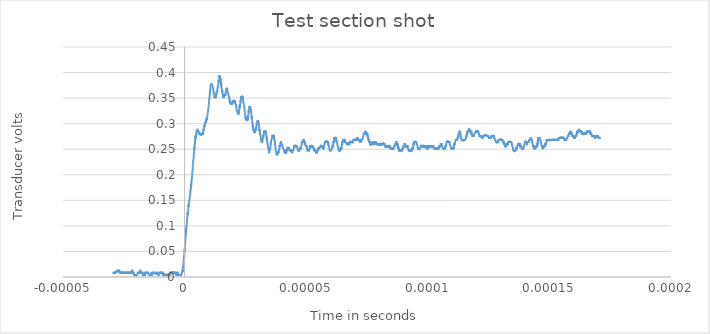
| Category | Series 0 |
|---|---|
| -2.92e-05 | 0.01 |
| -2.9168e-05 | 0.006 |
| -2.9136e-05 | 0.01 |
| -2.9104e-05 | 0.01 |
| -2.9072e-05 | 0.01 |
| -2.904e-05 | 0.01 |
| -2.9008e-05 | 0.01 |
| -2.8976e-05 | 0.01 |
| -2.8944e-05 | 0.01 |
| -2.8912e-05 | 0.01 |
| -2.888e-05 | 0.006 |
| -2.8848e-05 | 0.01 |
| -2.8816e-05 | 0.01 |
| -2.8784e-05 | 0.006 |
| -2.8752e-05 | 0.01 |
| -2.872e-05 | 0.01 |
| -2.8688e-05 | 0.01 |
| -2.8656e-05 | 0.006 |
| -2.8624e-05 | 0.01 |
| -2.8592e-05 | 0.01 |
| -2.856e-05 | 0.01 |
| -2.8528e-05 | 0.01 |
| -2.8496e-05 | 0.01 |
| -2.8464e-05 | 0.01 |
| -2.8432e-05 | 0.01 |
| -2.84e-05 | 0.01 |
| -2.8368e-05 | 0.01 |
| -2.8336e-05 | 0.01 |
| -2.8304e-05 | 0.01 |
| -2.8272e-05 | 0.01 |
| -2.824e-05 | 0.01 |
| -2.8208e-05 | 0.01 |
| -2.8176e-05 | 0.01 |
| -2.8144e-05 | 0.01 |
| -2.8112e-05 | 0.01 |
| -2.808e-05 | 0.01 |
| -2.8048e-05 | 0.01 |
| -2.8016e-05 | 0.01 |
| -2.7984e-05 | 0.01 |
| -2.7952e-05 | 0.01 |
| -2.792e-05 | 0.01 |
| -2.7888e-05 | 0.01 |
| -2.7856e-05 | 0.01 |
| -2.7824e-05 | 0.01 |
| -2.7792e-05 | 0.01 |
| -2.776e-05 | 0.01 |
| -2.7728e-05 | 0.01 |
| -2.7696e-05 | 0.014 |
| -2.7664e-05 | 0.01 |
| -2.7632e-05 | 0.01 |
| -2.76e-05 | 0.01 |
| -2.7568e-05 | 0.01 |
| -2.7536e-05 | 0.01 |
| -2.7504e-05 | 0.01 |
| -2.7472e-05 | 0.01 |
| -2.744e-05 | 0.01 |
| -2.7408e-05 | 0.01 |
| -2.7376e-05 | 0.01 |
| -2.7344e-05 | 0.01 |
| -2.7312e-05 | 0.01 |
| -2.728e-05 | 0.01 |
| -2.7248e-05 | 0.01 |
| -2.7216e-05 | 0.01 |
| -2.7184e-05 | 0.01 |
| -2.7152e-05 | 0.01 |
| -2.712e-05 | 0.01 |
| -2.7088e-05 | 0.014 |
| -2.7056e-05 | 0.01 |
| -2.7024e-05 | 0.01 |
| -2.6992e-05 | 0.01 |
| -2.696e-05 | 0.01 |
| -2.6928e-05 | 0.01 |
| -2.6896e-05 | 0.01 |
| -2.6864e-05 | 0.01 |
| -2.6832e-05 | 0.014 |
| -2.68e-05 | 0.01 |
| -2.6768e-05 | 0.01 |
| -2.6736e-05 | 0.01 |
| -2.6704e-05 | 0.01 |
| -2.6672e-05 | 0.01 |
| -2.664e-05 | 0.01 |
| -2.6608e-05 | 0.01 |
| -2.6576e-05 | 0.01 |
| -2.6544e-05 | 0.01 |
| -2.6512e-05 | 0.01 |
| -2.648e-05 | 0.01 |
| -2.6448e-05 | 0.01 |
| -2.6416e-05 | 0.006 |
| -2.6384e-05 | 0.01 |
| -2.6352e-05 | 0.01 |
| -2.632e-05 | 0.01 |
| -2.6288e-05 | 0.01 |
| -2.6256e-05 | 0.01 |
| -2.6224e-05 | 0.006 |
| -2.6192e-05 | 0.01 |
| -2.616e-05 | 0.006 |
| -2.6128e-05 | 0.006 |
| -2.6096e-05 | 0.006 |
| -2.6064e-05 | 0.01 |
| -2.6032e-05 | 0.01 |
| -2.6e-05 | 0.006 |
| -2.5968e-05 | 0.01 |
| -2.5936e-05 | 0.01 |
| -2.5904e-05 | 0.01 |
| -2.5872e-05 | 0.01 |
| -2.584e-05 | 0.01 |
| -2.5808e-05 | 0.01 |
| -2.5776e-05 | 0.006 |
| -2.5744e-05 | 0.01 |
| -2.5712e-05 | 0.01 |
| -2.568e-05 | 0.01 |
| -2.5648e-05 | 0.006 |
| -2.5616e-05 | 0.01 |
| -2.5584e-05 | 0.01 |
| -2.5552e-05 | 0.01 |
| -2.552e-05 | 0.01 |
| -2.5488e-05 | 0.01 |
| -2.5456e-05 | 0.01 |
| -2.5424e-05 | 0.01 |
| -2.5392e-05 | 0.01 |
| -2.536e-05 | 0.01 |
| -2.5328e-05 | 0.006 |
| -2.5296e-05 | 0.01 |
| -2.5264e-05 | 0.01 |
| -2.5232e-05 | 0.01 |
| -2.52e-05 | 0.01 |
| -2.5168e-05 | 0.01 |
| -2.5136e-05 | 0.01 |
| -2.5104e-05 | 0.01 |
| -2.5072e-05 | 0.01 |
| -2.504e-05 | 0.01 |
| -2.5008e-05 | 0.01 |
| -2.4976e-05 | 0.006 |
| -2.4944e-05 | 0.01 |
| -2.4912e-05 | 0.01 |
| -2.488e-05 | 0.01 |
| -2.4848e-05 | 0.01 |
| -2.4816e-05 | 0.01 |
| -2.4784e-05 | 0.006 |
| -2.4752e-05 | 0.01 |
| -2.472e-05 | 0.006 |
| -2.4688e-05 | 0.01 |
| -2.4656e-05 | 0.01 |
| -2.4624e-05 | 0.006 |
| -2.4592e-05 | 0.01 |
| -2.456e-05 | 0.006 |
| -2.4528e-05 | 0.01 |
| -2.4496e-05 | 0.01 |
| -2.4464e-05 | 0.006 |
| -2.4432e-05 | 0.01 |
| -2.44e-05 | 0.01 |
| -2.4368e-05 | 0.006 |
| -2.4336e-05 | 0.006 |
| -2.4304e-05 | 0.006 |
| -2.4272e-05 | 0.006 |
| -2.424e-05 | 0.006 |
| -2.4208e-05 | 0.006 |
| -2.4176e-05 | 0.006 |
| -2.4144e-05 | 0.006 |
| -2.4112e-05 | 0.006 |
| -2.408e-05 | 0.006 |
| -2.4048e-05 | 0.01 |
| -2.4016e-05 | 0.01 |
| -2.3984e-05 | 0.01 |
| -2.3952e-05 | 0.01 |
| -2.392e-05 | 0.01 |
| -2.3888e-05 | 0.01 |
| -2.3856e-05 | 0.01 |
| -2.3824e-05 | 0.01 |
| -2.3792e-05 | 0.006 |
| -2.376e-05 | 0.01 |
| -2.3728e-05 | 0.01 |
| -2.3696e-05 | 0.01 |
| -2.3664e-05 | 0.01 |
| -2.3632e-05 | 0.01 |
| -2.36e-05 | 0.01 |
| -2.3568e-05 | 0.01 |
| -2.3536e-05 | 0.01 |
| -2.3504e-05 | 0.006 |
| -2.3472e-05 | 0.01 |
| -2.344e-05 | 0.01 |
| -2.3408e-05 | 0.01 |
| -2.3376e-05 | 0.01 |
| -2.3344e-05 | 0.006 |
| -2.3312e-05 | 0.01 |
| -2.328e-05 | 0.01 |
| -2.3248e-05 | 0.006 |
| -2.3216e-05 | 0.01 |
| -2.3184e-05 | 0.01 |
| -2.3152e-05 | 0.01 |
| -2.312e-05 | 0.01 |
| -2.3088e-05 | 0.01 |
| -2.3056e-05 | 0.006 |
| -2.3024e-05 | 0.01 |
| -2.2992e-05 | 0.01 |
| -2.296e-05 | 0.01 |
| -2.2928e-05 | 0.01 |
| -2.2896e-05 | 0.01 |
| -2.2864e-05 | 0.01 |
| -2.2832e-05 | 0.01 |
| -2.28e-05 | 0.01 |
| -2.2768e-05 | 0.006 |
| -2.2736e-05 | 0.01 |
| -2.2704e-05 | 0.01 |
| -2.2672e-05 | 0.01 |
| -2.264e-05 | 0.01 |
| -2.2608e-05 | 0.01 |
| -2.2576e-05 | 0.01 |
| -2.2544e-05 | 0.01 |
| -2.2512e-05 | 0.01 |
| -2.248e-05 | 0.01 |
| -2.2448e-05 | 0.01 |
| -2.2416e-05 | 0.01 |
| -2.2384e-05 | 0.01 |
| -2.2352e-05 | 0.01 |
| -2.232e-05 | 0.01 |
| -2.2288e-05 | 0.01 |
| -2.2256e-05 | 0.01 |
| -2.2224e-05 | 0.006 |
| -2.2192e-05 | 0.01 |
| -2.216e-05 | 0.006 |
| -2.2128e-05 | 0.01 |
| -2.2096e-05 | 0.01 |
| -2.2064e-05 | 0.01 |
| -2.2032e-05 | 0.01 |
| -2.2e-05 | 0.01 |
| -2.1968e-05 | 0.01 |
| -2.1936e-05 | 0.01 |
| -2.1904e-05 | 0.01 |
| -2.1872e-05 | 0.01 |
| -2.184e-05 | 0.01 |
| -2.1808e-05 | 0.01 |
| -2.1776e-05 | 0.01 |
| -2.1744e-05 | 0.01 |
| -2.1712e-05 | 0.01 |
| -2.168e-05 | 0.01 |
| -2.1648e-05 | 0.01 |
| -2.1616e-05 | 0.01 |
| -2.1584e-05 | 0.01 |
| -2.1552e-05 | 0.01 |
| -2.152e-05 | 0.014 |
| -2.1488e-05 | 0.01 |
| -2.1456e-05 | 0.01 |
| -2.1424e-05 | 0.01 |
| -2.1392e-05 | 0.01 |
| -2.136e-05 | 0.01 |
| -2.1328e-05 | 0.006 |
| -2.1296e-05 | 0.01 |
| -2.1264e-05 | 0.01 |
| -2.1232e-05 | 0.01 |
| -2.12e-05 | 0.006 |
| -2.1168e-05 | 0.01 |
| -2.1136e-05 | 0.006 |
| -2.1104e-05 | 0.01 |
| -2.1072e-05 | 0.01 |
| -2.104e-05 | 0.01 |
| -2.1008e-05 | 0.01 |
| -2.0976e-05 | 0.01 |
| -2.0944e-05 | 0.006 |
| -2.0912e-05 | 0.006 |
| -2.088e-05 | 0.006 |
| -2.0848e-05 | 0.006 |
| -2.0816e-05 | 0.006 |
| -2.0784e-05 | 0.006 |
| -2.0752e-05 | 0.006 |
| -2.072e-05 | 0.006 |
| -2.0688e-05 | 0.006 |
| -2.0656e-05 | 0.006 |
| -2.0624e-05 | 0.002 |
| -2.0592e-05 | 0.002 |
| -2.056e-05 | 0.006 |
| -2.0528e-05 | 0.006 |
| -2.0496e-05 | 0.006 |
| -2.0464e-05 | 0.006 |
| -2.0432e-05 | 0.002 |
| -2.04e-05 | 0.002 |
| -2.0368e-05 | 0.006 |
| -2.0336e-05 | 0.002 |
| -2.0304e-05 | 0.002 |
| -2.0272e-05 | 0.002 |
| -2.024e-05 | 0.002 |
| -2.0208e-05 | 0.002 |
| -2.0176e-05 | 0.002 |
| -2.0144e-05 | 0.002 |
| -2.0112e-05 | 0.002 |
| -2.008e-05 | 0.002 |
| -2.0048e-05 | 0.006 |
| -2.0016e-05 | 0.002 |
| -1.9984e-05 | 0.002 |
| -1.9952e-05 | 0.002 |
| -1.992e-05 | 0.006 |
| -1.9888e-05 | 0.002 |
| -1.9856e-05 | 0.002 |
| -1.9824e-05 | 0.006 |
| -1.9792e-05 | 0.002 |
| -1.976e-05 | 0.002 |
| -1.9728e-05 | 0.002 |
| -1.9696e-05 | 0.002 |
| -1.9664e-05 | 0.002 |
| -1.9632e-05 | 0.002 |
| -1.96e-05 | 0.006 |
| -1.9568e-05 | 0.006 |
| -1.9536e-05 | 0.006 |
| -1.9504e-05 | 0.006 |
| -1.9472e-05 | 0.006 |
| -1.944e-05 | 0.006 |
| -1.9408e-05 | 0.006 |
| -1.9376e-05 | 0.006 |
| -1.9344e-05 | 0.006 |
| -1.9312e-05 | 0.006 |
| -1.928e-05 | 0.006 |
| -1.9248e-05 | 0.006 |
| -1.9216e-05 | 0.01 |
| -1.9184e-05 | 0.006 |
| -1.9152e-05 | 0.006 |
| -1.912e-05 | 0.006 |
| -1.9088e-05 | 0.01 |
| -1.9056e-05 | 0.006 |
| -1.9024e-05 | 0.01 |
| -1.8992e-05 | 0.01 |
| -1.896e-05 | 0.006 |
| -1.8928e-05 | 0.006 |
| -1.8896e-05 | 0.006 |
| -1.8864e-05 | 0.01 |
| -1.8832e-05 | 0.006 |
| -1.88e-05 | 0.01 |
| -1.8768e-05 | 0.006 |
| -1.8736e-05 | 0.006 |
| -1.8704e-05 | 0.006 |
| -1.8672e-05 | 0.01 |
| -1.864e-05 | 0.01 |
| -1.8608e-05 | 0.01 |
| -1.8576e-05 | 0.01 |
| -1.8544e-05 | 0.01 |
| -1.8512e-05 | 0.01 |
| -1.848e-05 | 0.01 |
| -1.8448e-05 | 0.01 |
| -1.8416e-05 | 0.01 |
| -1.8384e-05 | 0.01 |
| -1.8352e-05 | 0.01 |
| -1.832e-05 | 0.01 |
| -1.8288e-05 | 0.01 |
| -1.8256e-05 | 0.01 |
| -1.8224e-05 | 0.01 |
| -1.8192e-05 | 0.014 |
| -1.816e-05 | 0.01 |
| -1.8128e-05 | 0.01 |
| -1.8096e-05 | 0.01 |
| -1.8064e-05 | 0.01 |
| -1.8032e-05 | 0.01 |
| -1.8e-05 | 0.01 |
| -1.7968e-05 | 0.01 |
| -1.7936e-05 | 0.01 |
| -1.7904e-05 | 0.01 |
| -1.7872e-05 | 0.01 |
| -1.784e-05 | 0.006 |
| -1.7808e-05 | 0.01 |
| -1.7776e-05 | 0.01 |
| -1.7744e-05 | 0.01 |
| -1.7712e-05 | 0.006 |
| -1.768e-05 | 0.006 |
| -1.7648e-05 | 0.01 |
| -1.7616e-05 | 0.01 |
| -1.7584e-05 | 0.01 |
| -1.7552e-05 | 0.006 |
| -1.752e-05 | 0.006 |
| -1.7488e-05 | 0.006 |
| -1.7456e-05 | 0.01 |
| -1.7424e-05 | 0.01 |
| -1.7392e-05 | 0.006 |
| -1.736e-05 | 0.006 |
| -1.7328e-05 | 0.006 |
| -1.7296e-05 | 0.01 |
| -1.7264e-05 | 0.006 |
| -1.7232e-05 | 0.006 |
| -1.72e-05 | 0.006 |
| -1.7168e-05 | 0.002 |
| -1.7136e-05 | 0.002 |
| -1.7104e-05 | 0.002 |
| -1.7072e-05 | 0.006 |
| -1.704e-05 | 0.002 |
| -1.7008e-05 | 0.002 |
| -1.6976e-05 | 0.006 |
| -1.6944e-05 | 0.006 |
| -1.6912e-05 | 0.006 |
| -1.688e-05 | 0.006 |
| -1.6848e-05 | 0.002 |
| -1.6816e-05 | 0.002 |
| -1.6784e-05 | 0.006 |
| -1.6752e-05 | 0.006 |
| -1.672e-05 | 0.006 |
| -1.6688e-05 | 0.006 |
| -1.6656e-05 | 0.002 |
| -1.6624e-05 | 0.006 |
| -1.6592e-05 | 0.006 |
| -1.656e-05 | 0.002 |
| -1.6528e-05 | 0.006 |
| -1.6496e-05 | 0.002 |
| -1.6464e-05 | 0.006 |
| -1.6432e-05 | 0.002 |
| -1.64e-05 | 0.006 |
| -1.6368e-05 | 0.002 |
| -1.6336e-05 | 0.006 |
| -1.6304e-05 | 0.01 |
| -1.6272e-05 | 0.006 |
| -1.624e-05 | 0.006 |
| -1.6208e-05 | 0.006 |
| -1.6176e-05 | 0.006 |
| -1.6144e-05 | 0.006 |
| -1.6112e-05 | 0.006 |
| -1.608e-05 | 0.006 |
| -1.6048e-05 | 0.006 |
| -1.6016e-05 | 0.006 |
| -1.5984e-05 | 0.01 |
| -1.5952e-05 | 0.01 |
| -1.592e-05 | 0.01 |
| -1.5888e-05 | 0.006 |
| -1.5856e-05 | 0.01 |
| -1.5824e-05 | 0.01 |
| -1.5792e-05 | 0.01 |
| -1.576e-05 | 0.006 |
| -1.5728e-05 | 0.006 |
| -1.5696e-05 | 0.01 |
| -1.5664e-05 | 0.01 |
| -1.5632e-05 | 0.006 |
| -1.56e-05 | 0.006 |
| -1.5568e-05 | 0.006 |
| -1.5536e-05 | 0.01 |
| -1.5504e-05 | 0.006 |
| -1.5472e-05 | 0.01 |
| -1.544e-05 | 0.01 |
| -1.5408e-05 | 0.01 |
| -1.5376e-05 | 0.01 |
| -1.5344e-05 | 0.006 |
| -1.5312e-05 | 0.006 |
| -1.528e-05 | 0.01 |
| -1.5248e-05 | 0.01 |
| -1.5216e-05 | 0.006 |
| -1.5184e-05 | 0.006 |
| -1.5152e-05 | 0.006 |
| -1.512e-05 | 0.006 |
| -1.5088e-05 | 0.01 |
| -1.5056e-05 | 0.01 |
| -1.5024e-05 | 0.006 |
| -1.4992e-05 | 0.006 |
| -1.496e-05 | 0.006 |
| -1.4928e-05 | 0.006 |
| -1.4896e-05 | 0.006 |
| -1.4864e-05 | 0.006 |
| -1.4832e-05 | 0.006 |
| -1.48e-05 | 0.006 |
| -1.4768e-05 | 0.006 |
| -1.4736e-05 | 0.006 |
| -1.4704e-05 | 0.006 |
| -1.4672e-05 | 0.006 |
| -1.464e-05 | 0.006 |
| -1.4608e-05 | 0.006 |
| -1.4576e-05 | 0.006 |
| -1.4544e-05 | 0.006 |
| -1.4512e-05 | 0.006 |
| -1.448e-05 | 0.006 |
| -1.4448e-05 | 0.002 |
| -1.4416e-05 | 0.006 |
| -1.4384e-05 | 0.006 |
| -1.4352e-05 | 0.006 |
| -1.432e-05 | 0.006 |
| -1.4288e-05 | 0.006 |
| -1.4256e-05 | 0.006 |
| -1.4224e-05 | 0.006 |
| -1.4192e-05 | 0.002 |
| -1.416e-05 | 0.006 |
| -1.4128e-05 | 0.002 |
| -1.4096e-05 | 0.006 |
| -1.4064e-05 | 0.006 |
| -1.4032e-05 | 0.006 |
| -1.4e-05 | 0.002 |
| -1.3968e-05 | 0.002 |
| -1.3936e-05 | 0.006 |
| -1.3904e-05 | 0.002 |
| -1.3872e-05 | 0.006 |
| -1.384e-05 | 0.006 |
| -1.3808e-05 | 0.006 |
| -1.3776e-05 | 0.006 |
| -1.3744e-05 | 0.006 |
| -1.3712e-05 | 0.006 |
| -1.368e-05 | 0.002 |
| -1.3648e-05 | 0.002 |
| -1.3616e-05 | 0.01 |
| -1.3584e-05 | 0.006 |
| -1.3552e-05 | 0.002 |
| -1.352e-05 | 0.006 |
| -1.3488e-05 | 0.006 |
| -1.3456e-05 | 0.006 |
| -1.3424e-05 | 0.006 |
| -1.3392e-05 | 0.006 |
| -1.336e-05 | 0.006 |
| -1.3328e-05 | 0.006 |
| -1.3296e-05 | 0.006 |
| -1.3264e-05 | 0.006 |
| -1.3232e-05 | 0.006 |
| -1.32e-05 | 0.006 |
| -1.3168e-05 | 0.006 |
| -1.3136e-05 | 0.006 |
| -1.3104e-05 | 0.006 |
| -1.3072e-05 | 0.01 |
| -1.304e-05 | 0.006 |
| -1.3008e-05 | 0.006 |
| -1.2976e-05 | 0.006 |
| -1.2944e-05 | 0.01 |
| -1.2912e-05 | 0.006 |
| -1.288e-05 | 0.01 |
| -1.2848e-05 | 0.01 |
| -1.2816e-05 | 0.01 |
| -1.2784e-05 | 0.006 |
| -1.2752e-05 | 0.006 |
| -1.272e-05 | 0.006 |
| -1.2688e-05 | 0.01 |
| -1.2656e-05 | 0.01 |
| -1.2624e-05 | 0.01 |
| -1.2592e-05 | 0.006 |
| -1.256e-05 | 0.006 |
| -1.2528e-05 | 0.006 |
| -1.2496e-05 | 0.006 |
| -1.2464e-05 | 0.006 |
| -1.2432e-05 | 0.006 |
| -1.24e-05 | 0.01 |
| -1.2368e-05 | 0.01 |
| -1.2336e-05 | 0.006 |
| -1.2304e-05 | 0.006 |
| -1.2272e-05 | 0.01 |
| -1.224e-05 | 0.006 |
| -1.2208e-05 | 0.006 |
| -1.2176e-05 | 0.006 |
| -1.2144e-05 | 0.006 |
| -1.2112e-05 | 0.006 |
| -1.208e-05 | 0.006 |
| -1.2048e-05 | 0.006 |
| -1.2016e-05 | 0.006 |
| -1.1984e-05 | 0.006 |
| -1.1952e-05 | 0.006 |
| -1.192e-05 | 0.01 |
| -1.1888e-05 | 0.006 |
| -1.1856e-05 | 0.006 |
| -1.1824e-05 | 0.006 |
| -1.1792e-05 | 0.006 |
| -1.176e-05 | 0.006 |
| -1.1728e-05 | 0.006 |
| -1.1696e-05 | 0.006 |
| -1.1664e-05 | 0.006 |
| -1.1632e-05 | 0.006 |
| -1.16e-05 | 0.006 |
| -1.1568e-05 | 0.006 |
| -1.1536e-05 | 0.006 |
| -1.1504e-05 | 0.006 |
| -1.1472e-05 | 0.006 |
| -1.144e-05 | 0.006 |
| -1.1408e-05 | 0.006 |
| -1.1376e-05 | 0.006 |
| -1.1344e-05 | 0.006 |
| -1.1312e-05 | 0.006 |
| -1.128e-05 | 0.006 |
| -1.1248e-05 | 0.006 |
| -1.1216e-05 | 0.006 |
| -1.1184e-05 | 0.006 |
| -1.1152e-05 | 0.01 |
| -1.112e-05 | 0.006 |
| -1.1088e-05 | 0.006 |
| -1.1056e-05 | 0.006 |
| -1.1024e-05 | 0.006 |
| -1.0992e-05 | 0.01 |
| -1.096e-05 | 0.006 |
| -1.0928e-05 | 0.006 |
| -1.0896e-05 | 0.006 |
| -1.0864e-05 | 0.006 |
| -1.0832e-05 | 0.006 |
| -1.08e-05 | 0.006 |
| -1.0768e-05 | 0.002 |
| -1.0736e-05 | 0.01 |
| -1.0704e-05 | 0.006 |
| -1.0672e-05 | 0.006 |
| -1.064e-05 | 0.006 |
| -1.0608e-05 | 0.006 |
| -1.0576e-05 | 0.006 |
| -1.0544e-05 | 0.006 |
| -1.0512e-05 | 0.006 |
| -1.048e-05 | 0.006 |
| -1.0448e-05 | 0.006 |
| -1.0416e-05 | 0.006 |
| -1.0384e-05 | 0.006 |
| -1.0352e-05 | 0.006 |
| -1.032e-05 | 0.006 |
| -1.0288e-05 | 0.006 |
| -1.0256e-05 | 0.01 |
| -1.0224e-05 | 0.006 |
| -1.0192e-05 | 0.006 |
| -1.016e-05 | 0.006 |
| -1.0128e-05 | 0.006 |
| -1.0096e-05 | 0.006 |
| -1.0064e-05 | 0.01 |
| -1.0032e-05 | 0.01 |
| -1e-05 | 0.01 |
| -9.968e-06 | 0.006 |
| -9.936e-06 | 0.01 |
| -9.904e-06 | 0.01 |
| -9.872e-06 | 0.006 |
| -9.84e-06 | 0.006 |
| -9.808e-06 | 0.01 |
| -9.776e-06 | 0.01 |
| -9.744e-06 | 0.006 |
| -9.712e-06 | 0.006 |
| -9.68e-06 | 0.006 |
| -9.648e-06 | 0.006 |
| -9.616e-06 | 0.01 |
| -9.584e-06 | 0.01 |
| -9.552e-06 | 0.01 |
| -9.52e-06 | 0.006 |
| -9.488e-06 | 0.006 |
| -9.456e-06 | 0.01 |
| -9.424e-06 | 0.006 |
| -9.392e-06 | 0.01 |
| -9.36e-06 | 0.01 |
| -9.328e-06 | 0.01 |
| -9.296e-06 | 0.006 |
| -9.264e-06 | 0.006 |
| -9.232e-06 | 0.006 |
| -9.2e-06 | 0.006 |
| -9.168e-06 | 0.006 |
| -9.136e-06 | 0.01 |
| -9.104e-06 | 0.01 |
| -9.072e-06 | 0.01 |
| -9.04e-06 | 0.006 |
| -9.008e-06 | 0.006 |
| -8.976e-06 | 0.01 |
| -8.944e-06 | 0.006 |
| -8.912e-06 | 0.006 |
| -8.88e-06 | 0.006 |
| -8.848e-06 | 0.006 |
| -8.816e-06 | 0.006 |
| -8.784e-06 | 0.006 |
| -8.752e-06 | 0.006 |
| -8.72e-06 | 0.006 |
| -8.688e-06 | 0.006 |
| -8.656e-06 | 0.002 |
| -8.624e-06 | 0.006 |
| -8.592e-06 | 0.006 |
| -8.56e-06 | 0.006 |
| -8.528e-06 | 0.006 |
| -8.496e-06 | 0.006 |
| -8.464e-06 | 0.006 |
| -8.432e-06 | 0.006 |
| -8.4e-06 | 0.006 |
| -8.368e-06 | 0.006 |
| -8.336e-06 | 0.006 |
| -8.304e-06 | 0.006 |
| -8.272e-06 | 0.006 |
| -8.24e-06 | 0.006 |
| -8.208e-06 | 0.006 |
| -8.176e-06 | 0.006 |
| -8.144e-06 | 0.006 |
| -8.112e-06 | 0.006 |
| -8.08e-06 | 0.006 |
| -8.048e-06 | 0.006 |
| -8.016e-06 | 0.002 |
| -7.984e-06 | 0.006 |
| -7.952e-06 | 0.002 |
| -7.92e-06 | 0.006 |
| -7.888e-06 | 0.002 |
| -7.856e-06 | 0.006 |
| -7.824e-06 | 0.006 |
| -7.792e-06 | 0.006 |
| -7.76e-06 | 0.006 |
| -7.728e-06 | 0.006 |
| -7.696e-06 | 0.002 |
| -7.664e-06 | 0.006 |
| -7.632e-06 | 0.006 |
| -7.6e-06 | 0.006 |
| -7.568e-06 | 0.006 |
| -7.536e-06 | 0.002 |
| -7.504e-06 | 0.002 |
| -7.472e-06 | 0.006 |
| -7.44e-06 | 0.006 |
| -7.408e-06 | 0.006 |
| -7.376e-06 | 0.002 |
| -7.344e-06 | 0.006 |
| -7.312e-06 | 0.006 |
| -7.28e-06 | 0.002 |
| -7.248e-06 | 0.006 |
| -7.216e-06 | 0.006 |
| -7.184e-06 | 0.006 |
| -7.152e-06 | 0.006 |
| -7.12e-06 | 0.002 |
| -7.088e-06 | 0.006 |
| -7.056e-06 | 0.006 |
| -7.024e-06 | 0.006 |
| -6.992e-06 | 0.002 |
| -6.96e-06 | 0.006 |
| -6.928e-06 | 0.002 |
| -6.896e-06 | 0.002 |
| -6.864e-06 | 0.006 |
| -6.832e-06 | 0.006 |
| -6.8e-06 | 0.002 |
| -6.768e-06 | 0.006 |
| -6.736e-06 | 0.006 |
| -6.704e-06 | 0.006 |
| -6.672e-06 | 0.006 |
| -6.64e-06 | 0.006 |
| -6.608e-06 | 0.006 |
| -6.576e-06 | 0.006 |
| -6.544e-06 | 0.006 |
| -6.512e-06 | 0.006 |
| -6.48e-06 | 0.006 |
| -6.448e-06 | 0.006 |
| -6.416e-06 | 0.006 |
| -6.384e-06 | 0.006 |
| -6.352e-06 | 0.002 |
| -6.32e-06 | 0.006 |
| -6.288e-06 | 0.006 |
| -6.256e-06 | 0.006 |
| -6.224e-06 | 0.006 |
| -6.192e-06 | 0.006 |
| -6.16e-06 | 0.006 |
| -6.128e-06 | 0.006 |
| -6.096e-06 | 0.006 |
| -6.064e-06 | 0.006 |
| -6.032e-06 | 0.01 |
| -6e-06 | 0.006 |
| -5.968e-06 | 0.006 |
| -5.936e-06 | 0.002 |
| -5.904e-06 | 0.006 |
| -5.872e-06 | 0.006 |
| -5.84e-06 | 0.01 |
| -5.808e-06 | 0.01 |
| -5.776e-06 | 0.006 |
| -5.744e-06 | 0.01 |
| -5.712e-06 | 0.01 |
| -5.68e-06 | 0.006 |
| -5.648e-06 | 0.006 |
| -5.616e-06 | 0.01 |
| -5.584e-06 | 0.01 |
| -5.552e-06 | 0.006 |
| -5.52e-06 | 0.01 |
| -5.488e-06 | 0.006 |
| -5.456e-06 | 0.01 |
| -5.424e-06 | 0.01 |
| -5.392e-06 | 0.01 |
| -5.36e-06 | 0.01 |
| -5.328e-06 | 0.01 |
| -5.296e-06 | 0.01 |
| -5.264e-06 | 0.01 |
| -5.232e-06 | 0.01 |
| -5.2e-06 | 0.01 |
| -5.168e-06 | 0.01 |
| -5.136e-06 | 0.01 |
| -5.104e-06 | 0.01 |
| -5.072e-06 | 0.01 |
| -5.04e-06 | 0.01 |
| -5.008e-06 | 0.01 |
| -4.976e-06 | 0.01 |
| -4.944e-06 | 0.01 |
| -4.912e-06 | 0.01 |
| -4.88e-06 | 0.01 |
| -4.848e-06 | 0.01 |
| -4.816e-06 | 0.01 |
| -4.784e-06 | 0.01 |
| -4.752e-06 | 0.01 |
| -4.72e-06 | 0.01 |
| -4.688e-06 | 0.01 |
| -4.656e-06 | 0.01 |
| -4.624e-06 | 0.01 |
| -4.592e-06 | 0.01 |
| -4.56e-06 | 0.01 |
| -4.528e-06 | 0.006 |
| -4.496e-06 | 0.01 |
| -4.464e-06 | 0.006 |
| -4.432e-06 | 0.01 |
| -4.4e-06 | 0.01 |
| -4.368e-06 | 0.01 |
| -4.336e-06 | 0.006 |
| -4.304e-06 | 0.01 |
| -4.272e-06 | 0.006 |
| -4.24e-06 | 0.006 |
| -4.208e-06 | 0.01 |
| -4.176e-06 | 0.006 |
| -4.144e-06 | 0.006 |
| -4.112e-06 | 0.006 |
| -4.08e-06 | 0.006 |
| -4.048e-06 | 0.006 |
| -4.016e-06 | 0.01 |
| -3.984e-06 | 0.006 |
| -3.952e-06 | 0.006 |
| -3.92e-06 | 0.01 |
| -3.888e-06 | 0.006 |
| -3.856e-06 | 0.006 |
| -3.824e-06 | 0.006 |
| -3.792e-06 | 0.01 |
| -3.76e-06 | 0.01 |
| -3.728e-06 | 0.006 |
| -3.696e-06 | 0.006 |
| -3.664e-06 | 0.006 |
| -3.632e-06 | 0.006 |
| -3.6e-06 | 0.006 |
| -3.568e-06 | 0.006 |
| -3.536e-06 | 0.006 |
| -3.504e-06 | 0.006 |
| -3.472e-06 | 0.006 |
| -3.44e-06 | 0.01 |
| -3.408e-06 | 0.006 |
| -3.376e-06 | 0.006 |
| -3.344e-06 | 0.002 |
| -3.312e-06 | 0.006 |
| -3.28e-06 | 0.006 |
| -3.248e-06 | 0.006 |
| -3.216e-06 | 0.006 |
| -3.184e-06 | 0.006 |
| -3.152e-06 | 0.006 |
| -3.12e-06 | 0.01 |
| -3.088e-06 | 0.01 |
| -3.056e-06 | 0.002 |
| -3.024e-06 | 0.01 |
| -2.992e-06 | 0.006 |
| -2.96e-06 | 0.006 |
| -2.928e-06 | 0.006 |
| -2.896e-06 | 0.006 |
| -2.864e-06 | 0.006 |
| -2.832e-06 | 0.006 |
| -2.8e-06 | 0.006 |
| -2.768e-06 | 0.006 |
| -2.736e-06 | 0.01 |
| -2.704e-06 | 0.006 |
| -2.672e-06 | 0.006 |
| -2.64e-06 | 0.006 |
| -2.608e-06 | 0.006 |
| -2.576e-06 | 0.006 |
| -2.544e-06 | 0.006 |
| -2.512e-06 | 0.006 |
| -2.48e-06 | 0.006 |
| -2.448e-06 | 0.006 |
| -2.416e-06 | 0.006 |
| -2.384e-06 | 0.006 |
| -2.352e-06 | 0.006 |
| -2.32e-06 | 0.002 |
| -2.288e-06 | 0.006 |
| -2.256e-06 | 0.002 |
| -2.224e-06 | 0.006 |
| -2.192e-06 | 0.002 |
| -2.16e-06 | 0.006 |
| -2.128e-06 | 0.002 |
| -2.096e-06 | 0.006 |
| -2.064e-06 | 0.002 |
| -2.032e-06 | 0.006 |
| -2e-06 | 0.006 |
| -1.968e-06 | 0.002 |
| -1.936e-06 | 0.002 |
| -1.904e-06 | 0.006 |
| -1.872e-06 | 0.006 |
| -1.84e-06 | 0.006 |
| -1.808e-06 | 0.006 |
| -1.776e-06 | 0.006 |
| -1.744e-06 | 0.006 |
| -1.712e-06 | 0.006 |
| -1.68e-06 | 0.006 |
| -1.648e-06 | 0.006 |
| -1.616e-06 | 0.002 |
| -1.584e-06 | 0.002 |
| -1.552e-06 | 0.002 |
| -1.52e-06 | 0.002 |
| -1.488e-06 | 0.006 |
| -1.456e-06 | 0.006 |
| -1.424e-06 | 0.002 |
| -1.392e-06 | 0.006 |
| -1.36e-06 | 0.006 |
| -1.328e-06 | 0.006 |
| -1.296e-06 | 0.006 |
| -1.264e-06 | 0.006 |
| -1.232e-06 | 0.006 |
| -1.2e-06 | 0.006 |
| -1.168e-06 | 0.006 |
| -1.136e-06 | 0.006 |
| -1.104e-06 | 0.006 |
| -1.072e-06 | 0.01 |
| -1.04e-06 | 0.006 |
| -1.008e-06 | 0.01 |
| -9.76e-07 | 0.01 |
| -9.44e-07 | 0.01 |
| -9.12e-07 | 0.01 |
| -8.8e-07 | 0.014 |
| -8.48e-07 | 0.01 |
| -8.16e-07 | 0.01 |
| -7.84e-07 | 0.014 |
| -7.52e-07 | 0.014 |
| -7.2e-07 | 0.018 |
| -6.88e-07 | 0.018 |
| -6.56e-07 | 0.018 |
| -6.24e-07 | 0.018 |
| -5.92e-07 | 0.022 |
| -5.6e-07 | 0.018 |
| -5.28e-07 | 0.022 |
| -4.96e-07 | 0.022 |
| -4.64e-07 | 0.026 |
| -4.32e-07 | 0.03 |
| -4e-07 | 0.03 |
| -3.68e-07 | 0.03 |
| -3.36e-07 | 0.03 |
| -3.04e-07 | 0.034 |
| -2.72e-07 | 0.034 |
| -2.4e-07 | 0.034 |
| -2.08e-07 | 0.042 |
| -1.76e-07 | 0.042 |
| -1.44e-07 | 0.038 |
| -1.12e-07 | 0.046 |
| -8e-08 | 0.046 |
| -4.8e-08 | 0.046 |
| -1.6e-08 | 0.05 |
| 1.6e-08 | 0.054 |
| 4.8e-08 | 0.05 |
| 8e-08 | 0.058 |
| 1.12e-07 | 0.058 |
| 1.44e-07 | 0.058 |
| 1.76e-07 | 0.062 |
| 2.08e-07 | 0.062 |
| 2.4e-07 | 0.066 |
| 2.72e-07 | 0.07 |
| 3.04e-07 | 0.07 |
| 3.36e-07 | 0.074 |
| 3.68e-07 | 0.074 |
| 4e-07 | 0.078 |
| 4.32e-07 | 0.078 |
| 4.64e-07 | 0.082 |
| 4.96e-07 | 0.082 |
| 5.28e-07 | 0.086 |
| 5.6e-07 | 0.09 |
| 5.92e-07 | 0.09 |
| 6.24e-07 | 0.094 |
| 6.56e-07 | 0.094 |
| 6.88e-07 | 0.094 |
| 7.2e-07 | 0.098 |
| 7.52e-07 | 0.098 |
| 7.84e-07 | 0.098 |
| 8.16e-07 | 0.102 |
| 8.48e-07 | 0.102 |
| 8.8e-07 | 0.102 |
| 9.12e-07 | 0.106 |
| 9.44e-07 | 0.106 |
| 9.76e-07 | 0.11 |
| 1.008e-06 | 0.114 |
| 1.04e-06 | 0.114 |
| 1.072e-06 | 0.114 |
| 1.104e-06 | 0.114 |
| 1.136e-06 | 0.118 |
| 1.168e-06 | 0.118 |
| 1.2e-06 | 0.122 |
| 1.232e-06 | 0.126 |
| 1.264e-06 | 0.122 |
| 1.296e-06 | 0.126 |
| 1.328e-06 | 0.126 |
| 1.36e-06 | 0.126 |
| 1.392e-06 | 0.126 |
| 1.424e-06 | 0.13 |
| 1.456e-06 | 0.13 |
| 1.488e-06 | 0.134 |
| 1.52e-06 | 0.134 |
| 1.552e-06 | 0.134 |
| 1.584e-06 | 0.138 |
| 1.616e-06 | 0.142 |
| 1.648e-06 | 0.138 |
| 1.68e-06 | 0.138 |
| 1.712e-06 | 0.142 |
| 1.744e-06 | 0.142 |
| 1.776e-06 | 0.146 |
| 1.808e-06 | 0.146 |
| 1.84e-06 | 0.15 |
| 1.872e-06 | 0.15 |
| 1.904e-06 | 0.15 |
| 1.936e-06 | 0.15 |
| 1.968e-06 | 0.15 |
| 2e-06 | 0.154 |
| 2.032e-06 | 0.154 |
| 2.064e-06 | 0.154 |
| 2.096e-06 | 0.154 |
| 2.128e-06 | 0.158 |
| 2.16e-06 | 0.158 |
| 2.192e-06 | 0.158 |
| 2.224e-06 | 0.162 |
| 2.256e-06 | 0.162 |
| 2.288e-06 | 0.162 |
| 2.32e-06 | 0.162 |
| 2.352e-06 | 0.166 |
| 2.384e-06 | 0.166 |
| 2.416e-06 | 0.166 |
| 2.448e-06 | 0.17 |
| 2.48e-06 | 0.17 |
| 2.512e-06 | 0.174 |
| 2.544e-06 | 0.174 |
| 2.576e-06 | 0.174 |
| 2.608e-06 | 0.178 |
| 2.64e-06 | 0.178 |
| 2.672e-06 | 0.182 |
| 2.704e-06 | 0.178 |
| 2.736e-06 | 0.182 |
| 2.768e-06 | 0.182 |
| 2.8e-06 | 0.186 |
| 2.832e-06 | 0.186 |
| 2.864e-06 | 0.186 |
| 2.896e-06 | 0.19 |
| 2.928e-06 | 0.19 |
| 2.96e-06 | 0.19 |
| 2.992e-06 | 0.194 |
| 3.024e-06 | 0.194 |
| 3.056e-06 | 0.198 |
| 3.088e-06 | 0.198 |
| 3.12e-06 | 0.202 |
| 3.152e-06 | 0.202 |
| 3.184e-06 | 0.206 |
| 3.216e-06 | 0.206 |
| 3.248e-06 | 0.21 |
| 3.28e-06 | 0.21 |
| 3.312e-06 | 0.21 |
| 3.344e-06 | 0.214 |
| 3.376e-06 | 0.214 |
| 3.408e-06 | 0.218 |
| 3.44e-06 | 0.218 |
| 3.472e-06 | 0.222 |
| 3.504e-06 | 0.226 |
| 3.536e-06 | 0.226 |
| 3.568e-06 | 0.226 |
| 3.6e-06 | 0.23 |
| 3.632e-06 | 0.23 |
| 3.664e-06 | 0.234 |
| 3.696e-06 | 0.234 |
| 3.728e-06 | 0.234 |
| 3.76e-06 | 0.238 |
| 3.792e-06 | 0.238 |
| 3.824e-06 | 0.242 |
| 3.856e-06 | 0.246 |
| 3.888e-06 | 0.246 |
| 3.92e-06 | 0.246 |
| 3.952e-06 | 0.25 |
| 3.984e-06 | 0.25 |
| 4.016e-06 | 0.254 |
| 4.048e-06 | 0.25 |
| 4.08e-06 | 0.254 |
| 4.112e-06 | 0.258 |
| 4.144e-06 | 0.258 |
| 4.176e-06 | 0.262 |
| 4.208e-06 | 0.262 |
| 4.24e-06 | 0.262 |
| 4.272e-06 | 0.266 |
| 4.304e-06 | 0.266 |
| 4.336e-06 | 0.266 |
| 4.368e-06 | 0.27 |
| 4.4e-06 | 0.27 |
| 4.432e-06 | 0.274 |
| 4.464e-06 | 0.27 |
| 4.496e-06 | 0.274 |
| 4.528e-06 | 0.274 |
| 4.56e-06 | 0.278 |
| 4.592e-06 | 0.274 |
| 4.624e-06 | 0.274 |
| 4.656e-06 | 0.278 |
| 4.688e-06 | 0.278 |
| 4.72e-06 | 0.278 |
| 4.752e-06 | 0.278 |
| 4.784e-06 | 0.282 |
| 4.816e-06 | 0.282 |
| 4.848e-06 | 0.282 |
| 4.88e-06 | 0.282 |
| 4.912e-06 | 0.282 |
| 4.944e-06 | 0.282 |
| 4.976e-06 | 0.286 |
| 5.008e-06 | 0.282 |
| 5.04e-06 | 0.282 |
| 5.072e-06 | 0.286 |
| 5.104e-06 | 0.286 |
| 5.136e-06 | 0.286 |
| 5.168e-06 | 0.286 |
| 5.2e-06 | 0.286 |
| 5.232e-06 | 0.286 |
| 5.264e-06 | 0.286 |
| 5.296e-06 | 0.286 |
| 5.328e-06 | 0.29 |
| 5.36e-06 | 0.286 |
| 5.392e-06 | 0.286 |
| 5.424e-06 | 0.286 |
| 5.456e-06 | 0.286 |
| 5.488e-06 | 0.286 |
| 5.52e-06 | 0.286 |
| 5.552e-06 | 0.286 |
| 5.584e-06 | 0.286 |
| 5.616e-06 | 0.286 |
| 5.648e-06 | 0.286 |
| 5.68e-06 | 0.286 |
| 5.712e-06 | 0.286 |
| 5.744e-06 | 0.286 |
| 5.776e-06 | 0.286 |
| 5.808e-06 | 0.282 |
| 5.84e-06 | 0.282 |
| 5.872e-06 | 0.282 |
| 5.904e-06 | 0.282 |
| 5.936e-06 | 0.282 |
| 5.968e-06 | 0.282 |
| 6e-06 | 0.282 |
| 6.032e-06 | 0.282 |
| 6.064e-06 | 0.282 |
| 6.096e-06 | 0.282 |
| 6.128e-06 | 0.278 |
| 6.16e-06 | 0.282 |
| 6.192e-06 | 0.278 |
| 6.224e-06 | 0.278 |
| 6.256e-06 | 0.278 |
| 6.288e-06 | 0.278 |
| 6.32e-06 | 0.278 |
| 6.352e-06 | 0.278 |
| 6.384e-06 | 0.282 |
| 6.416e-06 | 0.278 |
| 6.448e-06 | 0.278 |
| 6.48e-06 | 0.278 |
| 6.512e-06 | 0.278 |
| 6.544e-06 | 0.278 |
| 6.576e-06 | 0.278 |
| 6.608e-06 | 0.278 |
| 6.64e-06 | 0.278 |
| 6.672e-06 | 0.278 |
| 6.704e-06 | 0.278 |
| 6.736e-06 | 0.278 |
| 6.768e-06 | 0.278 |
| 6.8e-06 | 0.278 |
| 6.832e-06 | 0.278 |
| 6.864e-06 | 0.278 |
| 6.896e-06 | 0.278 |
| 6.928e-06 | 0.278 |
| 6.96e-06 | 0.278 |
| 6.992e-06 | 0.278 |
| 7.024e-06 | 0.278 |
| 7.056e-06 | 0.278 |
| 7.088e-06 | 0.278 |
| 7.12e-06 | 0.278 |
| 7.152e-06 | 0.278 |
| 7.184e-06 | 0.278 |
| 7.216e-06 | 0.278 |
| 7.248e-06 | 0.278 |
| 7.28e-06 | 0.278 |
| 7.312e-06 | 0.282 |
| 7.344e-06 | 0.278 |
| 7.376e-06 | 0.278 |
| 7.408e-06 | 0.282 |
| 7.44e-06 | 0.282 |
| 7.472e-06 | 0.282 |
| 7.504e-06 | 0.278 |
| 7.536e-06 | 0.282 |
| 7.568e-06 | 0.282 |
| 7.6e-06 | 0.282 |
| 7.632e-06 | 0.282 |
| 7.664e-06 | 0.286 |
| 7.696e-06 | 0.286 |
| 7.728e-06 | 0.286 |
| 7.76e-06 | 0.286 |
| 7.792e-06 | 0.29 |
| 7.824e-06 | 0.286 |
| 7.856e-06 | 0.29 |
| 7.888e-06 | 0.29 |
| 7.92e-06 | 0.29 |
| 7.952e-06 | 0.29 |
| 7.984e-06 | 0.29 |
| 8.016e-06 | 0.29 |
| 8.048e-06 | 0.294 |
| 8.08e-06 | 0.294 |
| 8.112e-06 | 0.294 |
| 8.144e-06 | 0.294 |
| 8.176e-06 | 0.298 |
| 8.208e-06 | 0.294 |
| 8.24e-06 | 0.298 |
| 8.272e-06 | 0.298 |
| 8.304e-06 | 0.298 |
| 8.336e-06 | 0.298 |
| 8.368e-06 | 0.298 |
| 8.4e-06 | 0.302 |
| 8.432e-06 | 0.298 |
| 8.464e-06 | 0.302 |
| 8.496e-06 | 0.302 |
| 8.528e-06 | 0.302 |
| 8.56e-06 | 0.302 |
| 8.592e-06 | 0.302 |
| 8.624e-06 | 0.302 |
| 8.656e-06 | 0.302 |
| 8.688e-06 | 0.302 |
| 8.72e-06 | 0.306 |
| 8.752e-06 | 0.302 |
| 8.784e-06 | 0.306 |
| 8.816e-06 | 0.306 |
| 8.848e-06 | 0.306 |
| 8.88e-06 | 0.306 |
| 8.912e-06 | 0.306 |
| 8.944e-06 | 0.306 |
| 8.976e-06 | 0.31 |
| 9.008e-06 | 0.306 |
| 9.04e-06 | 0.306 |
| 9.072e-06 | 0.306 |
| 9.104e-06 | 0.31 |
| 9.136e-06 | 0.31 |
| 9.168e-06 | 0.31 |
| 9.2e-06 | 0.31 |
| 9.232e-06 | 0.314 |
| 9.264e-06 | 0.314 |
| 9.296e-06 | 0.314 |
| 9.328e-06 | 0.314 |
| 9.36e-06 | 0.314 |
| 9.392e-06 | 0.318 |
| 9.424e-06 | 0.318 |
| 9.456e-06 | 0.318 |
| 9.488e-06 | 0.322 |
| 9.52e-06 | 0.322 |
| 9.552e-06 | 0.322 |
| 9.584e-06 | 0.322 |
| 9.616e-06 | 0.326 |
| 9.648e-06 | 0.326 |
| 9.68e-06 | 0.326 |
| 9.712e-06 | 0.33 |
| 9.744e-06 | 0.33 |
| 9.776e-06 | 0.33 |
| 9.808e-06 | 0.334 |
| 9.84e-06 | 0.334 |
| 9.872e-06 | 0.334 |
| 9.904e-06 | 0.334 |
| 9.936e-06 | 0.338 |
| 9.968e-06 | 0.338 |
| 1e-05 | 0.338 |
| 1.0032e-05 | 0.342 |
| 1.0064e-05 | 0.346 |
| 1.0096e-05 | 0.346 |
| 1.0128e-05 | 0.35 |
| 1.016e-05 | 0.35 |
| 1.0192e-05 | 0.35 |
| 1.0224e-05 | 0.35 |
| 1.0256e-05 | 0.354 |
| 1.0288e-05 | 0.354 |
| 1.032e-05 | 0.358 |
| 1.0352e-05 | 0.358 |
| 1.0384e-05 | 0.358 |
| 1.0416e-05 | 0.362 |
| 1.0448e-05 | 0.362 |
| 1.048e-05 | 0.366 |
| 1.0512e-05 | 0.366 |
| 1.0544e-05 | 0.366 |
| 1.0576e-05 | 0.366 |
| 1.0608e-05 | 0.37 |
| 1.064e-05 | 0.37 |
| 1.0672e-05 | 0.374 |
| 1.0704e-05 | 0.374 |
| 1.0736e-05 | 0.374 |
| 1.0768e-05 | 0.374 |
| 1.08e-05 | 0.378 |
| 1.0832e-05 | 0.374 |
| 1.0864e-05 | 0.378 |
| 1.0896e-05 | 0.378 |
| 1.0928e-05 | 0.378 |
| 1.096e-05 | 0.378 |
| 1.0992e-05 | 0.378 |
| 1.1024e-05 | 0.378 |
| 1.1056e-05 | 0.378 |
| 1.1088e-05 | 0.378 |
| 1.112e-05 | 0.378 |
| 1.1152e-05 | 0.378 |
| 1.1184e-05 | 0.378 |
| 1.1216e-05 | 0.378 |
| 1.1248e-05 | 0.378 |
| 1.128e-05 | 0.378 |
| 1.1312e-05 | 0.378 |
| 1.1344e-05 | 0.378 |
| 1.1376e-05 | 0.374 |
| 1.1408e-05 | 0.374 |
| 1.144e-05 | 0.374 |
| 1.1472e-05 | 0.374 |
| 1.1504e-05 | 0.374 |
| 1.1536e-05 | 0.374 |
| 1.1568e-05 | 0.37 |
| 1.16e-05 | 0.37 |
| 1.1632e-05 | 0.37 |
| 1.1664e-05 | 0.37 |
| 1.1696e-05 | 0.37 |
| 1.1728e-05 | 0.37 |
| 1.176e-05 | 0.37 |
| 1.1792e-05 | 0.366 |
| 1.1824e-05 | 0.366 |
| 1.1856e-05 | 0.366 |
| 1.1888e-05 | 0.366 |
| 1.192e-05 | 0.362 |
| 1.1952e-05 | 0.362 |
| 1.1984e-05 | 0.358 |
| 1.2016e-05 | 0.358 |
| 1.2048e-05 | 0.358 |
| 1.208e-05 | 0.358 |
| 1.2112e-05 | 0.358 |
| 1.2144e-05 | 0.358 |
| 1.2176e-05 | 0.354 |
| 1.2208e-05 | 0.354 |
| 1.224e-05 | 0.354 |
| 1.2272e-05 | 0.35 |
| 1.2304e-05 | 0.354 |
| 1.2336e-05 | 0.354 |
| 1.2368e-05 | 0.354 |
| 1.24e-05 | 0.354 |
| 1.2432e-05 | 0.35 |
| 1.2464e-05 | 0.35 |
| 1.2496e-05 | 0.35 |
| 1.2528e-05 | 0.35 |
| 1.256e-05 | 0.35 |
| 1.2592e-05 | 0.35 |
| 1.2624e-05 | 0.35 |
| 1.2656e-05 | 0.35 |
| 1.2688e-05 | 0.35 |
| 1.272e-05 | 0.354 |
| 1.2752e-05 | 0.35 |
| 1.2784e-05 | 0.35 |
| 1.2816e-05 | 0.354 |
| 1.2848e-05 | 0.354 |
| 1.288e-05 | 0.354 |
| 1.2912e-05 | 0.354 |
| 1.2944e-05 | 0.354 |
| 1.2976e-05 | 0.354 |
| 1.3008e-05 | 0.358 |
| 1.304e-05 | 0.358 |
| 1.3072e-05 | 0.362 |
| 1.3104e-05 | 0.358 |
| 1.3136e-05 | 0.358 |
| 1.3168e-05 | 0.358 |
| 1.32e-05 | 0.362 |
| 1.3232e-05 | 0.362 |
| 1.3264e-05 | 0.362 |
| 1.3296e-05 | 0.362 |
| 1.3328e-05 | 0.362 |
| 1.336e-05 | 0.362 |
| 1.3392e-05 | 0.366 |
| 1.3424e-05 | 0.366 |
| 1.3456e-05 | 0.366 |
| 1.3488e-05 | 0.366 |
| 1.352e-05 | 0.37 |
| 1.3552e-05 | 0.37 |
| 1.3584e-05 | 0.37 |
| 1.3616e-05 | 0.37 |
| 1.3648e-05 | 0.37 |
| 1.368e-05 | 0.374 |
| 1.3712e-05 | 0.374 |
| 1.3744e-05 | 0.374 |
| 1.3776e-05 | 0.374 |
| 1.3808e-05 | 0.378 |
| 1.384e-05 | 0.378 |
| 1.3872e-05 | 0.378 |
| 1.3904e-05 | 0.378 |
| 1.3936e-05 | 0.378 |
| 1.3968e-05 | 0.382 |
| 1.4e-05 | 0.382 |
| 1.4032e-05 | 0.386 |
| 1.4064e-05 | 0.382 |
| 1.4096e-05 | 0.386 |
| 1.4128e-05 | 0.386 |
| 1.416e-05 | 0.386 |
| 1.4192e-05 | 0.386 |
| 1.4224e-05 | 0.39 |
| 1.4256e-05 | 0.39 |
| 1.4288e-05 | 0.39 |
| 1.432e-05 | 0.394 |
| 1.4352e-05 | 0.39 |
| 1.4384e-05 | 0.394 |
| 1.4416e-05 | 0.39 |
| 1.4448e-05 | 0.39 |
| 1.448e-05 | 0.394 |
| 1.4512e-05 | 0.39 |
| 1.4544e-05 | 0.39 |
| 1.4576e-05 | 0.39 |
| 1.4608e-05 | 0.39 |
| 1.464e-05 | 0.39 |
| 1.4672e-05 | 0.39 |
| 1.4704e-05 | 0.39 |
| 1.4736e-05 | 0.386 |
| 1.4768e-05 | 0.39 |
| 1.48e-05 | 0.386 |
| 1.4832e-05 | 0.382 |
| 1.4864e-05 | 0.378 |
| 1.4896e-05 | 0.382 |
| 1.4928e-05 | 0.382 |
| 1.496e-05 | 0.378 |
| 1.4992e-05 | 0.378 |
| 1.5024e-05 | 0.374 |
| 1.5056e-05 | 0.378 |
| 1.5088e-05 | 0.374 |
| 1.512e-05 | 0.374 |
| 1.5152e-05 | 0.37 |
| 1.5184e-05 | 0.37 |
| 1.5216e-05 | 0.37 |
| 1.5248e-05 | 0.37 |
| 1.528e-05 | 0.37 |
| 1.5312e-05 | 0.366 |
| 1.5344e-05 | 0.366 |
| 1.5376e-05 | 0.362 |
| 1.5408e-05 | 0.362 |
| 1.544e-05 | 0.362 |
| 1.5472e-05 | 0.362 |
| 1.5504e-05 | 0.366 |
| 1.5536e-05 | 0.362 |
| 1.5568e-05 | 0.358 |
| 1.56e-05 | 0.358 |
| 1.5632e-05 | 0.358 |
| 1.5664e-05 | 0.358 |
| 1.5696e-05 | 0.358 |
| 1.5728e-05 | 0.358 |
| 1.576e-05 | 0.354 |
| 1.5792e-05 | 0.358 |
| 1.5824e-05 | 0.354 |
| 1.5856e-05 | 0.354 |
| 1.5888e-05 | 0.354 |
| 1.592e-05 | 0.35 |
| 1.5952e-05 | 0.354 |
| 1.5984e-05 | 0.354 |
| 1.6016e-05 | 0.354 |
| 1.6048e-05 | 0.354 |
| 1.608e-05 | 0.354 |
| 1.6112e-05 | 0.354 |
| 1.6144e-05 | 0.354 |
| 1.6176e-05 | 0.354 |
| 1.6208e-05 | 0.35 |
| 1.624e-05 | 0.354 |
| 1.6272e-05 | 0.354 |
| 1.6304e-05 | 0.354 |
| 1.6336e-05 | 0.354 |
| 1.6368e-05 | 0.354 |
| 1.64e-05 | 0.354 |
| 1.6432e-05 | 0.354 |
| 1.6464e-05 | 0.354 |
| 1.6496e-05 | 0.354 |
| 1.6528e-05 | 0.358 |
| 1.656e-05 | 0.358 |
| 1.6592e-05 | 0.358 |
| 1.6624e-05 | 0.354 |
| 1.6656e-05 | 0.354 |
| 1.6688e-05 | 0.358 |
| 1.672e-05 | 0.354 |
| 1.6752e-05 | 0.358 |
| 1.6784e-05 | 0.358 |
| 1.6816e-05 | 0.358 |
| 1.6848e-05 | 0.358 |
| 1.688e-05 | 0.362 |
| 1.6912e-05 | 0.362 |
| 1.6944e-05 | 0.362 |
| 1.6976e-05 | 0.362 |
| 1.7008e-05 | 0.366 |
| 1.704e-05 | 0.366 |
| 1.7072e-05 | 0.366 |
| 1.7104e-05 | 0.366 |
| 1.7136e-05 | 0.366 |
| 1.7168e-05 | 0.37 |
| 1.72e-05 | 0.37 |
| 1.7232e-05 | 0.37 |
| 1.7264e-05 | 0.37 |
| 1.7296e-05 | 0.37 |
| 1.7328e-05 | 0.37 |
| 1.736e-05 | 0.37 |
| 1.7392e-05 | 0.37 |
| 1.7424e-05 | 0.37 |
| 1.7456e-05 | 0.37 |
| 1.7488e-05 | 0.37 |
| 1.752e-05 | 0.366 |
| 1.7552e-05 | 0.366 |
| 1.7584e-05 | 0.366 |
| 1.7616e-05 | 0.366 |
| 1.7648e-05 | 0.366 |
| 1.768e-05 | 0.362 |
| 1.7712e-05 | 0.362 |
| 1.7744e-05 | 0.362 |
| 1.7776e-05 | 0.362 |
| 1.7808e-05 | 0.362 |
| 1.784e-05 | 0.358 |
| 1.7872e-05 | 0.362 |
| 1.7904e-05 | 0.358 |
| 1.7936e-05 | 0.358 |
| 1.7968e-05 | 0.358 |
| 1.8e-05 | 0.358 |
| 1.8032e-05 | 0.354 |
| 1.8064e-05 | 0.354 |
| 1.8096e-05 | 0.354 |
| 1.8128e-05 | 0.354 |
| 1.816e-05 | 0.354 |
| 1.8192e-05 | 0.354 |
| 1.8224e-05 | 0.35 |
| 1.8256e-05 | 0.35 |
| 1.8288e-05 | 0.354 |
| 1.832e-05 | 0.35 |
| 1.8352e-05 | 0.35 |
| 1.8384e-05 | 0.35 |
| 1.8416e-05 | 0.35 |
| 1.8448e-05 | 0.346 |
| 1.848e-05 | 0.346 |
| 1.8512e-05 | 0.346 |
| 1.8544e-05 | 0.346 |
| 1.8576e-05 | 0.342 |
| 1.8608e-05 | 0.346 |
| 1.864e-05 | 0.346 |
| 1.8672e-05 | 0.342 |
| 1.8704e-05 | 0.342 |
| 1.8736e-05 | 0.342 |
| 1.8768e-05 | 0.342 |
| 1.88e-05 | 0.342 |
| 1.8832e-05 | 0.342 |
| 1.8864e-05 | 0.338 |
| 1.8896e-05 | 0.342 |
| 1.8928e-05 | 0.342 |
| 1.896e-05 | 0.342 |
| 1.8992e-05 | 0.338 |
| 1.9024e-05 | 0.342 |
| 1.9056e-05 | 0.342 |
| 1.9088e-05 | 0.342 |
| 1.912e-05 | 0.342 |
| 1.9152e-05 | 0.338 |
| 1.9184e-05 | 0.338 |
| 1.9216e-05 | 0.342 |
| 1.9248e-05 | 0.342 |
| 1.928e-05 | 0.338 |
| 1.9312e-05 | 0.342 |
| 1.9344e-05 | 0.338 |
| 1.9376e-05 | 0.342 |
| 1.9408e-05 | 0.338 |
| 1.944e-05 | 0.342 |
| 1.9472e-05 | 0.342 |
| 1.9504e-05 | 0.342 |
| 1.9536e-05 | 0.338 |
| 1.9568e-05 | 0.338 |
| 1.96e-05 | 0.338 |
| 1.9632e-05 | 0.338 |
| 1.9664e-05 | 0.338 |
| 1.9696e-05 | 0.338 |
| 1.9728e-05 | 0.342 |
| 1.976e-05 | 0.342 |
| 1.9792e-05 | 0.342 |
| 1.9824e-05 | 0.342 |
| 1.9856e-05 | 0.346 |
| 1.9888e-05 | 0.342 |
| 1.992e-05 | 0.342 |
| 1.9952e-05 | 0.342 |
| 1.9984e-05 | 0.342 |
| 2.0016e-05 | 0.342 |
| 2.0048e-05 | 0.342 |
| 2.008e-05 | 0.346 |
| 2.0112e-05 | 0.346 |
| 2.0144e-05 | 0.342 |
| 2.0176e-05 | 0.346 |
| 2.0208e-05 | 0.346 |
| 2.024e-05 | 0.346 |
| 2.0272e-05 | 0.346 |
| 2.0304e-05 | 0.346 |
| 2.0336e-05 | 0.346 |
| 2.0368e-05 | 0.346 |
| 2.04e-05 | 0.346 |
| 2.0432e-05 | 0.346 |
| 2.0464e-05 | 0.342 |
| 2.0496e-05 | 0.342 |
| 2.0528e-05 | 0.346 |
| 2.056e-05 | 0.342 |
| 2.0592e-05 | 0.342 |
| 2.0624e-05 | 0.346 |
| 2.0656e-05 | 0.342 |
| 2.0688e-05 | 0.342 |
| 2.072e-05 | 0.342 |
| 2.0752e-05 | 0.346 |
| 2.0784e-05 | 0.342 |
| 2.0816e-05 | 0.342 |
| 2.0848e-05 | 0.342 |
| 2.088e-05 | 0.338 |
| 2.0912e-05 | 0.338 |
| 2.0944e-05 | 0.338 |
| 2.0976e-05 | 0.338 |
| 2.1008e-05 | 0.338 |
| 2.104e-05 | 0.338 |
| 2.1072e-05 | 0.338 |
| 2.1104e-05 | 0.334 |
| 2.1136e-05 | 0.338 |
| 2.1168e-05 | 0.334 |
| 2.12e-05 | 0.334 |
| 2.1232e-05 | 0.334 |
| 2.1264e-05 | 0.334 |
| 2.1296e-05 | 0.33 |
| 2.1328e-05 | 0.33 |
| 2.136e-05 | 0.33 |
| 2.1392e-05 | 0.326 |
| 2.1424e-05 | 0.326 |
| 2.1456e-05 | 0.326 |
| 2.1488e-05 | 0.326 |
| 2.152e-05 | 0.326 |
| 2.1552e-05 | 0.326 |
| 2.1584e-05 | 0.326 |
| 2.1616e-05 | 0.326 |
| 2.1648e-05 | 0.326 |
| 2.168e-05 | 0.322 |
| 2.1712e-05 | 0.322 |
| 2.1744e-05 | 0.326 |
| 2.1776e-05 | 0.322 |
| 2.1808e-05 | 0.322 |
| 2.184e-05 | 0.322 |
| 2.1872e-05 | 0.322 |
| 2.1904e-05 | 0.322 |
| 2.1936e-05 | 0.322 |
| 2.1968e-05 | 0.322 |
| 2.2e-05 | 0.322 |
| 2.2032e-05 | 0.322 |
| 2.2064e-05 | 0.318 |
| 2.2096e-05 | 0.318 |
| 2.2128e-05 | 0.322 |
| 2.216e-05 | 0.322 |
| 2.2192e-05 | 0.318 |
| 2.2224e-05 | 0.326 |
| 2.2256e-05 | 0.322 |
| 2.2288e-05 | 0.322 |
| 2.232e-05 | 0.326 |
| 2.2352e-05 | 0.326 |
| 2.2384e-05 | 0.326 |
| 2.2416e-05 | 0.326 |
| 2.2448e-05 | 0.326 |
| 2.248e-05 | 0.326 |
| 2.2512e-05 | 0.326 |
| 2.2544e-05 | 0.33 |
| 2.2576e-05 | 0.334 |
| 2.2608e-05 | 0.33 |
| 2.264e-05 | 0.334 |
| 2.2672e-05 | 0.334 |
| 2.2704e-05 | 0.338 |
| 2.2736e-05 | 0.334 |
| 2.2768e-05 | 0.334 |
| 2.28e-05 | 0.338 |
| 2.2832e-05 | 0.338 |
| 2.2864e-05 | 0.338 |
| 2.2896e-05 | 0.338 |
| 2.2928e-05 | 0.338 |
| 2.296e-05 | 0.342 |
| 2.2992e-05 | 0.346 |
| 2.3024e-05 | 0.346 |
| 2.3056e-05 | 0.342 |
| 2.3088e-05 | 0.346 |
| 2.312e-05 | 0.346 |
| 2.3152e-05 | 0.35 |
| 2.3184e-05 | 0.346 |
| 2.3216e-05 | 0.35 |
| 2.3248e-05 | 0.35 |
| 2.328e-05 | 0.35 |
| 2.3312e-05 | 0.354 |
| 2.3344e-05 | 0.35 |
| 2.3376e-05 | 0.354 |
| 2.3408e-05 | 0.354 |
| 2.344e-05 | 0.354 |
| 2.3472e-05 | 0.354 |
| 2.3504e-05 | 0.354 |
| 2.3536e-05 | 0.354 |
| 2.3568e-05 | 0.354 |
| 2.36e-05 | 0.354 |
| 2.3632e-05 | 0.354 |
| 2.3664e-05 | 0.354 |
| 2.3696e-05 | 0.354 |
| 2.3728e-05 | 0.354 |
| 2.376e-05 | 0.354 |
| 2.3792e-05 | 0.35 |
| 2.3824e-05 | 0.354 |
| 2.3856e-05 | 0.354 |
| 2.3888e-05 | 0.35 |
| 2.392e-05 | 0.35 |
| 2.3952e-05 | 0.35 |
| 2.3984e-05 | 0.346 |
| 2.4016e-05 | 0.35 |
| 2.4048e-05 | 0.346 |
| 2.408e-05 | 0.346 |
| 2.4112e-05 | 0.342 |
| 2.4144e-05 | 0.342 |
| 2.4176e-05 | 0.342 |
| 2.4208e-05 | 0.342 |
| 2.424e-05 | 0.342 |
| 2.4272e-05 | 0.338 |
| 2.4304e-05 | 0.338 |
| 2.4336e-05 | 0.338 |
| 2.4368e-05 | 0.338 |
| 2.44e-05 | 0.334 |
| 2.4432e-05 | 0.334 |
| 2.4464e-05 | 0.334 |
| 2.4496e-05 | 0.334 |
| 2.4528e-05 | 0.334 |
| 2.456e-05 | 0.33 |
| 2.4592e-05 | 0.33 |
| 2.4624e-05 | 0.326 |
| 2.4656e-05 | 0.326 |
| 2.4688e-05 | 0.326 |
| 2.472e-05 | 0.322 |
| 2.4752e-05 | 0.322 |
| 2.4784e-05 | 0.322 |
| 2.4816e-05 | 0.322 |
| 2.4848e-05 | 0.318 |
| 2.488e-05 | 0.318 |
| 2.4912e-05 | 0.318 |
| 2.4944e-05 | 0.314 |
| 2.4976e-05 | 0.314 |
| 2.5008e-05 | 0.314 |
| 2.504e-05 | 0.314 |
| 2.5072e-05 | 0.31 |
| 2.5104e-05 | 0.314 |
| 2.5136e-05 | 0.31 |
| 2.5168e-05 | 0.31 |
| 2.52e-05 | 0.31 |
| 2.5232e-05 | 0.31 |
| 2.5264e-05 | 0.31 |
| 2.5296e-05 | 0.306 |
| 2.5328e-05 | 0.306 |
| 2.536e-05 | 0.306 |
| 2.5392e-05 | 0.306 |
| 2.5424e-05 | 0.306 |
| 2.5456e-05 | 0.306 |
| 2.5488e-05 | 0.306 |
| 2.552e-05 | 0.306 |
| 2.5552e-05 | 0.306 |
| 2.5584e-05 | 0.306 |
| 2.5616e-05 | 0.306 |
| 2.5648e-05 | 0.306 |
| 2.568e-05 | 0.306 |
| 2.5712e-05 | 0.306 |
| 2.5744e-05 | 0.306 |
| 2.5776e-05 | 0.306 |
| 2.5808e-05 | 0.306 |
| 2.584e-05 | 0.306 |
| 2.5872e-05 | 0.31 |
| 2.5904e-05 | 0.306 |
| 2.5936e-05 | 0.31 |
| 2.5968e-05 | 0.31 |
| 2.6e-05 | 0.31 |
| 2.6032e-05 | 0.314 |
| 2.6064e-05 | 0.31 |
| 2.6096e-05 | 0.314 |
| 2.6128e-05 | 0.318 |
| 2.616e-05 | 0.318 |
| 2.6192e-05 | 0.318 |
| 2.6224e-05 | 0.318 |
| 2.6256e-05 | 0.322 |
| 2.6288e-05 | 0.322 |
| 2.632e-05 | 0.326 |
| 2.6352e-05 | 0.322 |
| 2.6384e-05 | 0.326 |
| 2.6416e-05 | 0.326 |
| 2.6448e-05 | 0.326 |
| 2.648e-05 | 0.326 |
| 2.6512e-05 | 0.326 |
| 2.6544e-05 | 0.33 |
| 2.6576e-05 | 0.33 |
| 2.6608e-05 | 0.33 |
| 2.664e-05 | 0.334 |
| 2.6672e-05 | 0.334 |
| 2.6704e-05 | 0.33 |
| 2.6736e-05 | 0.334 |
| 2.6768e-05 | 0.334 |
| 2.68e-05 | 0.334 |
| 2.6832e-05 | 0.33 |
| 2.6864e-05 | 0.33 |
| 2.6896e-05 | 0.33 |
| 2.6928e-05 | 0.334 |
| 2.696e-05 | 0.33 |
| 2.6992e-05 | 0.33 |
| 2.7024e-05 | 0.33 |
| 2.7056e-05 | 0.33 |
| 2.7088e-05 | 0.326 |
| 2.712e-05 | 0.33 |
| 2.7152e-05 | 0.33 |
| 2.7184e-05 | 0.326 |
| 2.7216e-05 | 0.326 |
| 2.7248e-05 | 0.326 |
| 2.728e-05 | 0.322 |
| 2.7312e-05 | 0.322 |
| 2.7344e-05 | 0.322 |
| 2.7376e-05 | 0.322 |
| 2.7408e-05 | 0.322 |
| 2.744e-05 | 0.318 |
| 2.7472e-05 | 0.318 |
| 2.7504e-05 | 0.318 |
| 2.7536e-05 | 0.314 |
| 2.7568e-05 | 0.31 |
| 2.76e-05 | 0.314 |
| 2.7632e-05 | 0.314 |
| 2.7664e-05 | 0.31 |
| 2.7696e-05 | 0.31 |
| 2.7728e-05 | 0.31 |
| 2.776e-05 | 0.306 |
| 2.7792e-05 | 0.306 |
| 2.7824e-05 | 0.306 |
| 2.7856e-05 | 0.302 |
| 2.7888e-05 | 0.302 |
| 2.792e-05 | 0.302 |
| 2.7952e-05 | 0.302 |
| 2.7984e-05 | 0.298 |
| 2.8016e-05 | 0.298 |
| 2.8048e-05 | 0.294 |
| 2.808e-05 | 0.298 |
| 2.8112e-05 | 0.294 |
| 2.8144e-05 | 0.29 |
| 2.8176e-05 | 0.294 |
| 2.8208e-05 | 0.294 |
| 2.824e-05 | 0.29 |
| 2.8272e-05 | 0.29 |
| 2.8304e-05 | 0.29 |
| 2.8336e-05 | 0.286 |
| 2.8368e-05 | 0.286 |
| 2.84e-05 | 0.29 |
| 2.8432e-05 | 0.286 |
| 2.8464e-05 | 0.286 |
| 2.8496e-05 | 0.286 |
| 2.8528e-05 | 0.282 |
| 2.856e-05 | 0.286 |
| 2.8592e-05 | 0.282 |
| 2.8624e-05 | 0.286 |
| 2.8656e-05 | 0.282 |
| 2.8688e-05 | 0.282 |
| 2.872e-05 | 0.286 |
| 2.8752e-05 | 0.282 |
| 2.8784e-05 | 0.282 |
| 2.8816e-05 | 0.282 |
| 2.8848e-05 | 0.282 |
| 2.888e-05 | 0.286 |
| 2.8912e-05 | 0.282 |
| 2.8944e-05 | 0.286 |
| 2.8976e-05 | 0.282 |
| 2.9008e-05 | 0.286 |
| 2.904e-05 | 0.286 |
| 2.9072e-05 | 0.286 |
| 2.9104e-05 | 0.286 |
| 2.9136e-05 | 0.29 |
| 2.9168e-05 | 0.29 |
| 2.92e-05 | 0.286 |
| 2.9232e-05 | 0.286 |
| 2.9264e-05 | 0.29 |
| 2.9296e-05 | 0.29 |
| 2.9328e-05 | 0.29 |
| 2.936e-05 | 0.294 |
| 2.9392e-05 | 0.29 |
| 2.9424e-05 | 0.294 |
| 2.9456e-05 | 0.294 |
| 2.9488e-05 | 0.294 |
| 2.952e-05 | 0.294 |
| 2.9552e-05 | 0.298 |
| 2.9584e-05 | 0.298 |
| 2.9616e-05 | 0.298 |
| 2.9648e-05 | 0.298 |
| 2.968e-05 | 0.298 |
| 2.9712e-05 | 0.302 |
| 2.9744e-05 | 0.302 |
| 2.9776e-05 | 0.302 |
| 2.9808e-05 | 0.302 |
| 2.984e-05 | 0.302 |
| 2.9872e-05 | 0.302 |
| 2.9904e-05 | 0.302 |
| 2.9936e-05 | 0.306 |
| 2.9968e-05 | 0.302 |
| 3e-05 | 0.302 |
| 3.0032e-05 | 0.302 |
| 3.0064e-05 | 0.306 |
| 3.0096e-05 | 0.302 |
| 3.0128e-05 | 0.302 |
| 3.016e-05 | 0.306 |
| 3.0192e-05 | 0.302 |
| 3.0224e-05 | 0.302 |
| 3.0256e-05 | 0.306 |
| 3.0288e-05 | 0.298 |
| 3.032e-05 | 0.302 |
| 3.0352e-05 | 0.298 |
| 3.0384e-05 | 0.302 |
| 3.0416e-05 | 0.298 |
| 3.0448e-05 | 0.298 |
| 3.048e-05 | 0.298 |
| 3.0512e-05 | 0.298 |
| 3.0544e-05 | 0.298 |
| 3.0576e-05 | 0.298 |
| 3.0608e-05 | 0.294 |
| 3.064e-05 | 0.29 |
| 3.0672e-05 | 0.29 |
| 3.0704e-05 | 0.29 |
| 3.0736e-05 | 0.29 |
| 3.0768e-05 | 0.286 |
| 3.08e-05 | 0.29 |
| 3.0832e-05 | 0.286 |
| 3.0864e-05 | 0.286 |
| 3.0896e-05 | 0.286 |
| 3.0928e-05 | 0.282 |
| 3.096e-05 | 0.282 |
| 3.0992e-05 | 0.286 |
| 3.1024e-05 | 0.282 |
| 3.1056e-05 | 0.278 |
| 3.1088e-05 | 0.278 |
| 3.112e-05 | 0.278 |
| 3.1152e-05 | 0.278 |
| 3.1184e-05 | 0.274 |
| 3.1216e-05 | 0.274 |
| 3.1248e-05 | 0.274 |
| 3.128e-05 | 0.274 |
| 3.1312e-05 | 0.274 |
| 3.1344e-05 | 0.274 |
| 3.1376e-05 | 0.27 |
| 3.1408e-05 | 0.27 |
| 3.144e-05 | 0.27 |
| 3.1472e-05 | 0.266 |
| 3.1504e-05 | 0.27 |
| 3.1536e-05 | 0.266 |
| 3.1568e-05 | 0.27 |
| 3.16e-05 | 0.266 |
| 3.1632e-05 | 0.266 |
| 3.1664e-05 | 0.266 |
| 3.1696e-05 | 0.266 |
| 3.1728e-05 | 0.262 |
| 3.176e-05 | 0.262 |
| 3.1792e-05 | 0.266 |
| 3.1824e-05 | 0.266 |
| 3.1856e-05 | 0.262 |
| 3.1888e-05 | 0.266 |
| 3.192e-05 | 0.266 |
| 3.1952e-05 | 0.266 |
| 3.1984e-05 | 0.266 |
| 3.2016e-05 | 0.27 |
| 3.2048e-05 | 0.27 |
| 3.208e-05 | 0.27 |
| 3.2112e-05 | 0.27 |
| 3.2144e-05 | 0.27 |
| 3.2176e-05 | 0.27 |
| 3.2208e-05 | 0.274 |
| 3.224e-05 | 0.274 |
| 3.2272e-05 | 0.274 |
| 3.2304e-05 | 0.274 |
| 3.2336e-05 | 0.278 |
| 3.2368e-05 | 0.274 |
| 3.24e-05 | 0.278 |
| 3.2432e-05 | 0.278 |
| 3.2464e-05 | 0.278 |
| 3.2496e-05 | 0.278 |
| 3.2528e-05 | 0.278 |
| 3.256e-05 | 0.278 |
| 3.2592e-05 | 0.282 |
| 3.2624e-05 | 0.282 |
| 3.2656e-05 | 0.282 |
| 3.2688e-05 | 0.282 |
| 3.272e-05 | 0.286 |
| 3.2752e-05 | 0.282 |
| 3.2784e-05 | 0.286 |
| 3.2816e-05 | 0.286 |
| 3.2848e-05 | 0.282 |
| 3.288e-05 | 0.286 |
| 3.2912e-05 | 0.286 |
| 3.2944e-05 | 0.286 |
| 3.2976e-05 | 0.286 |
| 3.3008e-05 | 0.286 |
| 3.304e-05 | 0.286 |
| 3.3072e-05 | 0.286 |
| 3.3104e-05 | 0.286 |
| 3.3136e-05 | 0.286 |
| 3.3168e-05 | 0.286 |
| 3.32e-05 | 0.286 |
| 3.3232e-05 | 0.286 |
| 3.3264e-05 | 0.286 |
| 3.3296e-05 | 0.282 |
| 3.3328e-05 | 0.282 |
| 3.336e-05 | 0.286 |
| 3.3392e-05 | 0.282 |
| 3.3424e-05 | 0.282 |
| 3.3456e-05 | 0.282 |
| 3.3488e-05 | 0.282 |
| 3.352e-05 | 0.278 |
| 3.3552e-05 | 0.278 |
| 3.3584e-05 | 0.278 |
| 3.3616e-05 | 0.278 |
| 3.3648e-05 | 0.278 |
| 3.368e-05 | 0.274 |
| 3.3712e-05 | 0.274 |
| 3.3744e-05 | 0.274 |
| 3.3776e-05 | 0.274 |
| 3.3808e-05 | 0.27 |
| 3.384e-05 | 0.274 |
| 3.3872e-05 | 0.27 |
| 3.3904e-05 | 0.27 |
| 3.3936e-05 | 0.266 |
| 3.3968e-05 | 0.266 |
| 3.4e-05 | 0.262 |
| 3.4032e-05 | 0.262 |
| 3.4064e-05 | 0.262 |
| 3.4096e-05 | 0.262 |
| 3.4128e-05 | 0.262 |
| 3.416e-05 | 0.258 |
| 3.4192e-05 | 0.258 |
| 3.4224e-05 | 0.258 |
| 3.4256e-05 | 0.254 |
| 3.4288e-05 | 0.254 |
| 3.432e-05 | 0.254 |
| 3.4352e-05 | 0.254 |
| 3.4384e-05 | 0.25 |
| 3.4416e-05 | 0.25 |
| 3.4448e-05 | 0.25 |
| 3.448e-05 | 0.25 |
| 3.4512e-05 | 0.25 |
| 3.4544e-05 | 0.25 |
| 3.4576e-05 | 0.246 |
| 3.4608e-05 | 0.246 |
| 3.464e-05 | 0.246 |
| 3.4672e-05 | 0.246 |
| 3.4704e-05 | 0.246 |
| 3.4736e-05 | 0.246 |
| 3.4768e-05 | 0.242 |
| 3.48e-05 | 0.246 |
| 3.4832e-05 | 0.246 |
| 3.4864e-05 | 0.246 |
| 3.4896e-05 | 0.246 |
| 3.4928e-05 | 0.246 |
| 3.496e-05 | 0.246 |
| 3.4992e-05 | 0.246 |
| 3.5024e-05 | 0.25 |
| 3.5056e-05 | 0.25 |
| 3.5088e-05 | 0.25 |
| 3.512e-05 | 0.25 |
| 3.5152e-05 | 0.254 |
| 3.5184e-05 | 0.25 |
| 3.5216e-05 | 0.254 |
| 3.5248e-05 | 0.254 |
| 3.528e-05 | 0.254 |
| 3.5312e-05 | 0.258 |
| 3.5344e-05 | 0.258 |
| 3.5376e-05 | 0.258 |
| 3.5408e-05 | 0.258 |
| 3.544e-05 | 0.258 |
| 3.5472e-05 | 0.262 |
| 3.5504e-05 | 0.262 |
| 3.5536e-05 | 0.266 |
| 3.5568e-05 | 0.266 |
| 3.56e-05 | 0.266 |
| 3.5632e-05 | 0.266 |
| 3.5664e-05 | 0.266 |
| 3.5696e-05 | 0.27 |
| 3.5728e-05 | 0.27 |
| 3.576e-05 | 0.27 |
| 3.5792e-05 | 0.27 |
| 3.5824e-05 | 0.27 |
| 3.5856e-05 | 0.27 |
| 3.5888e-05 | 0.27 |
| 3.592e-05 | 0.27 |
| 3.5952e-05 | 0.27 |
| 3.5984e-05 | 0.274 |
| 3.6016e-05 | 0.274 |
| 3.6048e-05 | 0.274 |
| 3.608e-05 | 0.27 |
| 3.6112e-05 | 0.274 |
| 3.6144e-05 | 0.278 |
| 3.6176e-05 | 0.274 |
| 3.6208e-05 | 0.278 |
| 3.624e-05 | 0.278 |
| 3.6272e-05 | 0.278 |
| 3.6304e-05 | 0.274 |
| 3.6336e-05 | 0.278 |
| 3.6368e-05 | 0.278 |
| 3.64e-05 | 0.278 |
| 3.6432e-05 | 0.278 |
| 3.6464e-05 | 0.278 |
| 3.6496e-05 | 0.278 |
| 3.6528e-05 | 0.278 |
| 3.656e-05 | 0.278 |
| 3.6592e-05 | 0.278 |
| 3.6624e-05 | 0.278 |
| 3.6656e-05 | 0.278 |
| 3.6688e-05 | 0.278 |
| 3.672e-05 | 0.274 |
| 3.6752e-05 | 0.278 |
| 3.6784e-05 | 0.274 |
| 3.6816e-05 | 0.274 |
| 3.6848e-05 | 0.274 |
| 3.688e-05 | 0.274 |
| 3.6912e-05 | 0.27 |
| 3.6944e-05 | 0.27 |
| 3.6976e-05 | 0.266 |
| 3.7008e-05 | 0.266 |
| 3.704e-05 | 0.266 |
| 3.7072e-05 | 0.266 |
| 3.7104e-05 | 0.266 |
| 3.7136e-05 | 0.262 |
| 3.7168e-05 | 0.258 |
| 3.72e-05 | 0.262 |
| 3.7232e-05 | 0.258 |
| 3.7264e-05 | 0.258 |
| 3.7296e-05 | 0.254 |
| 3.7328e-05 | 0.254 |
| 3.736e-05 | 0.254 |
| 3.7392e-05 | 0.25 |
| 3.7424e-05 | 0.25 |
| 3.7456e-05 | 0.25 |
| 3.7488e-05 | 0.246 |
| 3.752e-05 | 0.246 |
| 3.7552e-05 | 0.246 |
| 3.7584e-05 | 0.246 |
| 3.7616e-05 | 0.246 |
| 3.7648e-05 | 0.246 |
| 3.768e-05 | 0.246 |
| 3.7712e-05 | 0.242 |
| 3.7744e-05 | 0.242 |
| 3.7776e-05 | 0.242 |
| 3.7808e-05 | 0.242 |
| 3.784e-05 | 0.242 |
| 3.7872e-05 | 0.238 |
| 3.7904e-05 | 0.238 |
| 3.7936e-05 | 0.242 |
| 3.7968e-05 | 0.242 |
| 3.8e-05 | 0.242 |
| 3.8032e-05 | 0.242 |
| 3.8064e-05 | 0.242 |
| 3.8096e-05 | 0.242 |
| 3.8128e-05 | 0.238 |
| 3.816e-05 | 0.242 |
| 3.8192e-05 | 0.242 |
| 3.8224e-05 | 0.242 |
| 3.8256e-05 | 0.242 |
| 3.8288e-05 | 0.242 |
| 3.832e-05 | 0.242 |
| 3.8352e-05 | 0.242 |
| 3.8384e-05 | 0.242 |
| 3.8416e-05 | 0.242 |
| 3.8448e-05 | 0.242 |
| 3.848e-05 | 0.242 |
| 3.8512e-05 | 0.246 |
| 3.8544e-05 | 0.246 |
| 3.8576e-05 | 0.246 |
| 3.8608e-05 | 0.246 |
| 3.864e-05 | 0.242 |
| 3.8672e-05 | 0.246 |
| 3.8704e-05 | 0.246 |
| 3.8736e-05 | 0.246 |
| 3.8768e-05 | 0.246 |
| 3.88e-05 | 0.246 |
| 3.8832e-05 | 0.25 |
| 3.8864e-05 | 0.25 |
| 3.8896e-05 | 0.25 |
| 3.8928e-05 | 0.25 |
| 3.896e-05 | 0.25 |
| 3.8992e-05 | 0.254 |
| 3.9024e-05 | 0.254 |
| 3.9056e-05 | 0.254 |
| 3.9088e-05 | 0.258 |
| 3.912e-05 | 0.254 |
| 3.9152e-05 | 0.258 |
| 3.9184e-05 | 0.258 |
| 3.9216e-05 | 0.258 |
| 3.9248e-05 | 0.258 |
| 3.928e-05 | 0.258 |
| 3.9312e-05 | 0.262 |
| 3.9344e-05 | 0.262 |
| 3.9376e-05 | 0.262 |
| 3.9408e-05 | 0.262 |
| 3.944e-05 | 0.262 |
| 3.9472e-05 | 0.262 |
| 3.9504e-05 | 0.262 |
| 3.9536e-05 | 0.262 |
| 3.9568e-05 | 0.262 |
| 3.96e-05 | 0.266 |
| 3.9632e-05 | 0.262 |
| 3.9664e-05 | 0.262 |
| 3.9696e-05 | 0.258 |
| 3.9728e-05 | 0.262 |
| 3.976e-05 | 0.262 |
| 3.9792e-05 | 0.262 |
| 3.9824e-05 | 0.262 |
| 3.9856e-05 | 0.262 |
| 3.9888e-05 | 0.262 |
| 3.992e-05 | 0.258 |
| 3.9952e-05 | 0.258 |
| 3.9984e-05 | 0.258 |
| 4.0016e-05 | 0.258 |
| 4.0048e-05 | 0.258 |
| 4.008e-05 | 0.258 |
| 4.0112e-05 | 0.258 |
| 4.0144e-05 | 0.258 |
| 4.0176e-05 | 0.258 |
| 4.0208e-05 | 0.258 |
| 4.024e-05 | 0.258 |
| 4.0272e-05 | 0.258 |
| 4.0304e-05 | 0.254 |
| 4.0336e-05 | 0.254 |
| 4.0368e-05 | 0.254 |
| 4.04e-05 | 0.254 |
| 4.0432e-05 | 0.254 |
| 4.0464e-05 | 0.254 |
| 4.0496e-05 | 0.25 |
| 4.0528e-05 | 0.25 |
| 4.056e-05 | 0.25 |
| 4.0592e-05 | 0.25 |
| 4.0624e-05 | 0.25 |
| 4.0656e-05 | 0.25 |
| 4.0688e-05 | 0.25 |
| 4.072e-05 | 0.25 |
| 4.0752e-05 | 0.25 |
| 4.0784e-05 | 0.25 |
| 4.0816e-05 | 0.246 |
| 4.0848e-05 | 0.246 |
| 4.088e-05 | 0.246 |
| 4.0912e-05 | 0.25 |
| 4.0944e-05 | 0.246 |
| 4.0976e-05 | 0.246 |
| 4.1008e-05 | 0.246 |
| 4.104e-05 | 0.246 |
| 4.1072e-05 | 0.246 |
| 4.1104e-05 | 0.246 |
| 4.1136e-05 | 0.246 |
| 4.1168e-05 | 0.246 |
| 4.12e-05 | 0.242 |
| 4.1232e-05 | 0.246 |
| 4.1264e-05 | 0.246 |
| 4.1296e-05 | 0.246 |
| 4.1328e-05 | 0.242 |
| 4.136e-05 | 0.246 |
| 4.1392e-05 | 0.242 |
| 4.1424e-05 | 0.242 |
| 4.1456e-05 | 0.242 |
| 4.1488e-05 | 0.246 |
| 4.152e-05 | 0.242 |
| 4.1552e-05 | 0.242 |
| 4.1584e-05 | 0.242 |
| 4.1616e-05 | 0.246 |
| 4.1648e-05 | 0.242 |
| 4.168e-05 | 0.246 |
| 4.1712e-05 | 0.246 |
| 4.1744e-05 | 0.246 |
| 4.1776e-05 | 0.246 |
| 4.1808e-05 | 0.242 |
| 4.184e-05 | 0.246 |
| 4.1872e-05 | 0.246 |
| 4.1904e-05 | 0.25 |
| 4.1936e-05 | 0.246 |
| 4.1968e-05 | 0.246 |
| 4.2e-05 | 0.246 |
| 4.2032e-05 | 0.25 |
| 4.2064e-05 | 0.25 |
| 4.2096e-05 | 0.25 |
| 4.2128e-05 | 0.25 |
| 4.216e-05 | 0.25 |
| 4.2192e-05 | 0.254 |
| 4.2224e-05 | 0.254 |
| 4.2256e-05 | 0.254 |
| 4.2288e-05 | 0.254 |
| 4.232e-05 | 0.254 |
| 4.2352e-05 | 0.254 |
| 4.2384e-05 | 0.254 |
| 4.2416e-05 | 0.254 |
| 4.2448e-05 | 0.254 |
| 4.248e-05 | 0.254 |
| 4.2512e-05 | 0.254 |
| 4.2544e-05 | 0.254 |
| 4.2576e-05 | 0.254 |
| 4.2608e-05 | 0.25 |
| 4.264e-05 | 0.254 |
| 4.2672e-05 | 0.25 |
| 4.2704e-05 | 0.254 |
| 4.2736e-05 | 0.254 |
| 4.2768e-05 | 0.254 |
| 4.28e-05 | 0.25 |
| 4.2832e-05 | 0.254 |
| 4.2864e-05 | 0.25 |
| 4.2896e-05 | 0.25 |
| 4.2928e-05 | 0.25 |
| 4.296e-05 | 0.25 |
| 4.2992e-05 | 0.25 |
| 4.3024e-05 | 0.25 |
| 4.3056e-05 | 0.25 |
| 4.3088e-05 | 0.25 |
| 4.312e-05 | 0.25 |
| 4.3152e-05 | 0.25 |
| 4.3184e-05 | 0.246 |
| 4.3216e-05 | 0.25 |
| 4.3248e-05 | 0.25 |
| 4.328e-05 | 0.25 |
| 4.3312e-05 | 0.25 |
| 4.3344e-05 | 0.25 |
| 4.3376e-05 | 0.25 |
| 4.3408e-05 | 0.25 |
| 4.344e-05 | 0.25 |
| 4.3472e-05 | 0.246 |
| 4.3504e-05 | 0.246 |
| 4.3536e-05 | 0.246 |
| 4.3568e-05 | 0.246 |
| 4.36e-05 | 0.25 |
| 4.3632e-05 | 0.246 |
| 4.3664e-05 | 0.246 |
| 4.3696e-05 | 0.246 |
| 4.3728e-05 | 0.246 |
| 4.376e-05 | 0.246 |
| 4.3792e-05 | 0.246 |
| 4.3824e-05 | 0.246 |
| 4.3856e-05 | 0.246 |
| 4.3888e-05 | 0.246 |
| 4.392e-05 | 0.246 |
| 4.3952e-05 | 0.246 |
| 4.3984e-05 | 0.246 |
| 4.4016e-05 | 0.246 |
| 4.4048e-05 | 0.246 |
| 4.408e-05 | 0.246 |
| 4.4112e-05 | 0.246 |
| 4.4144e-05 | 0.246 |
| 4.4176e-05 | 0.246 |
| 4.4208e-05 | 0.246 |
| 4.424e-05 | 0.242 |
| 4.4272e-05 | 0.246 |
| 4.4304e-05 | 0.246 |
| 4.4336e-05 | 0.246 |
| 4.4368e-05 | 0.246 |
| 4.44e-05 | 0.246 |
| 4.4432e-05 | 0.246 |
| 4.4464e-05 | 0.246 |
| 4.4496e-05 | 0.246 |
| 4.4528e-05 | 0.246 |
| 4.456e-05 | 0.246 |
| 4.4592e-05 | 0.246 |
| 4.4624e-05 | 0.246 |
| 4.4656e-05 | 0.25 |
| 4.4688e-05 | 0.25 |
| 4.472e-05 | 0.25 |
| 4.4752e-05 | 0.25 |
| 4.4784e-05 | 0.25 |
| 4.4816e-05 | 0.25 |
| 4.4848e-05 | 0.25 |
| 4.488e-05 | 0.25 |
| 4.4912e-05 | 0.25 |
| 4.4944e-05 | 0.254 |
| 4.4976e-05 | 0.254 |
| 4.5008e-05 | 0.254 |
| 4.504e-05 | 0.254 |
| 4.5072e-05 | 0.254 |
| 4.5104e-05 | 0.258 |
| 4.5136e-05 | 0.254 |
| 4.5168e-05 | 0.254 |
| 4.52e-05 | 0.254 |
| 4.5232e-05 | 0.258 |
| 4.5264e-05 | 0.258 |
| 4.5296e-05 | 0.258 |
| 4.5328e-05 | 0.254 |
| 4.536e-05 | 0.258 |
| 4.5392e-05 | 0.258 |
| 4.5424e-05 | 0.258 |
| 4.5456e-05 | 0.258 |
| 4.5488e-05 | 0.258 |
| 4.552e-05 | 0.258 |
| 4.5552e-05 | 0.258 |
| 4.5584e-05 | 0.258 |
| 4.5616e-05 | 0.258 |
| 4.5648e-05 | 0.258 |
| 4.568e-05 | 0.258 |
| 4.5712e-05 | 0.258 |
| 4.5744e-05 | 0.258 |
| 4.5776e-05 | 0.258 |
| 4.5808e-05 | 0.258 |
| 4.584e-05 | 0.258 |
| 4.5872e-05 | 0.254 |
| 4.5904e-05 | 0.254 |
| 4.5936e-05 | 0.258 |
| 4.5968e-05 | 0.254 |
| 4.6e-05 | 0.258 |
| 4.6032e-05 | 0.258 |
| 4.6064e-05 | 0.254 |
| 4.6096e-05 | 0.254 |
| 4.6128e-05 | 0.254 |
| 4.616e-05 | 0.254 |
| 4.6192e-05 | 0.254 |
| 4.6224e-05 | 0.254 |
| 4.6256e-05 | 0.254 |
| 4.6288e-05 | 0.254 |
| 4.632e-05 | 0.254 |
| 4.6352e-05 | 0.254 |
| 4.6384e-05 | 0.254 |
| 4.6416e-05 | 0.254 |
| 4.6448e-05 | 0.25 |
| 4.648e-05 | 0.25 |
| 4.6512e-05 | 0.25 |
| 4.6544e-05 | 0.25 |
| 4.6576e-05 | 0.25 |
| 4.6608e-05 | 0.25 |
| 4.664e-05 | 0.25 |
| 4.6672e-05 | 0.25 |
| 4.6704e-05 | 0.25 |
| 4.6736e-05 | 0.246 |
| 4.6768e-05 | 0.25 |
| 4.68e-05 | 0.25 |
| 4.6832e-05 | 0.246 |
| 4.6864e-05 | 0.246 |
| 4.6896e-05 | 0.246 |
| 4.6928e-05 | 0.25 |
| 4.696e-05 | 0.25 |
| 4.6992e-05 | 0.246 |
| 4.7024e-05 | 0.246 |
| 4.7056e-05 | 0.25 |
| 4.7088e-05 | 0.25 |
| 4.712e-05 | 0.25 |
| 4.7152e-05 | 0.246 |
| 4.7184e-05 | 0.25 |
| 4.7216e-05 | 0.25 |
| 4.7248e-05 | 0.25 |
| 4.728e-05 | 0.25 |
| 4.7312e-05 | 0.25 |
| 4.7344e-05 | 0.25 |
| 4.7376e-05 | 0.25 |
| 4.7408e-05 | 0.25 |
| 4.744e-05 | 0.25 |
| 4.7472e-05 | 0.25 |
| 4.7504e-05 | 0.25 |
| 4.7536e-05 | 0.25 |
| 4.7568e-05 | 0.25 |
| 4.76e-05 | 0.254 |
| 4.7632e-05 | 0.254 |
| 4.7664e-05 | 0.25 |
| 4.7696e-05 | 0.254 |
| 4.7728e-05 | 0.25 |
| 4.776e-05 | 0.254 |
| 4.7792e-05 | 0.254 |
| 4.7824e-05 | 0.254 |
| 4.7856e-05 | 0.254 |
| 4.7888e-05 | 0.254 |
| 4.792e-05 | 0.254 |
| 4.7952e-05 | 0.258 |
| 4.7984e-05 | 0.258 |
| 4.8016e-05 | 0.258 |
| 4.8048e-05 | 0.258 |
| 4.808e-05 | 0.258 |
| 4.8112e-05 | 0.258 |
| 4.8144e-05 | 0.258 |
| 4.8176e-05 | 0.258 |
| 4.8208e-05 | 0.262 |
| 4.824e-05 | 0.262 |
| 4.8272e-05 | 0.266 |
| 4.8304e-05 | 0.262 |
| 4.8336e-05 | 0.262 |
| 4.8368e-05 | 0.262 |
| 4.84e-05 | 0.266 |
| 4.8432e-05 | 0.266 |
| 4.8464e-05 | 0.266 |
| 4.8496e-05 | 0.262 |
| 4.8528e-05 | 0.266 |
| 4.856e-05 | 0.266 |
| 4.8592e-05 | 0.266 |
| 4.8624e-05 | 0.266 |
| 4.8656e-05 | 0.266 |
| 4.8688e-05 | 0.266 |
| 4.872e-05 | 0.266 |
| 4.8752e-05 | 0.266 |
| 4.8784e-05 | 0.266 |
| 4.8816e-05 | 0.266 |
| 4.8848e-05 | 0.266 |
| 4.888e-05 | 0.266 |
| 4.8912e-05 | 0.266 |
| 4.8944e-05 | 0.27 |
| 4.8976e-05 | 0.266 |
| 4.9008e-05 | 0.266 |
| 4.904e-05 | 0.266 |
| 4.9072e-05 | 0.266 |
| 4.9104e-05 | 0.266 |
| 4.9136e-05 | 0.266 |
| 4.9168e-05 | 0.266 |
| 4.92e-05 | 0.266 |
| 4.9232e-05 | 0.266 |
| 4.9264e-05 | 0.266 |
| 4.9296e-05 | 0.266 |
| 4.9328e-05 | 0.262 |
| 4.936e-05 | 0.266 |
| 4.9392e-05 | 0.262 |
| 4.9424e-05 | 0.262 |
| 4.9456e-05 | 0.258 |
| 4.9488e-05 | 0.262 |
| 4.952e-05 | 0.262 |
| 4.9552e-05 | 0.262 |
| 4.9584e-05 | 0.262 |
| 4.9616e-05 | 0.258 |
| 4.9648e-05 | 0.258 |
| 4.968e-05 | 0.258 |
| 4.9712e-05 | 0.258 |
| 4.9744e-05 | 0.258 |
| 4.9776e-05 | 0.258 |
| 4.9808e-05 | 0.258 |
| 4.984e-05 | 0.258 |
| 4.9872e-05 | 0.258 |
| 4.9904e-05 | 0.258 |
| 4.9936e-05 | 0.258 |
| 4.9968e-05 | 0.258 |
| 5e-05 | 0.254 |
| 5.0032e-05 | 0.254 |
| 5.0064e-05 | 0.254 |
| 5.0096e-05 | 0.258 |
| 5.0128e-05 | 0.254 |
| 5.016e-05 | 0.254 |
| 5.0192e-05 | 0.254 |
| 5.0224e-05 | 0.254 |
| 5.0256e-05 | 0.254 |
| 5.0288e-05 | 0.254 |
| 5.032e-05 | 0.25 |
| 5.0352e-05 | 0.25 |
| 5.0384e-05 | 0.25 |
| 5.0416e-05 | 0.25 |
| 5.0448e-05 | 0.25 |
| 5.048e-05 | 0.25 |
| 5.0512e-05 | 0.25 |
| 5.0544e-05 | 0.25 |
| 5.0576e-05 | 0.246 |
| 5.0608e-05 | 0.25 |
| 5.064e-05 | 0.25 |
| 5.0672e-05 | 0.246 |
| 5.0704e-05 | 0.246 |
| 5.0736e-05 | 0.246 |
| 5.0768e-05 | 0.246 |
| 5.08e-05 | 0.246 |
| 5.0832e-05 | 0.246 |
| 5.0864e-05 | 0.246 |
| 5.0896e-05 | 0.246 |
| 5.0928e-05 | 0.246 |
| 5.096e-05 | 0.246 |
| 5.0992e-05 | 0.246 |
| 5.1024e-05 | 0.25 |
| 5.1056e-05 | 0.25 |
| 5.1088e-05 | 0.25 |
| 5.112e-05 | 0.246 |
| 5.1152e-05 | 0.25 |
| 5.1184e-05 | 0.246 |
| 5.1216e-05 | 0.25 |
| 5.1248e-05 | 0.25 |
| 5.128e-05 | 0.25 |
| 5.1312e-05 | 0.25 |
| 5.1344e-05 | 0.25 |
| 5.1376e-05 | 0.25 |
| 5.1408e-05 | 0.25 |
| 5.144e-05 | 0.25 |
| 5.1472e-05 | 0.254 |
| 5.1504e-05 | 0.25 |
| 5.1536e-05 | 0.254 |
| 5.1568e-05 | 0.254 |
| 5.16e-05 | 0.254 |
| 5.1632e-05 | 0.254 |
| 5.1664e-05 | 0.254 |
| 5.1696e-05 | 0.258 |
| 5.1728e-05 | 0.254 |
| 5.176e-05 | 0.254 |
| 5.1792e-05 | 0.258 |
| 5.1824e-05 | 0.254 |
| 5.1856e-05 | 0.254 |
| 5.1888e-05 | 0.258 |
| 5.192e-05 | 0.258 |
| 5.1952e-05 | 0.258 |
| 5.1984e-05 | 0.258 |
| 5.2016e-05 | 0.258 |
| 5.2048e-05 | 0.258 |
| 5.208e-05 | 0.258 |
| 5.2112e-05 | 0.258 |
| 5.2144e-05 | 0.258 |
| 5.2176e-05 | 0.254 |
| 5.2208e-05 | 0.258 |
| 5.224e-05 | 0.258 |
| 5.2272e-05 | 0.254 |
| 5.2304e-05 | 0.258 |
| 5.2336e-05 | 0.254 |
| 5.2368e-05 | 0.254 |
| 5.24e-05 | 0.254 |
| 5.2432e-05 | 0.254 |
| 5.2464e-05 | 0.254 |
| 5.2496e-05 | 0.254 |
| 5.2528e-05 | 0.254 |
| 5.256e-05 | 0.254 |
| 5.2592e-05 | 0.254 |
| 5.2624e-05 | 0.258 |
| 5.2656e-05 | 0.254 |
| 5.2688e-05 | 0.254 |
| 5.272e-05 | 0.254 |
| 5.2752e-05 | 0.254 |
| 5.2784e-05 | 0.254 |
| 5.2816e-05 | 0.254 |
| 5.2848e-05 | 0.254 |
| 5.288e-05 | 0.254 |
| 5.2912e-05 | 0.254 |
| 5.2944e-05 | 0.254 |
| 5.2976e-05 | 0.254 |
| 5.3008e-05 | 0.254 |
| 5.304e-05 | 0.254 |
| 5.3072e-05 | 0.25 |
| 5.3104e-05 | 0.25 |
| 5.3136e-05 | 0.254 |
| 5.3168e-05 | 0.25 |
| 5.32e-05 | 0.254 |
| 5.3232e-05 | 0.25 |
| 5.3264e-05 | 0.25 |
| 5.3296e-05 | 0.25 |
| 5.3328e-05 | 0.246 |
| 5.336e-05 | 0.25 |
| 5.3392e-05 | 0.25 |
| 5.3424e-05 | 0.25 |
| 5.3456e-05 | 0.246 |
| 5.3488e-05 | 0.25 |
| 5.352e-05 | 0.25 |
| 5.3552e-05 | 0.25 |
| 5.3584e-05 | 0.246 |
| 5.3616e-05 | 0.246 |
| 5.3648e-05 | 0.246 |
| 5.368e-05 | 0.246 |
| 5.3712e-05 | 0.246 |
| 5.3744e-05 | 0.246 |
| 5.3776e-05 | 0.246 |
| 5.3808e-05 | 0.246 |
| 5.384e-05 | 0.246 |
| 5.3872e-05 | 0.246 |
| 5.3904e-05 | 0.246 |
| 5.3936e-05 | 0.246 |
| 5.3968e-05 | 0.246 |
| 5.4e-05 | 0.246 |
| 5.4032e-05 | 0.246 |
| 5.4064e-05 | 0.242 |
| 5.4096e-05 | 0.242 |
| 5.4128e-05 | 0.242 |
| 5.416e-05 | 0.246 |
| 5.4192e-05 | 0.242 |
| 5.4224e-05 | 0.242 |
| 5.4256e-05 | 0.246 |
| 5.4288e-05 | 0.242 |
| 5.432e-05 | 0.242 |
| 5.4352e-05 | 0.246 |
| 5.4384e-05 | 0.246 |
| 5.4416e-05 | 0.246 |
| 5.4448e-05 | 0.246 |
| 5.448e-05 | 0.246 |
| 5.4512e-05 | 0.246 |
| 5.4544e-05 | 0.246 |
| 5.4576e-05 | 0.246 |
| 5.4608e-05 | 0.246 |
| 5.464e-05 | 0.25 |
| 5.4672e-05 | 0.246 |
| 5.4704e-05 | 0.246 |
| 5.4736e-05 | 0.25 |
| 5.4768e-05 | 0.25 |
| 5.48e-05 | 0.25 |
| 5.4832e-05 | 0.25 |
| 5.4864e-05 | 0.25 |
| 5.4896e-05 | 0.254 |
| 5.4928e-05 | 0.25 |
| 5.496e-05 | 0.25 |
| 5.4992e-05 | 0.25 |
| 5.5024e-05 | 0.25 |
| 5.5056e-05 | 0.254 |
| 5.5088e-05 | 0.254 |
| 5.512e-05 | 0.25 |
| 5.5152e-05 | 0.254 |
| 5.5184e-05 | 0.25 |
| 5.5216e-05 | 0.25 |
| 5.5248e-05 | 0.25 |
| 5.528e-05 | 0.25 |
| 5.5312e-05 | 0.254 |
| 5.5344e-05 | 0.25 |
| 5.5376e-05 | 0.254 |
| 5.5408e-05 | 0.254 |
| 5.544e-05 | 0.254 |
| 5.5472e-05 | 0.254 |
| 5.5504e-05 | 0.254 |
| 5.5536e-05 | 0.254 |
| 5.5568e-05 | 0.254 |
| 5.56e-05 | 0.254 |
| 5.5632e-05 | 0.254 |
| 5.5664e-05 | 0.254 |
| 5.5696e-05 | 0.254 |
| 5.5728e-05 | 0.254 |
| 5.576e-05 | 0.254 |
| 5.5792e-05 | 0.254 |
| 5.5824e-05 | 0.254 |
| 5.5856e-05 | 0.258 |
| 5.5888e-05 | 0.258 |
| 5.592e-05 | 0.258 |
| 5.5952e-05 | 0.258 |
| 5.5984e-05 | 0.258 |
| 5.6016e-05 | 0.258 |
| 5.6048e-05 | 0.258 |
| 5.608e-05 | 0.254 |
| 5.6112e-05 | 0.258 |
| 5.6144e-05 | 0.258 |
| 5.6176e-05 | 0.254 |
| 5.6208e-05 | 0.258 |
| 5.624e-05 | 0.254 |
| 5.6272e-05 | 0.258 |
| 5.6304e-05 | 0.258 |
| 5.6336e-05 | 0.258 |
| 5.6368e-05 | 0.254 |
| 5.64e-05 | 0.254 |
| 5.6432e-05 | 0.254 |
| 5.6464e-05 | 0.254 |
| 5.6496e-05 | 0.254 |
| 5.6528e-05 | 0.254 |
| 5.656e-05 | 0.254 |
| 5.6592e-05 | 0.254 |
| 5.6624e-05 | 0.254 |
| 5.6656e-05 | 0.254 |
| 5.6688e-05 | 0.254 |
| 5.672e-05 | 0.254 |
| 5.6752e-05 | 0.254 |
| 5.6784e-05 | 0.254 |
| 5.6816e-05 | 0.254 |
| 5.6848e-05 | 0.254 |
| 5.688e-05 | 0.25 |
| 5.6912e-05 | 0.254 |
| 5.6944e-05 | 0.25 |
| 5.6976e-05 | 0.254 |
| 5.7008e-05 | 0.254 |
| 5.704e-05 | 0.254 |
| 5.7072e-05 | 0.254 |
| 5.7104e-05 | 0.25 |
| 5.7136e-05 | 0.254 |
| 5.7168e-05 | 0.254 |
| 5.72e-05 | 0.254 |
| 5.7232e-05 | 0.258 |
| 5.7264e-05 | 0.258 |
| 5.7296e-05 | 0.258 |
| 5.7328e-05 | 0.258 |
| 5.736e-05 | 0.258 |
| 5.7392e-05 | 0.258 |
| 5.7424e-05 | 0.258 |
| 5.7456e-05 | 0.258 |
| 5.7488e-05 | 0.258 |
| 5.752e-05 | 0.258 |
| 5.7552e-05 | 0.258 |
| 5.7584e-05 | 0.262 |
| 5.7616e-05 | 0.262 |
| 5.7648e-05 | 0.262 |
| 5.768e-05 | 0.262 |
| 5.7712e-05 | 0.262 |
| 5.7744e-05 | 0.262 |
| 5.7776e-05 | 0.262 |
| 5.7808e-05 | 0.266 |
| 5.784e-05 | 0.262 |
| 5.7872e-05 | 0.262 |
| 5.7904e-05 | 0.266 |
| 5.7936e-05 | 0.266 |
| 5.7968e-05 | 0.266 |
| 5.8e-05 | 0.266 |
| 5.8032e-05 | 0.266 |
| 5.8064e-05 | 0.266 |
| 5.8096e-05 | 0.266 |
| 5.8128e-05 | 0.266 |
| 5.816e-05 | 0.266 |
| 5.8192e-05 | 0.266 |
| 5.8224e-05 | 0.266 |
| 5.8256e-05 | 0.266 |
| 5.8288e-05 | 0.266 |
| 5.832e-05 | 0.266 |
| 5.8352e-05 | 0.266 |
| 5.8384e-05 | 0.266 |
| 5.8416e-05 | 0.266 |
| 5.8448e-05 | 0.266 |
| 5.848e-05 | 0.266 |
| 5.8512e-05 | 0.266 |
| 5.8544e-05 | 0.266 |
| 5.8576e-05 | 0.266 |
| 5.8608e-05 | 0.266 |
| 5.864e-05 | 0.266 |
| 5.8672e-05 | 0.266 |
| 5.8704e-05 | 0.266 |
| 5.8736e-05 | 0.266 |
| 5.8768e-05 | 0.266 |
| 5.88e-05 | 0.266 |
| 5.8832e-05 | 0.266 |
| 5.8864e-05 | 0.262 |
| 5.8896e-05 | 0.266 |
| 5.8928e-05 | 0.262 |
| 5.896e-05 | 0.262 |
| 5.8992e-05 | 0.262 |
| 5.9024e-05 | 0.262 |
| 5.9056e-05 | 0.258 |
| 5.9088e-05 | 0.262 |
| 5.912e-05 | 0.258 |
| 5.9152e-05 | 0.258 |
| 5.9184e-05 | 0.258 |
| 5.9216e-05 | 0.258 |
| 5.9248e-05 | 0.258 |
| 5.928e-05 | 0.258 |
| 5.9312e-05 | 0.254 |
| 5.9344e-05 | 0.254 |
| 5.9376e-05 | 0.254 |
| 5.9408e-05 | 0.254 |
| 5.944e-05 | 0.254 |
| 5.9472e-05 | 0.254 |
| 5.9504e-05 | 0.254 |
| 5.9536e-05 | 0.25 |
| 5.9568e-05 | 0.25 |
| 5.96e-05 | 0.25 |
| 5.9632e-05 | 0.25 |
| 5.9664e-05 | 0.25 |
| 5.9696e-05 | 0.25 |
| 5.9728e-05 | 0.246 |
| 5.976e-05 | 0.246 |
| 5.9792e-05 | 0.246 |
| 5.9824e-05 | 0.246 |
| 5.9856e-05 | 0.246 |
| 5.9888e-05 | 0.246 |
| 5.992e-05 | 0.25 |
| 5.9952e-05 | 0.25 |
| 5.9984e-05 | 0.246 |
| 6.0016e-05 | 0.246 |
| 6.0048e-05 | 0.246 |
| 6.008e-05 | 0.246 |
| 6.0112e-05 | 0.246 |
| 6.0144e-05 | 0.246 |
| 6.0176e-05 | 0.246 |
| 6.0208e-05 | 0.246 |
| 6.024e-05 | 0.246 |
| 6.0272e-05 | 0.25 |
| 6.0304e-05 | 0.25 |
| 6.0336e-05 | 0.25 |
| 6.0368e-05 | 0.25 |
| 6.04e-05 | 0.25 |
| 6.0432e-05 | 0.25 |
| 6.0464e-05 | 0.25 |
| 6.0496e-05 | 0.25 |
| 6.0528e-05 | 0.25 |
| 6.056e-05 | 0.25 |
| 6.0592e-05 | 0.25 |
| 6.0624e-05 | 0.25 |
| 6.0656e-05 | 0.25 |
| 6.0688e-05 | 0.254 |
| 6.072e-05 | 0.254 |
| 6.0752e-05 | 0.254 |
| 6.0784e-05 | 0.258 |
| 6.0816e-05 | 0.254 |
| 6.0848e-05 | 0.258 |
| 6.088e-05 | 0.258 |
| 6.0912e-05 | 0.258 |
| 6.0944e-05 | 0.254 |
| 6.0976e-05 | 0.258 |
| 6.1008e-05 | 0.258 |
| 6.104e-05 | 0.258 |
| 6.1072e-05 | 0.258 |
| 6.1104e-05 | 0.258 |
| 6.1136e-05 | 0.262 |
| 6.1168e-05 | 0.262 |
| 6.12e-05 | 0.262 |
| 6.1232e-05 | 0.266 |
| 6.1264e-05 | 0.266 |
| 6.1296e-05 | 0.262 |
| 6.1328e-05 | 0.266 |
| 6.136e-05 | 0.266 |
| 6.1392e-05 | 0.266 |
| 6.1424e-05 | 0.266 |
| 6.1456e-05 | 0.266 |
| 6.1488e-05 | 0.266 |
| 6.152e-05 | 0.27 |
| 6.1552e-05 | 0.266 |
| 6.1584e-05 | 0.274 |
| 6.1616e-05 | 0.27 |
| 6.1648e-05 | 0.27 |
| 6.168e-05 | 0.274 |
| 6.1712e-05 | 0.27 |
| 6.1744e-05 | 0.27 |
| 6.1776e-05 | 0.274 |
| 6.1808e-05 | 0.274 |
| 6.184e-05 | 0.274 |
| 6.1872e-05 | 0.274 |
| 6.1904e-05 | 0.274 |
| 6.1936e-05 | 0.274 |
| 6.1968e-05 | 0.274 |
| 6.2e-05 | 0.274 |
| 6.2032e-05 | 0.274 |
| 6.2064e-05 | 0.274 |
| 6.2096e-05 | 0.27 |
| 6.2128e-05 | 0.274 |
| 6.216e-05 | 0.27 |
| 6.2192e-05 | 0.27 |
| 6.2224e-05 | 0.27 |
| 6.2256e-05 | 0.27 |
| 6.2288e-05 | 0.266 |
| 6.232e-05 | 0.266 |
| 6.2352e-05 | 0.27 |
| 6.2384e-05 | 0.266 |
| 6.2416e-05 | 0.266 |
| 6.2448e-05 | 0.266 |
| 6.248e-05 | 0.266 |
| 6.2512e-05 | 0.266 |
| 6.2544e-05 | 0.266 |
| 6.2576e-05 | 0.262 |
| 6.2608e-05 | 0.266 |
| 6.264e-05 | 0.262 |
| 6.2672e-05 | 0.262 |
| 6.2704e-05 | 0.262 |
| 6.2736e-05 | 0.262 |
| 6.2768e-05 | 0.258 |
| 6.28e-05 | 0.258 |
| 6.2832e-05 | 0.258 |
| 6.2864e-05 | 0.258 |
| 6.2896e-05 | 0.258 |
| 6.2928e-05 | 0.258 |
| 6.296e-05 | 0.258 |
| 6.2992e-05 | 0.258 |
| 6.3024e-05 | 0.254 |
| 6.3056e-05 | 0.254 |
| 6.3088e-05 | 0.254 |
| 6.312e-05 | 0.254 |
| 6.3152e-05 | 0.254 |
| 6.3184e-05 | 0.254 |
| 6.3216e-05 | 0.254 |
| 6.3248e-05 | 0.25 |
| 6.328e-05 | 0.25 |
| 6.3312e-05 | 0.25 |
| 6.3344e-05 | 0.25 |
| 6.3376e-05 | 0.25 |
| 6.3408e-05 | 0.246 |
| 6.344e-05 | 0.246 |
| 6.3472e-05 | 0.246 |
| 6.3504e-05 | 0.25 |
| 6.3536e-05 | 0.246 |
| 6.3568e-05 | 0.246 |
| 6.36e-05 | 0.246 |
| 6.3632e-05 | 0.246 |
| 6.3664e-05 | 0.246 |
| 6.3696e-05 | 0.246 |
| 6.3728e-05 | 0.246 |
| 6.376e-05 | 0.246 |
| 6.3792e-05 | 0.246 |
| 6.3824e-05 | 0.25 |
| 6.3856e-05 | 0.246 |
| 6.3888e-05 | 0.25 |
| 6.392e-05 | 0.246 |
| 6.3952e-05 | 0.246 |
| 6.3984e-05 | 0.25 |
| 6.4016e-05 | 0.25 |
| 6.4048e-05 | 0.25 |
| 6.408e-05 | 0.25 |
| 6.4112e-05 | 0.25 |
| 6.4144e-05 | 0.25 |
| 6.4176e-05 | 0.25 |
| 6.4208e-05 | 0.254 |
| 6.424e-05 | 0.25 |
| 6.4272e-05 | 0.254 |
| 6.4304e-05 | 0.25 |
| 6.4336e-05 | 0.254 |
| 6.4368e-05 | 0.254 |
| 6.44e-05 | 0.254 |
| 6.4432e-05 | 0.254 |
| 6.4464e-05 | 0.254 |
| 6.4496e-05 | 0.25 |
| 6.4528e-05 | 0.254 |
| 6.456e-05 | 0.254 |
| 6.4592e-05 | 0.258 |
| 6.4624e-05 | 0.258 |
| 6.4656e-05 | 0.258 |
| 6.4688e-05 | 0.258 |
| 6.472e-05 | 0.258 |
| 6.4752e-05 | 0.262 |
| 6.4784e-05 | 0.258 |
| 6.4816e-05 | 0.262 |
| 6.4848e-05 | 0.262 |
| 6.488e-05 | 0.262 |
| 6.4912e-05 | 0.262 |
| 6.4944e-05 | 0.266 |
| 6.4976e-05 | 0.262 |
| 6.5008e-05 | 0.266 |
| 6.504e-05 | 0.266 |
| 6.5072e-05 | 0.266 |
| 6.5104e-05 | 0.266 |
| 6.5136e-05 | 0.266 |
| 6.5168e-05 | 0.266 |
| 6.52e-05 | 0.27 |
| 6.5232e-05 | 0.266 |
| 6.5264e-05 | 0.266 |
| 6.5296e-05 | 0.266 |
| 6.5328e-05 | 0.266 |
| 6.536e-05 | 0.266 |
| 6.5392e-05 | 0.266 |
| 6.5424e-05 | 0.266 |
| 6.5456e-05 | 0.27 |
| 6.5488e-05 | 0.266 |
| 6.552e-05 | 0.27 |
| 6.5552e-05 | 0.27 |
| 6.5584e-05 | 0.27 |
| 6.5616e-05 | 0.27 |
| 6.5648e-05 | 0.266 |
| 6.568e-05 | 0.27 |
| 6.5712e-05 | 0.266 |
| 6.5744e-05 | 0.266 |
| 6.5776e-05 | 0.266 |
| 6.5808e-05 | 0.266 |
| 6.584e-05 | 0.266 |
| 6.5872e-05 | 0.27 |
| 6.5904e-05 | 0.262 |
| 6.5936e-05 | 0.266 |
| 6.5968e-05 | 0.266 |
| 6.6e-05 | 0.266 |
| 6.6032e-05 | 0.266 |
| 6.6064e-05 | 0.266 |
| 6.6096e-05 | 0.266 |
| 6.6128e-05 | 0.262 |
| 6.616e-05 | 0.262 |
| 6.6192e-05 | 0.262 |
| 6.6224e-05 | 0.262 |
| 6.6256e-05 | 0.262 |
| 6.6288e-05 | 0.262 |
| 6.632e-05 | 0.262 |
| 6.6352e-05 | 0.262 |
| 6.6384e-05 | 0.262 |
| 6.6416e-05 | 0.262 |
| 6.6448e-05 | 0.262 |
| 6.648e-05 | 0.262 |
| 6.6512e-05 | 0.262 |
| 6.6544e-05 | 0.262 |
| 6.6576e-05 | 0.262 |
| 6.6608e-05 | 0.262 |
| 6.664e-05 | 0.262 |
| 6.6672e-05 | 0.262 |
| 6.6704e-05 | 0.262 |
| 6.6736e-05 | 0.258 |
| 6.6768e-05 | 0.262 |
| 6.68e-05 | 0.258 |
| 6.6832e-05 | 0.262 |
| 6.6864e-05 | 0.262 |
| 6.6896e-05 | 0.262 |
| 6.6928e-05 | 0.262 |
| 6.696e-05 | 0.262 |
| 6.6992e-05 | 0.262 |
| 6.7024e-05 | 0.262 |
| 6.7056e-05 | 0.262 |
| 6.7088e-05 | 0.262 |
| 6.712e-05 | 0.262 |
| 6.7152e-05 | 0.262 |
| 6.7184e-05 | 0.262 |
| 6.7216e-05 | 0.262 |
| 6.7248e-05 | 0.262 |
| 6.728e-05 | 0.262 |
| 6.7312e-05 | 0.262 |
| 6.7344e-05 | 0.262 |
| 6.7376e-05 | 0.262 |
| 6.7408e-05 | 0.258 |
| 6.744e-05 | 0.258 |
| 6.7472e-05 | 0.262 |
| 6.7504e-05 | 0.262 |
| 6.7536e-05 | 0.262 |
| 6.7568e-05 | 0.262 |
| 6.76e-05 | 0.262 |
| 6.7632e-05 | 0.262 |
| 6.7664e-05 | 0.262 |
| 6.7696e-05 | 0.262 |
| 6.7728e-05 | 0.262 |
| 6.776e-05 | 0.258 |
| 6.7792e-05 | 0.262 |
| 6.7824e-05 | 0.262 |
| 6.7856e-05 | 0.262 |
| 6.7888e-05 | 0.266 |
| 6.792e-05 | 0.262 |
| 6.7952e-05 | 0.262 |
| 6.7984e-05 | 0.262 |
| 6.8016e-05 | 0.262 |
| 6.8048e-05 | 0.262 |
| 6.808e-05 | 0.266 |
| 6.8112e-05 | 0.266 |
| 6.8144e-05 | 0.266 |
| 6.8176e-05 | 0.266 |
| 6.8208e-05 | 0.266 |
| 6.824e-05 | 0.266 |
| 6.8272e-05 | 0.266 |
| 6.8304e-05 | 0.266 |
| 6.8336e-05 | 0.266 |
| 6.8368e-05 | 0.266 |
| 6.84e-05 | 0.266 |
| 6.8432e-05 | 0.266 |
| 6.8464e-05 | 0.266 |
| 6.8496e-05 | 0.262 |
| 6.8528e-05 | 0.262 |
| 6.856e-05 | 0.266 |
| 6.8592e-05 | 0.266 |
| 6.8624e-05 | 0.262 |
| 6.8656e-05 | 0.262 |
| 6.8688e-05 | 0.262 |
| 6.872e-05 | 0.266 |
| 6.8752e-05 | 0.262 |
| 6.8784e-05 | 0.262 |
| 6.8816e-05 | 0.262 |
| 6.8848e-05 | 0.262 |
| 6.888e-05 | 0.262 |
| 6.8912e-05 | 0.262 |
| 6.8944e-05 | 0.262 |
| 6.8976e-05 | 0.262 |
| 6.9008e-05 | 0.262 |
| 6.904e-05 | 0.266 |
| 6.9072e-05 | 0.262 |
| 6.9104e-05 | 0.262 |
| 6.9136e-05 | 0.262 |
| 6.9168e-05 | 0.262 |
| 6.92e-05 | 0.266 |
| 6.9232e-05 | 0.262 |
| 6.9264e-05 | 0.266 |
| 6.9296e-05 | 0.266 |
| 6.9328e-05 | 0.266 |
| 6.936e-05 | 0.266 |
| 6.9392e-05 | 0.266 |
| 6.9424e-05 | 0.266 |
| 6.9456e-05 | 0.266 |
| 6.9488e-05 | 0.27 |
| 6.952e-05 | 0.266 |
| 6.9552e-05 | 0.266 |
| 6.9584e-05 | 0.27 |
| 6.9616e-05 | 0.27 |
| 6.9648e-05 | 0.27 |
| 6.968e-05 | 0.27 |
| 6.9712e-05 | 0.27 |
| 6.9744e-05 | 0.27 |
| 6.9776e-05 | 0.27 |
| 6.9808e-05 | 0.27 |
| 6.984e-05 | 0.266 |
| 6.9872e-05 | 0.27 |
| 6.9904e-05 | 0.27 |
| 6.9936e-05 | 0.27 |
| 6.9968e-05 | 0.27 |
| 7e-05 | 0.27 |
| 7.0032e-05 | 0.27 |
| 7.0064e-05 | 0.27 |
| 7.0096e-05 | 0.266 |
| 7.0128e-05 | 0.27 |
| 7.016e-05 | 0.27 |
| 7.0192e-05 | 0.27 |
| 7.0224e-05 | 0.27 |
| 7.0256e-05 | 0.27 |
| 7.0288e-05 | 0.27 |
| 7.032e-05 | 0.27 |
| 7.0352e-05 | 0.27 |
| 7.0384e-05 | 0.27 |
| 7.0416e-05 | 0.27 |
| 7.0448e-05 | 0.27 |
| 7.048e-05 | 0.27 |
| 7.0512e-05 | 0.27 |
| 7.0544e-05 | 0.27 |
| 7.0576e-05 | 0.266 |
| 7.0608e-05 | 0.27 |
| 7.064e-05 | 0.27 |
| 7.0672e-05 | 0.27 |
| 7.0704e-05 | 0.27 |
| 7.0736e-05 | 0.266 |
| 7.0768e-05 | 0.27 |
| 7.08e-05 | 0.27 |
| 7.0832e-05 | 0.27 |
| 7.0864e-05 | 0.266 |
| 7.0896e-05 | 0.27 |
| 7.0928e-05 | 0.27 |
| 7.096e-05 | 0.27 |
| 7.0992e-05 | 0.27 |
| 7.1024e-05 | 0.27 |
| 7.1056e-05 | 0.27 |
| 7.1088e-05 | 0.274 |
| 7.112e-05 | 0.27 |
| 7.1152e-05 | 0.27 |
| 7.1184e-05 | 0.27 |
| 7.1216e-05 | 0.27 |
| 7.1248e-05 | 0.27 |
| 7.128e-05 | 0.27 |
| 7.1312e-05 | 0.27 |
| 7.1344e-05 | 0.27 |
| 7.1376e-05 | 0.27 |
| 7.1408e-05 | 0.27 |
| 7.144e-05 | 0.27 |
| 7.1472e-05 | 0.27 |
| 7.1504e-05 | 0.27 |
| 7.1536e-05 | 0.27 |
| 7.1568e-05 | 0.27 |
| 7.16e-05 | 0.27 |
| 7.1632e-05 | 0.27 |
| 7.1664e-05 | 0.27 |
| 7.1696e-05 | 0.266 |
| 7.1728e-05 | 0.27 |
| 7.176e-05 | 0.266 |
| 7.1792e-05 | 0.266 |
| 7.1824e-05 | 0.266 |
| 7.1856e-05 | 0.266 |
| 7.1888e-05 | 0.266 |
| 7.192e-05 | 0.27 |
| 7.1952e-05 | 0.266 |
| 7.1984e-05 | 0.266 |
| 7.2016e-05 | 0.266 |
| 7.2048e-05 | 0.266 |
| 7.208e-05 | 0.266 |
| 7.2112e-05 | 0.266 |
| 7.2144e-05 | 0.266 |
| 7.2176e-05 | 0.266 |
| 7.2208e-05 | 0.262 |
| 7.224e-05 | 0.266 |
| 7.2272e-05 | 0.266 |
| 7.2304e-05 | 0.266 |
| 7.2336e-05 | 0.266 |
| 7.2368e-05 | 0.262 |
| 7.24e-05 | 0.266 |
| 7.2432e-05 | 0.266 |
| 7.2464e-05 | 0.266 |
| 7.2496e-05 | 0.266 |
| 7.2528e-05 | 0.266 |
| 7.256e-05 | 0.266 |
| 7.2592e-05 | 0.27 |
| 7.2624e-05 | 0.266 |
| 7.2656e-05 | 0.266 |
| 7.2688e-05 | 0.266 |
| 7.272e-05 | 0.27 |
| 7.2752e-05 | 0.27 |
| 7.2784e-05 | 0.266 |
| 7.2816e-05 | 0.27 |
| 7.2848e-05 | 0.27 |
| 7.288e-05 | 0.266 |
| 7.2912e-05 | 0.27 |
| 7.2944e-05 | 0.27 |
| 7.2976e-05 | 0.27 |
| 7.3008e-05 | 0.27 |
| 7.304e-05 | 0.27 |
| 7.3072e-05 | 0.27 |
| 7.3104e-05 | 0.27 |
| 7.3136e-05 | 0.27 |
| 7.3168e-05 | 0.27 |
| 7.32e-05 | 0.27 |
| 7.3232e-05 | 0.274 |
| 7.3264e-05 | 0.274 |
| 7.3296e-05 | 0.274 |
| 7.3328e-05 | 0.274 |
| 7.336e-05 | 0.274 |
| 7.3392e-05 | 0.274 |
| 7.3424e-05 | 0.274 |
| 7.3456e-05 | 0.274 |
| 7.3488e-05 | 0.278 |
| 7.352e-05 | 0.278 |
| 7.3552e-05 | 0.278 |
| 7.3584e-05 | 0.278 |
| 7.3616e-05 | 0.278 |
| 7.3648e-05 | 0.278 |
| 7.368e-05 | 0.278 |
| 7.3712e-05 | 0.282 |
| 7.3744e-05 | 0.278 |
| 7.3776e-05 | 0.282 |
| 7.3808e-05 | 0.282 |
| 7.384e-05 | 0.282 |
| 7.3872e-05 | 0.282 |
| 7.3904e-05 | 0.282 |
| 7.3936e-05 | 0.282 |
| 7.3968e-05 | 0.282 |
| 7.4e-05 | 0.282 |
| 7.4032e-05 | 0.282 |
| 7.4064e-05 | 0.282 |
| 7.4096e-05 | 0.282 |
| 7.4128e-05 | 0.282 |
| 7.416e-05 | 0.282 |
| 7.4192e-05 | 0.282 |
| 7.4224e-05 | 0.282 |
| 7.4256e-05 | 0.282 |
| 7.4288e-05 | 0.282 |
| 7.432e-05 | 0.282 |
| 7.4352e-05 | 0.286 |
| 7.4384e-05 | 0.278 |
| 7.4416e-05 | 0.282 |
| 7.4448e-05 | 0.282 |
| 7.448e-05 | 0.282 |
| 7.4512e-05 | 0.282 |
| 7.4544e-05 | 0.282 |
| 7.4576e-05 | 0.282 |
| 7.4608e-05 | 0.282 |
| 7.464e-05 | 0.282 |
| 7.4672e-05 | 0.282 |
| 7.4704e-05 | 0.282 |
| 7.4736e-05 | 0.282 |
| 7.4768e-05 | 0.278 |
| 7.48e-05 | 0.282 |
| 7.4832e-05 | 0.282 |
| 7.4864e-05 | 0.282 |
| 7.4896e-05 | 0.282 |
| 7.4928e-05 | 0.278 |
| 7.496e-05 | 0.278 |
| 7.4992e-05 | 0.278 |
| 7.5024e-05 | 0.282 |
| 7.5056e-05 | 0.278 |
| 7.5088e-05 | 0.278 |
| 7.512e-05 | 0.282 |
| 7.5152e-05 | 0.278 |
| 7.5184e-05 | 0.278 |
| 7.5216e-05 | 0.278 |
| 7.5248e-05 | 0.278 |
| 7.528e-05 | 0.274 |
| 7.5312e-05 | 0.278 |
| 7.5344e-05 | 0.274 |
| 7.5376e-05 | 0.27 |
| 7.5408e-05 | 0.274 |
| 7.544e-05 | 0.274 |
| 7.5472e-05 | 0.274 |
| 7.5504e-05 | 0.274 |
| 7.5536e-05 | 0.27 |
| 7.5568e-05 | 0.27 |
| 7.56e-05 | 0.27 |
| 7.5632e-05 | 0.27 |
| 7.5664e-05 | 0.27 |
| 7.5696e-05 | 0.266 |
| 7.5728e-05 | 0.27 |
| 7.576e-05 | 0.266 |
| 7.5792e-05 | 0.266 |
| 7.5824e-05 | 0.266 |
| 7.5856e-05 | 0.266 |
| 7.5888e-05 | 0.266 |
| 7.592e-05 | 0.266 |
| 7.5952e-05 | 0.266 |
| 7.5984e-05 | 0.262 |
| 7.6016e-05 | 0.262 |
| 7.6048e-05 | 0.262 |
| 7.608e-05 | 0.266 |
| 7.6112e-05 | 0.262 |
| 7.6144e-05 | 0.262 |
| 7.6176e-05 | 0.262 |
| 7.6208e-05 | 0.262 |
| 7.624e-05 | 0.258 |
| 7.6272e-05 | 0.262 |
| 7.6304e-05 | 0.262 |
| 7.6336e-05 | 0.258 |
| 7.6368e-05 | 0.258 |
| 7.64e-05 | 0.262 |
| 7.6432e-05 | 0.258 |
| 7.6464e-05 | 0.258 |
| 7.6496e-05 | 0.262 |
| 7.6528e-05 | 0.262 |
| 7.656e-05 | 0.262 |
| 7.6592e-05 | 0.262 |
| 7.6624e-05 | 0.262 |
| 7.6656e-05 | 0.262 |
| 7.6688e-05 | 0.262 |
| 7.672e-05 | 0.262 |
| 7.6752e-05 | 0.262 |
| 7.6784e-05 | 0.262 |
| 7.6816e-05 | 0.262 |
| 7.6848e-05 | 0.258 |
| 7.688e-05 | 0.262 |
| 7.6912e-05 | 0.262 |
| 7.6944e-05 | 0.262 |
| 7.6976e-05 | 0.262 |
| 7.7008e-05 | 0.262 |
| 7.704e-05 | 0.258 |
| 7.7072e-05 | 0.262 |
| 7.7104e-05 | 0.262 |
| 7.7136e-05 | 0.262 |
| 7.7168e-05 | 0.262 |
| 7.72e-05 | 0.262 |
| 7.7232e-05 | 0.262 |
| 7.7264e-05 | 0.262 |
| 7.7296e-05 | 0.262 |
| 7.7328e-05 | 0.266 |
| 7.736e-05 | 0.262 |
| 7.7392e-05 | 0.262 |
| 7.7424e-05 | 0.262 |
| 7.7456e-05 | 0.262 |
| 7.7488e-05 | 0.262 |
| 7.752e-05 | 0.262 |
| 7.7552e-05 | 0.262 |
| 7.7584e-05 | 0.262 |
| 7.7616e-05 | 0.262 |
| 7.7648e-05 | 0.262 |
| 7.768e-05 | 0.262 |
| 7.7712e-05 | 0.262 |
| 7.7744e-05 | 0.258 |
| 7.7776e-05 | 0.262 |
| 7.7808e-05 | 0.262 |
| 7.784e-05 | 0.262 |
| 7.7872e-05 | 0.262 |
| 7.7904e-05 | 0.262 |
| 7.7936e-05 | 0.262 |
| 7.7968e-05 | 0.262 |
| 7.8e-05 | 0.262 |
| 7.8032e-05 | 0.262 |
| 7.8064e-05 | 0.262 |
| 7.8096e-05 | 0.262 |
| 7.8128e-05 | 0.262 |
| 7.816e-05 | 0.262 |
| 7.8192e-05 | 0.262 |
| 7.8224e-05 | 0.262 |
| 7.8256e-05 | 0.262 |
| 7.8288e-05 | 0.262 |
| 7.832e-05 | 0.262 |
| 7.8352e-05 | 0.262 |
| 7.8384e-05 | 0.262 |
| 7.8416e-05 | 0.266 |
| 7.8448e-05 | 0.266 |
| 7.848e-05 | 0.262 |
| 7.8512e-05 | 0.262 |
| 7.8544e-05 | 0.266 |
| 7.8576e-05 | 0.262 |
| 7.8608e-05 | 0.262 |
| 7.864e-05 | 0.262 |
| 7.8672e-05 | 0.262 |
| 7.8704e-05 | 0.262 |
| 7.8736e-05 | 0.262 |
| 7.8768e-05 | 0.262 |
| 7.88e-05 | 0.262 |
| 7.8832e-05 | 0.262 |
| 7.8864e-05 | 0.262 |
| 7.8896e-05 | 0.262 |
| 7.8928e-05 | 0.258 |
| 7.896e-05 | 0.262 |
| 7.8992e-05 | 0.262 |
| 7.9024e-05 | 0.262 |
| 7.9056e-05 | 0.262 |
| 7.9088e-05 | 0.262 |
| 7.912e-05 | 0.262 |
| 7.9152e-05 | 0.262 |
| 7.9184e-05 | 0.262 |
| 7.9216e-05 | 0.262 |
| 7.9248e-05 | 0.258 |
| 7.928e-05 | 0.262 |
| 7.9312e-05 | 0.258 |
| 7.9344e-05 | 0.258 |
| 7.9376e-05 | 0.258 |
| 7.9408e-05 | 0.262 |
| 7.944e-05 | 0.258 |
| 7.9472e-05 | 0.258 |
| 7.9504e-05 | 0.258 |
| 7.9536e-05 | 0.258 |
| 7.9568e-05 | 0.258 |
| 7.96e-05 | 0.258 |
| 7.9632e-05 | 0.258 |
| 7.9664e-05 | 0.262 |
| 7.9696e-05 | 0.258 |
| 7.9728e-05 | 0.258 |
| 7.976e-05 | 0.258 |
| 7.9792e-05 | 0.262 |
| 7.9824e-05 | 0.262 |
| 7.9856e-05 | 0.258 |
| 7.9888e-05 | 0.262 |
| 7.992e-05 | 0.262 |
| 7.9952e-05 | 0.258 |
| 7.9984e-05 | 0.258 |
| 8.0016e-05 | 0.262 |
| 8.0048e-05 | 0.258 |
| 8.008e-05 | 0.258 |
| 8.0112e-05 | 0.262 |
| 8.0144e-05 | 0.258 |
| 8.0176e-05 | 0.262 |
| 8.0208e-05 | 0.258 |
| 8.024e-05 | 0.262 |
| 8.0272e-05 | 0.258 |
| 8.0304e-05 | 0.258 |
| 8.0336e-05 | 0.262 |
| 8.0368e-05 | 0.262 |
| 8.04e-05 | 0.258 |
| 8.0432e-05 | 0.258 |
| 8.0464e-05 | 0.262 |
| 8.0496e-05 | 0.258 |
| 8.0528e-05 | 0.262 |
| 8.056e-05 | 0.262 |
| 8.0592e-05 | 0.262 |
| 8.0624e-05 | 0.258 |
| 8.0656e-05 | 0.262 |
| 8.0688e-05 | 0.262 |
| 8.072e-05 | 0.262 |
| 8.0752e-05 | 0.262 |
| 8.0784e-05 | 0.258 |
| 8.0816e-05 | 0.262 |
| 8.0848e-05 | 0.258 |
| 8.088e-05 | 0.262 |
| 8.0912e-05 | 0.262 |
| 8.0944e-05 | 0.262 |
| 8.0976e-05 | 0.262 |
| 8.1008e-05 | 0.258 |
| 8.104e-05 | 0.258 |
| 8.1072e-05 | 0.258 |
| 8.1104e-05 | 0.262 |
| 8.1136e-05 | 0.258 |
| 8.1168e-05 | 0.258 |
| 8.12e-05 | 0.258 |
| 8.1232e-05 | 0.258 |
| 8.1264e-05 | 0.262 |
| 8.1296e-05 | 0.258 |
| 8.1328e-05 | 0.262 |
| 8.136e-05 | 0.262 |
| 8.1392e-05 | 0.262 |
| 8.1424e-05 | 0.262 |
| 8.1456e-05 | 0.262 |
| 8.1488e-05 | 0.262 |
| 8.152e-05 | 0.262 |
| 8.1552e-05 | 0.262 |
| 8.1584e-05 | 0.262 |
| 8.1616e-05 | 0.262 |
| 8.1648e-05 | 0.262 |
| 8.168e-05 | 0.262 |
| 8.1712e-05 | 0.262 |
| 8.1744e-05 | 0.262 |
| 8.1776e-05 | 0.262 |
| 8.1808e-05 | 0.262 |
| 8.184e-05 | 0.262 |
| 8.1872e-05 | 0.262 |
| 8.1904e-05 | 0.262 |
| 8.1936e-05 | 0.262 |
| 8.1968e-05 | 0.262 |
| 8.2e-05 | 0.262 |
| 8.2032e-05 | 0.262 |
| 8.2064e-05 | 0.258 |
| 8.2096e-05 | 0.262 |
| 8.2128e-05 | 0.262 |
| 8.216e-05 | 0.262 |
| 8.2192e-05 | 0.258 |
| 8.2224e-05 | 0.258 |
| 8.2256e-05 | 0.258 |
| 8.2288e-05 | 0.258 |
| 8.232e-05 | 0.258 |
| 8.2352e-05 | 0.258 |
| 8.2384e-05 | 0.258 |
| 8.2416e-05 | 0.258 |
| 8.2448e-05 | 0.258 |
| 8.248e-05 | 0.258 |
| 8.2512e-05 | 0.258 |
| 8.2544e-05 | 0.254 |
| 8.2576e-05 | 0.258 |
| 8.2608e-05 | 0.258 |
| 8.264e-05 | 0.254 |
| 8.2672e-05 | 0.254 |
| 8.2704e-05 | 0.258 |
| 8.2736e-05 | 0.254 |
| 8.2768e-05 | 0.258 |
| 8.28e-05 | 0.254 |
| 8.2832e-05 | 0.254 |
| 8.2864e-05 | 0.258 |
| 8.2896e-05 | 0.258 |
| 8.2928e-05 | 0.254 |
| 8.296e-05 | 0.254 |
| 8.2992e-05 | 0.258 |
| 8.3024e-05 | 0.254 |
| 8.3056e-05 | 0.254 |
| 8.3088e-05 | 0.254 |
| 8.312e-05 | 0.254 |
| 8.3152e-05 | 0.254 |
| 8.3184e-05 | 0.254 |
| 8.3216e-05 | 0.254 |
| 8.3248e-05 | 0.254 |
| 8.328e-05 | 0.258 |
| 8.3312e-05 | 0.254 |
| 8.3344e-05 | 0.254 |
| 8.3376e-05 | 0.258 |
| 8.3408e-05 | 0.254 |
| 8.344e-05 | 0.258 |
| 8.3472e-05 | 0.258 |
| 8.3504e-05 | 0.258 |
| 8.3536e-05 | 0.258 |
| 8.3568e-05 | 0.254 |
| 8.36e-05 | 0.258 |
| 8.3632e-05 | 0.254 |
| 8.3664e-05 | 0.254 |
| 8.3696e-05 | 0.254 |
| 8.3728e-05 | 0.254 |
| 8.376e-05 | 0.258 |
| 8.3792e-05 | 0.254 |
| 8.3824e-05 | 0.258 |
| 8.3856e-05 | 0.254 |
| 8.3888e-05 | 0.258 |
| 8.392e-05 | 0.254 |
| 8.3952e-05 | 0.254 |
| 8.3984e-05 | 0.258 |
| 8.4016e-05 | 0.258 |
| 8.4048e-05 | 0.258 |
| 8.408e-05 | 0.254 |
| 8.4112e-05 | 0.254 |
| 8.4144e-05 | 0.258 |
| 8.4176e-05 | 0.258 |
| 8.4208e-05 | 0.254 |
| 8.424e-05 | 0.254 |
| 8.4272e-05 | 0.258 |
| 8.4304e-05 | 0.254 |
| 8.4336e-05 | 0.254 |
| 8.4368e-05 | 0.254 |
| 8.44e-05 | 0.254 |
| 8.4432e-05 | 0.254 |
| 8.4464e-05 | 0.254 |
| 8.4496e-05 | 0.254 |
| 8.4528e-05 | 0.254 |
| 8.456e-05 | 0.254 |
| 8.4592e-05 | 0.254 |
| 8.4624e-05 | 0.254 |
| 8.4656e-05 | 0.254 |
| 8.4688e-05 | 0.25 |
| 8.472e-05 | 0.254 |
| 8.4752e-05 | 0.254 |
| 8.4784e-05 | 0.254 |
| 8.4816e-05 | 0.254 |
| 8.4848e-05 | 0.25 |
| 8.488e-05 | 0.25 |
| 8.4912e-05 | 0.254 |
| 8.4944e-05 | 0.254 |
| 8.4976e-05 | 0.25 |
| 8.5008e-05 | 0.25 |
| 8.504e-05 | 0.254 |
| 8.5072e-05 | 0.25 |
| 8.5104e-05 | 0.25 |
| 8.5136e-05 | 0.25 |
| 8.5168e-05 | 0.25 |
| 8.52e-05 | 0.25 |
| 8.5232e-05 | 0.25 |
| 8.5264e-05 | 0.25 |
| 8.5296e-05 | 0.25 |
| 8.5328e-05 | 0.25 |
| 8.536e-05 | 0.25 |
| 8.5392e-05 | 0.25 |
| 8.5424e-05 | 0.25 |
| 8.5456e-05 | 0.25 |
| 8.5488e-05 | 0.25 |
| 8.552e-05 | 0.254 |
| 8.5552e-05 | 0.25 |
| 8.5584e-05 | 0.254 |
| 8.5616e-05 | 0.25 |
| 8.5648e-05 | 0.25 |
| 8.568e-05 | 0.254 |
| 8.5712e-05 | 0.25 |
| 8.5744e-05 | 0.254 |
| 8.5776e-05 | 0.254 |
| 8.5808e-05 | 0.254 |
| 8.584e-05 | 0.25 |
| 8.5872e-05 | 0.25 |
| 8.5904e-05 | 0.254 |
| 8.5936e-05 | 0.254 |
| 8.5968e-05 | 0.254 |
| 8.6e-05 | 0.254 |
| 8.6032e-05 | 0.254 |
| 8.6064e-05 | 0.254 |
| 8.6096e-05 | 0.254 |
| 8.6128e-05 | 0.254 |
| 8.616e-05 | 0.254 |
| 8.6192e-05 | 0.254 |
| 8.6224e-05 | 0.258 |
| 8.6256e-05 | 0.258 |
| 8.6288e-05 | 0.258 |
| 8.632e-05 | 0.258 |
| 8.6352e-05 | 0.258 |
| 8.6384e-05 | 0.258 |
| 8.6416e-05 | 0.258 |
| 8.6448e-05 | 0.258 |
| 8.648e-05 | 0.258 |
| 8.6512e-05 | 0.258 |
| 8.6544e-05 | 0.258 |
| 8.6576e-05 | 0.258 |
| 8.6608e-05 | 0.258 |
| 8.664e-05 | 0.258 |
| 8.6672e-05 | 0.258 |
| 8.6704e-05 | 0.258 |
| 8.6736e-05 | 0.262 |
| 8.6768e-05 | 0.262 |
| 8.68e-05 | 0.258 |
| 8.6832e-05 | 0.258 |
| 8.6864e-05 | 0.258 |
| 8.6896e-05 | 0.262 |
| 8.6928e-05 | 0.262 |
| 8.696e-05 | 0.262 |
| 8.6992e-05 | 0.262 |
| 8.7024e-05 | 0.258 |
| 8.7056e-05 | 0.262 |
| 8.7088e-05 | 0.266 |
| 8.712e-05 | 0.262 |
| 8.7152e-05 | 0.262 |
| 8.7184e-05 | 0.262 |
| 8.7216e-05 | 0.262 |
| 8.7248e-05 | 0.262 |
| 8.728e-05 | 0.262 |
| 8.7312e-05 | 0.262 |
| 8.7344e-05 | 0.258 |
| 8.7376e-05 | 0.262 |
| 8.7408e-05 | 0.258 |
| 8.744e-05 | 0.258 |
| 8.7472e-05 | 0.258 |
| 8.7504e-05 | 0.262 |
| 8.7536e-05 | 0.258 |
| 8.7568e-05 | 0.258 |
| 8.76e-05 | 0.258 |
| 8.7632e-05 | 0.258 |
| 8.7664e-05 | 0.254 |
| 8.7696e-05 | 0.258 |
| 8.7728e-05 | 0.254 |
| 8.776e-05 | 0.258 |
| 8.7792e-05 | 0.254 |
| 8.7824e-05 | 0.254 |
| 8.7856e-05 | 0.254 |
| 8.7888e-05 | 0.25 |
| 8.792e-05 | 0.254 |
| 8.7952e-05 | 0.254 |
| 8.7984e-05 | 0.254 |
| 8.8016e-05 | 0.25 |
| 8.8048e-05 | 0.25 |
| 8.808e-05 | 0.25 |
| 8.8112e-05 | 0.25 |
| 8.8144e-05 | 0.25 |
| 8.8176e-05 | 0.246 |
| 8.8208e-05 | 0.25 |
| 8.824e-05 | 0.246 |
| 8.8272e-05 | 0.246 |
| 8.8304e-05 | 0.25 |
| 8.8336e-05 | 0.25 |
| 8.8368e-05 | 0.25 |
| 8.84e-05 | 0.246 |
| 8.8432e-05 | 0.246 |
| 8.8464e-05 | 0.246 |
| 8.8496e-05 | 0.246 |
| 8.8528e-05 | 0.246 |
| 8.856e-05 | 0.246 |
| 8.8592e-05 | 0.246 |
| 8.8624e-05 | 0.246 |
| 8.8656e-05 | 0.246 |
| 8.8688e-05 | 0.246 |
| 8.872e-05 | 0.25 |
| 8.875199999999999e-05 | 0.246 |
| 8.8784e-05 | 0.246 |
| 8.8816e-05 | 0.246 |
| 8.8848e-05 | 0.246 |
| 8.888e-05 | 0.25 |
| 8.8912e-05 | 0.246 |
| 8.8944e-05 | 0.25 |
| 8.8976e-05 | 0.25 |
| 8.9008e-05 | 0.25 |
| 8.904e-05 | 0.246 |
| 8.9072e-05 | 0.25 |
| 8.9104e-05 | 0.246 |
| 8.9136e-05 | 0.25 |
| 8.9168e-05 | 0.246 |
| 8.92e-05 | 0.25 |
| 8.9232e-05 | 0.25 |
| 8.9264e-05 | 0.25 |
| 8.9296e-05 | 0.246 |
| 8.9328e-05 | 0.246 |
| 8.936e-05 | 0.246 |
| 8.9392e-05 | 0.25 |
| 8.9424e-05 | 0.25 |
| 8.9456e-05 | 0.25 |
| 8.9488e-05 | 0.25 |
| 8.952e-05 | 0.25 |
| 8.9552e-05 | 0.25 |
| 8.9584e-05 | 0.25 |
| 8.9616e-05 | 0.25 |
| 8.9648e-05 | 0.25 |
| 8.968e-05 | 0.254 |
| 8.9712e-05 | 0.25 |
| 8.9744e-05 | 0.25 |
| 8.9776e-05 | 0.254 |
| 8.9808e-05 | 0.254 |
| 8.984e-05 | 0.25 |
| 8.9872e-05 | 0.254 |
| 8.9904e-05 | 0.254 |
| 8.9936e-05 | 0.254 |
| 8.9968e-05 | 0.254 |
| 9e-05 | 0.254 |
| 9.0032e-05 | 0.254 |
| 9.0064e-05 | 0.254 |
| 9.0096e-05 | 0.258 |
| 9.0128e-05 | 0.254 |
| 9.016e-05 | 0.258 |
| 9.0192e-05 | 0.258 |
| 9.0224e-05 | 0.258 |
| 9.0256e-05 | 0.258 |
| 9.0288e-05 | 0.258 |
| 9.032e-05 | 0.258 |
| 9.0352e-05 | 0.258 |
| 9.0384e-05 | 0.258 |
| 9.0416e-05 | 0.258 |
| 9.0448e-05 | 0.262 |
| 9.048e-05 | 0.258 |
| 9.0512e-05 | 0.258 |
| 9.0544e-05 | 0.258 |
| 9.0576e-05 | 0.258 |
| 9.0608e-05 | 0.262 |
| 9.064e-05 | 0.258 |
| 9.0672e-05 | 0.258 |
| 9.0704e-05 | 0.258 |
| 9.0736e-05 | 0.258 |
| 9.0768e-05 | 0.258 |
| 9.08e-05 | 0.258 |
| 9.0832e-05 | 0.258 |
| 9.0864e-05 | 0.258 |
| 9.0896e-05 | 0.258 |
| 9.0928e-05 | 0.254 |
| 9.096e-05 | 0.258 |
| 9.0992e-05 | 0.258 |
| 9.1024e-05 | 0.258 |
| 9.1056e-05 | 0.258 |
| 9.1088e-05 | 0.258 |
| 9.112e-05 | 0.254 |
| 9.1152e-05 | 0.258 |
| 9.1184e-05 | 0.258 |
| 9.1216e-05 | 0.254 |
| 9.1248e-05 | 0.258 |
| 9.128e-05 | 0.258 |
| 9.1312e-05 | 0.254 |
| 9.1344e-05 | 0.254 |
| 9.1376e-05 | 0.258 |
| 9.1408e-05 | 0.254 |
| 9.144e-05 | 0.254 |
| 9.1472e-05 | 0.254 |
| 9.1504e-05 | 0.258 |
| 9.1536e-05 | 0.254 |
| 9.1568e-05 | 0.254 |
| 9.16e-05 | 0.258 |
| 9.1632e-05 | 0.254 |
| 9.1664e-05 | 0.254 |
| 9.1696e-05 | 0.254 |
| 9.1728e-05 | 0.254 |
| 9.176e-05 | 0.254 |
| 9.1792e-05 | 0.254 |
| 9.1824e-05 | 0.254 |
| 9.1856e-05 | 0.254 |
| 9.1888e-05 | 0.254 |
| 9.192e-05 | 0.25 |
| 9.1952e-05 | 0.25 |
| 9.1984e-05 | 0.25 |
| 9.2016e-05 | 0.25 |
| 9.2048e-05 | 0.25 |
| 9.208e-05 | 0.25 |
| 9.2112e-05 | 0.25 |
| 9.2144e-05 | 0.246 |
| 9.2176e-05 | 0.25 |
| 9.2208e-05 | 0.25 |
| 9.224e-05 | 0.25 |
| 9.2272e-05 | 0.25 |
| 9.2304e-05 | 0.25 |
| 9.2336e-05 | 0.246 |
| 9.2368e-05 | 0.246 |
| 9.24e-05 | 0.25 |
| 9.2432e-05 | 0.246 |
| 9.2464e-05 | 0.246 |
| 9.2496e-05 | 0.25 |
| 9.2528e-05 | 0.246 |
| 9.256e-05 | 0.25 |
| 9.2592e-05 | 0.246 |
| 9.2624e-05 | 0.246 |
| 9.2656e-05 | 0.246 |
| 9.2688e-05 | 0.246 |
| 9.272e-05 | 0.246 |
| 9.2752e-05 | 0.246 |
| 9.2784e-05 | 0.246 |
| 9.2816e-05 | 0.246 |
| 9.2848e-05 | 0.25 |
| 9.288e-05 | 0.246 |
| 9.2912e-05 | 0.246 |
| 9.2944e-05 | 0.246 |
| 9.2976e-05 | 0.25 |
| 9.3008e-05 | 0.246 |
| 9.304e-05 | 0.246 |
| 9.3072e-05 | 0.246 |
| 9.3104e-05 | 0.25 |
| 9.3136e-05 | 0.25 |
| 9.3168e-05 | 0.25 |
| 9.32e-05 | 0.246 |
| 9.3232e-05 | 0.246 |
| 9.3264e-05 | 0.25 |
| 9.3296e-05 | 0.25 |
| 9.3328e-05 | 0.25 |
| 9.336e-05 | 0.25 |
| 9.3392e-05 | 0.246 |
| 9.3424e-05 | 0.25 |
| 9.3456e-05 | 0.25 |
| 9.3488e-05 | 0.25 |
| 9.352e-05 | 0.25 |
| 9.3552e-05 | 0.25 |
| 9.3584e-05 | 0.25 |
| 9.3616e-05 | 0.25 |
| 9.3648e-05 | 0.254 |
| 9.368e-05 | 0.254 |
| 9.3712e-05 | 0.25 |
| 9.3744e-05 | 0.254 |
| 9.3776e-05 | 0.254 |
| 9.3808e-05 | 0.25 |
| 9.384e-05 | 0.254 |
| 9.3872e-05 | 0.254 |
| 9.3904e-05 | 0.254 |
| 9.3936e-05 | 0.254 |
| 9.3968e-05 | 0.254 |
| 9.4e-05 | 0.258 |
| 9.4032e-05 | 0.258 |
| 9.4064e-05 | 0.258 |
| 9.4096e-05 | 0.258 |
| 9.4128e-05 | 0.262 |
| 9.416e-05 | 0.258 |
| 9.4192e-05 | 0.262 |
| 9.4224e-05 | 0.262 |
| 9.4256e-05 | 0.262 |
| 9.4288e-05 | 0.262 |
| 9.432e-05 | 0.262 |
| 9.4352e-05 | 0.262 |
| 9.4384e-05 | 0.266 |
| 9.4416e-05 | 0.262 |
| 9.4448e-05 | 0.262 |
| 9.448e-05 | 0.266 |
| 9.4512e-05 | 0.266 |
| 9.4544e-05 | 0.262 |
| 9.4576e-05 | 0.266 |
| 9.4608e-05 | 0.266 |
| 9.464e-05 | 0.266 |
| 9.4672e-05 | 0.266 |
| 9.4704e-05 | 0.266 |
| 9.4736e-05 | 0.266 |
| 9.4768e-05 | 0.266 |
| 9.48e-05 | 0.262 |
| 9.4832e-05 | 0.266 |
| 9.4864e-05 | 0.266 |
| 9.4896e-05 | 0.266 |
| 9.4928e-05 | 0.266 |
| 9.496e-05 | 0.266 |
| 9.4992e-05 | 0.262 |
| 9.5024e-05 | 0.266 |
| 9.5056e-05 | 0.266 |
| 9.5088e-05 | 0.262 |
| 9.512e-05 | 0.262 |
| 9.5152e-05 | 0.266 |
| 9.5184e-05 | 0.266 |
| 9.5216e-05 | 0.262 |
| 9.5248e-05 | 0.262 |
| 9.528e-05 | 0.262 |
| 9.5312e-05 | 0.262 |
| 9.5344e-05 | 0.262 |
| 9.5376e-05 | 0.262 |
| 9.5408e-05 | 0.262 |
| 9.544e-05 | 0.258 |
| 9.5472e-05 | 0.258 |
| 9.5504e-05 | 0.258 |
| 9.5536e-05 | 0.258 |
| 9.5568e-05 | 0.258 |
| 9.56e-05 | 0.258 |
| 9.5632e-05 | 0.258 |
| 9.5664e-05 | 0.258 |
| 9.5696e-05 | 0.258 |
| 9.5728e-05 | 0.258 |
| 9.576e-05 | 0.254 |
| 9.5792e-05 | 0.254 |
| 9.5824e-05 | 0.254 |
| 9.5856e-05 | 0.254 |
| 9.5888e-05 | 0.254 |
| 9.592e-05 | 0.254 |
| 9.5952e-05 | 0.25 |
| 9.5984e-05 | 0.254 |
| 9.6016e-05 | 0.25 |
| 9.6048e-05 | 0.25 |
| 9.608e-05 | 0.25 |
| 9.6112e-05 | 0.254 |
| 9.6144e-05 | 0.25 |
| 9.6176e-05 | 0.25 |
| 9.6208e-05 | 0.254 |
| 9.624e-05 | 0.25 |
| 9.6272e-05 | 0.25 |
| 9.6304e-05 | 0.25 |
| 9.6336e-05 | 0.25 |
| 9.6368e-05 | 0.25 |
| 9.64e-05 | 0.254 |
| 9.6432e-05 | 0.25 |
| 9.6464e-05 | 0.25 |
| 9.6496e-05 | 0.25 |
| 9.6528e-05 | 0.25 |
| 9.656e-05 | 0.25 |
| 9.6592e-05 | 0.25 |
| 9.6624e-05 | 0.25 |
| 9.6656e-05 | 0.25 |
| 9.6688e-05 | 0.25 |
| 9.672e-05 | 0.25 |
| 9.6752e-05 | 0.25 |
| 9.6784e-05 | 0.25 |
| 9.6816e-05 | 0.25 |
| 9.6848e-05 | 0.254 |
| 9.688e-05 | 0.254 |
| 9.6912e-05 | 0.254 |
| 9.6944e-05 | 0.254 |
| 9.6976e-05 | 0.254 |
| 9.7008e-05 | 0.254 |
| 9.704e-05 | 0.254 |
| 9.7072e-05 | 0.254 |
| 9.7104e-05 | 0.254 |
| 9.7136e-05 | 0.254 |
| 9.7168e-05 | 0.254 |
| 9.72e-05 | 0.254 |
| 9.7232e-05 | 0.254 |
| 9.7264e-05 | 0.258 |
| 9.7296e-05 | 0.258 |
| 9.7328e-05 | 0.254 |
| 9.736e-05 | 0.258 |
| 9.7392e-05 | 0.258 |
| 9.7424e-05 | 0.254 |
| 9.7456e-05 | 0.258 |
| 9.7488e-05 | 0.258 |
| 9.752e-05 | 0.258 |
| 9.7552e-05 | 0.258 |
| 9.7584e-05 | 0.258 |
| 9.7616e-05 | 0.254 |
| 9.7648e-05 | 0.258 |
| 9.768e-05 | 0.258 |
| 9.7712e-05 | 0.258 |
| 9.7744e-05 | 0.258 |
| 9.7776e-05 | 0.254 |
| 9.7808e-05 | 0.258 |
| 9.784e-05 | 0.258 |
| 9.7872e-05 | 0.258 |
| 9.7904e-05 | 0.258 |
| 9.7936e-05 | 0.258 |
| 9.7968e-05 | 0.254 |
| 9.8e-05 | 0.258 |
| 9.8032e-05 | 0.258 |
| 9.8064e-05 | 0.258 |
| 9.8096e-05 | 0.258 |
| 9.8128e-05 | 0.258 |
| 9.816e-05 | 0.258 |
| 9.8192e-05 | 0.258 |
| 9.8224e-05 | 0.254 |
| 9.8256e-05 | 0.258 |
| 9.8288e-05 | 0.254 |
| 9.832e-05 | 0.254 |
| 9.8352e-05 | 0.258 |
| 9.8384e-05 | 0.254 |
| 9.8416e-05 | 0.254 |
| 9.8448e-05 | 0.254 |
| 9.848e-05 | 0.254 |
| 9.8512e-05 | 0.258 |
| 9.8544e-05 | 0.254 |
| 9.8576e-05 | 0.254 |
| 9.8608e-05 | 0.254 |
| 9.864e-05 | 0.254 |
| 9.8672e-05 | 0.254 |
| 9.8704e-05 | 0.254 |
| 9.8736e-05 | 0.254 |
| 9.8768e-05 | 0.254 |
| 9.88e-05 | 0.258 |
| 9.8832e-05 | 0.254 |
| 9.8864e-05 | 0.254 |
| 9.8896e-05 | 0.254 |
| 9.8928e-05 | 0.254 |
| 9.896e-05 | 0.254 |
| 9.8992e-05 | 0.254 |
| 9.9024e-05 | 0.254 |
| 9.9056e-05 | 0.254 |
| 9.9088e-05 | 0.254 |
| 9.912e-05 | 0.254 |
| 9.9152e-05 | 0.254 |
| 9.9184e-05 | 0.254 |
| 9.9216e-05 | 0.254 |
| 9.9248e-05 | 0.254 |
| 9.928e-05 | 0.254 |
| 9.9312e-05 | 0.254 |
| 9.9344e-05 | 0.254 |
| 9.9376e-05 | 0.254 |
| 9.9408e-05 | 0.254 |
| 9.944e-05 | 0.254 |
| 9.9472e-05 | 0.254 |
| 9.9504e-05 | 0.254 |
| 9.9536e-05 | 0.25 |
| 9.9568e-05 | 0.254 |
| 9.96e-05 | 0.254 |
| 9.9632e-05 | 0.254 |
| 9.9664e-05 | 0.258 |
| 9.9696e-05 | 0.254 |
| 9.9728e-05 | 0.254 |
| 9.976e-05 | 0.254 |
| 9.9792e-05 | 0.254 |
| 9.9824e-05 | 0.254 |
| 9.9856e-05 | 0.254 |
| 9.9888e-05 | 0.254 |
| 9.992e-05 | 0.254 |
| 9.9952e-05 | 0.254 |
| 9.9984e-05 | 0.254 |
| 0.00010002 | 0.254 |
| 0.00010005 | 0.254 |
| 0.00010008 | 0.254 |
| 0.00010011 | 0.25 |
| 0.00010014 | 0.254 |
| 0.00010018 | 0.254 |
| 0.00010021 | 0.254 |
| 0.00010024 | 0.254 |
| 0.00010027 | 0.254 |
| 0.0001003 | 0.254 |
| 0.00010034 | 0.254 |
| 0.00010037 | 0.258 |
| 0.0001004 | 0.254 |
| 0.00010043 | 0.258 |
| 0.00010046 | 0.254 |
| 0.0001005 | 0.254 |
| 0.00010053 | 0.254 |
| 0.00010056 | 0.254 |
| 0.00010059 | 0.254 |
| 0.00010062 | 0.254 |
| 0.00010066 | 0.254 |
| 0.00010069 | 0.254 |
| 0.00010072 | 0.254 |
| 0.00010075 | 0.254 |
| 0.00010078 | 0.254 |
| 0.00010082 | 0.254 |
| 0.00010085 | 0.254 |
| 0.00010088 | 0.254 |
| 0.00010091 | 0.254 |
| 0.00010094 | 0.254 |
| 0.00010098 | 0.258 |
| 0.00010101 | 0.254 |
| 0.00010104 | 0.258 |
| 0.00010107 | 0.258 |
| 0.0001011 | 0.258 |
| 0.00010114 | 0.254 |
| 0.00010117 | 0.254 |
| 0.0001012 | 0.254 |
| 0.00010123 | 0.254 |
| 0.00010126 | 0.254 |
| 0.0001013 | 0.254 |
| 0.00010133 | 0.258 |
| 0.00010136 | 0.254 |
| 0.00010139 | 0.254 |
| 0.00010142 | 0.254 |
| 0.00010146 | 0.254 |
| 0.00010149 | 0.254 |
| 0.00010152 | 0.254 |
| 0.00010155 | 0.254 |
| 0.00010158 | 0.254 |
| 0.00010162 | 0.254 |
| 0.00010165 | 0.254 |
| 0.00010168 | 0.254 |
| 0.00010171 | 0.254 |
| 0.00010174 | 0.254 |
| 0.00010178 | 0.254 |
| 0.00010181 | 0.254 |
| 0.00010184 | 0.254 |
| 0.00010187 | 0.254 |
| 0.0001019 | 0.254 |
| 0.00010194 | 0.258 |
| 0.00010197 | 0.254 |
| 0.000102 | 0.254 |
| 0.00010203 | 0.254 |
| 0.00010206 | 0.258 |
| 0.0001021 | 0.254 |
| 0.00010213 | 0.258 |
| 0.00010216 | 0.258 |
| 0.00010219 | 0.258 |
| 0.00010222 | 0.254 |
| 0.00010226 | 0.254 |
| 0.00010229 | 0.254 |
| 0.00010232 | 0.254 |
| 0.00010235 | 0.254 |
| 0.00010238 | 0.254 |
| 0.00010242 | 0.254 |
| 0.00010245 | 0.254 |
| 0.00010248 | 0.254 |
| 0.00010251 | 0.254 |
| 0.00010254 | 0.254 |
| 0.00010258 | 0.254 |
| 0.00010261 | 0.254 |
| 0.00010264 | 0.25 |
| 0.00010267 | 0.254 |
| 0.0001027 | 0.254 |
| 0.00010274 | 0.254 |
| 0.00010277 | 0.254 |
| 0.0001028 | 0.254 |
| 0.00010283 | 0.254 |
| 0.00010286 | 0.25 |
| 0.0001029 | 0.254 |
| 0.00010293 | 0.25 |
| 0.00010296 | 0.25 |
| 0.00010299 | 0.25 |
| 0.00010302 | 0.254 |
| 0.00010306 | 0.25 |
| 0.00010309 | 0.25 |
| 0.00010312 | 0.254 |
| 0.00010315 | 0.25 |
| 0.00010318 | 0.25 |
| 0.00010322 | 0.25 |
| 0.00010325 | 0.25 |
| 0.00010328 | 0.254 |
| 0.00010331 | 0.25 |
| 0.00010334 | 0.25 |
| 0.00010338 | 0.25 |
| 0.00010341 | 0.25 |
| 0.00010344 | 0.25 |
| 0.00010347 | 0.25 |
| 0.0001035 | 0.25 |
| 0.00010354 | 0.25 |
| 0.00010357 | 0.25 |
| 0.0001036 | 0.25 |
| 0.00010363 | 0.25 |
| 0.00010366 | 0.25 |
| 0.0001037 | 0.25 |
| 0.00010373 | 0.25 |
| 0.00010376 | 0.25 |
| 0.00010379 | 0.25 |
| 0.00010382 | 0.25 |
| 0.00010386 | 0.25 |
| 0.00010389 | 0.25 |
| 0.00010392 | 0.25 |
| 0.00010395 | 0.25 |
| 0.00010398 | 0.25 |
| 0.00010402 | 0.25 |
| 0.00010405 | 0.25 |
| 0.00010408 | 0.25 |
| 0.00010411 | 0.25 |
| 0.00010414 | 0.25 |
| 0.00010418 | 0.254 |
| 0.00010421 | 0.25 |
| 0.00010424 | 0.25 |
| 0.00010427 | 0.254 |
| 0.0001043 | 0.254 |
| 0.00010434 | 0.254 |
| 0.00010437 | 0.254 |
| 0.0001044 | 0.254 |
| 0.00010443 | 0.254 |
| 0.00010446 | 0.25 |
| 0.0001045 | 0.254 |
| 0.00010453 | 0.254 |
| 0.00010456 | 0.254 |
| 0.00010459 | 0.254 |
| 0.00010462 | 0.254 |
| 0.00010466 | 0.254 |
| 0.00010469 | 0.254 |
| 0.00010472 | 0.254 |
| 0.00010475 | 0.258 |
| 0.00010478 | 0.254 |
| 0.00010482 | 0.254 |
| 0.00010485 | 0.254 |
| 0.00010488 | 0.258 |
| 0.00010491 | 0.258 |
| 0.00010494 | 0.254 |
| 0.00010498 | 0.254 |
| 0.00010501 | 0.258 |
| 0.00010504 | 0.258 |
| 0.00010507 | 0.258 |
| 0.0001051 | 0.258 |
| 0.00010514 | 0.258 |
| 0.00010517 | 0.258 |
| 0.0001052 | 0.258 |
| 0.00010523 | 0.258 |
| 0.00010526 | 0.258 |
| 0.0001053 | 0.258 |
| 0.00010533 | 0.258 |
| 0.00010536 | 0.262 |
| 0.00010539 | 0.258 |
| 0.00010542 | 0.258 |
| 0.00010546 | 0.258 |
| 0.00010549 | 0.258 |
| 0.00010552 | 0.258 |
| 0.00010555 | 0.258 |
| 0.00010558 | 0.262 |
| 0.00010562 | 0.258 |
| 0.00010565 | 0.258 |
| 0.00010568 | 0.258 |
| 0.00010571 | 0.254 |
| 0.00010574 | 0.258 |
| 0.00010578 | 0.258 |
| 0.00010581 | 0.258 |
| 0.00010584 | 0.254 |
| 0.00010587 | 0.254 |
| 0.0001059 | 0.254 |
| 0.00010594 | 0.254 |
| 0.00010597 | 0.254 |
| 0.000106 | 0.254 |
| 0.00010603 | 0.254 |
| 0.00010606 | 0.254 |
| 0.0001061 | 0.254 |
| 0.00010613 | 0.254 |
| 0.00010616 | 0.254 |
| 0.00010619 | 0.254 |
| 0.00010622 | 0.25 |
| 0.00010626 | 0.25 |
| 0.00010629 | 0.254 |
| 0.00010632 | 0.25 |
| 0.00010635 | 0.25 |
| 0.00010638 | 0.25 |
| 0.00010642 | 0.25 |
| 0.00010645 | 0.25 |
| 0.00010648 | 0.25 |
| 0.00010651 | 0.25 |
| 0.00010654 | 0.25 |
| 0.00010658 | 0.25 |
| 0.00010661 | 0.25 |
| 0.00010664 | 0.25 |
| 0.00010667 | 0.25 |
| 0.0001067 | 0.25 |
| 0.00010674 | 0.25 |
| 0.00010677 | 0.254 |
| 0.0001068 | 0.25 |
| 0.00010683 | 0.25 |
| 0.00010686 | 0.254 |
| 0.0001069 | 0.254 |
| 0.00010693 | 0.254 |
| 0.00010696 | 0.254 |
| 0.00010699 | 0.254 |
| 0.00010702 | 0.25 |
| 0.00010706 | 0.254 |
| 0.00010709 | 0.254 |
| 0.00010712 | 0.254 |
| 0.00010715 | 0.254 |
| 0.00010718 | 0.254 |
| 0.00010722 | 0.254 |
| 0.00010725 | 0.258 |
| 0.00010728 | 0.258 |
| 0.00010731 | 0.258 |
| 0.00010734 | 0.254 |
| 0.00010738 | 0.258 |
| 0.00010741 | 0.258 |
| 0.00010744 | 0.258 |
| 0.00010747 | 0.258 |
| 0.0001075 | 0.258 |
| 0.00010754 | 0.258 |
| 0.00010757 | 0.258 |
| 0.0001076 | 0.262 |
| 0.00010763 | 0.262 |
| 0.00010766 | 0.262 |
| 0.0001077 | 0.262 |
| 0.00010773 | 0.262 |
| 0.00010776 | 0.262 |
| 0.00010779 | 0.266 |
| 0.00010782 | 0.266 |
| 0.00010786 | 0.266 |
| 0.00010789 | 0.266 |
| 0.00010792 | 0.266 |
| 0.00010795 | 0.266 |
| 0.00010798 | 0.266 |
| 0.00010802 | 0.266 |
| 0.00010805 | 0.266 |
| 0.00010808 | 0.266 |
| 0.00010811 | 0.266 |
| 0.00010814 | 0.266 |
| 0.00010818 | 0.266 |
| 0.00010821 | 0.266 |
| 0.00010824 | 0.266 |
| 0.00010827 | 0.266 |
| 0.0001083 | 0.266 |
| 0.00010834 | 0.266 |
| 0.00010837 | 0.266 |
| 0.0001084 | 0.266 |
| 0.00010843 | 0.266 |
| 0.00010846 | 0.266 |
| 0.0001085 | 0.266 |
| 0.00010853 | 0.266 |
| 0.00010856 | 0.266 |
| 0.00010859 | 0.266 |
| 0.00010862 | 0.266 |
| 0.00010866 | 0.262 |
| 0.00010869 | 0.266 |
| 0.00010872 | 0.262 |
| 0.00010875 | 0.266 |
| 0.00010878 | 0.266 |
| 0.00010882 | 0.262 |
| 0.00010885 | 0.266 |
| 0.00010888 | 0.262 |
| 0.00010891 | 0.262 |
| 0.00010894 | 0.262 |
| 0.00010898 | 0.262 |
| 0.00010901 | 0.262 |
| 0.00010904 | 0.262 |
| 0.00010907 | 0.258 |
| 0.0001091 | 0.258 |
| 0.00010914 | 0.258 |
| 0.00010917 | 0.258 |
| 0.0001092 | 0.258 |
| 0.00010923 | 0.258 |
| 0.00010926 | 0.258 |
| 0.0001093 | 0.258 |
| 0.00010933 | 0.258 |
| 0.00010936 | 0.258 |
| 0.00010939 | 0.254 |
| 0.00010942 | 0.254 |
| 0.00010946 | 0.254 |
| 0.00010949 | 0.254 |
| 0.00010952 | 0.254 |
| 0.00010955 | 0.254 |
| 0.00010958 | 0.254 |
| 0.00010962 | 0.254 |
| 0.00010965 | 0.25 |
| 0.00010968 | 0.254 |
| 0.00010971 | 0.254 |
| 0.00010974 | 0.254 |
| 0.00010978 | 0.254 |
| 0.00010981 | 0.25 |
| 0.00010984 | 0.25 |
| 0.00010987 | 0.25 |
| 0.0001099 | 0.25 |
| 0.00010994 | 0.25 |
| 0.00010997 | 0.25 |
| 0.00011 | 0.25 |
| 0.00011003 | 0.25 |
| 0.00011006 | 0.25 |
| 0.0001101 | 0.25 |
| 0.00011013 | 0.25 |
| 0.00011016 | 0.254 |
| 0.00011019 | 0.254 |
| 0.00011022 | 0.25 |
| 0.00011026 | 0.25 |
| 0.00011029 | 0.25 |
| 0.00011032 | 0.25 |
| 0.00011035 | 0.254 |
| 0.00011038 | 0.25 |
| 0.00011042 | 0.254 |
| 0.00011045 | 0.254 |
| 0.00011048 | 0.254 |
| 0.00011051 | 0.254 |
| 0.00011054 | 0.254 |
| 0.00011058 | 0.254 |
| 0.00011061 | 0.25 |
| 0.00011064 | 0.254 |
| 0.00011067 | 0.254 |
| 0.0001107 | 0.254 |
| 0.00011074 | 0.254 |
| 0.00011077 | 0.254 |
| 0.0001108 | 0.258 |
| 0.00011083 | 0.258 |
| 0.00011086 | 0.258 |
| 0.0001109 | 0.258 |
| 0.00011093 | 0.258 |
| 0.00011096 | 0.258 |
| 0.00011099 | 0.262 |
| 0.00011102 | 0.258 |
| 0.00011106 | 0.262 |
| 0.00011109 | 0.262 |
| 0.00011112 | 0.262 |
| 0.00011115 | 0.262 |
| 0.00011118 | 0.262 |
| 0.00011122 | 0.262 |
| 0.00011125 | 0.266 |
| 0.00011128 | 0.266 |
| 0.00011131 | 0.266 |
| 0.00011134 | 0.266 |
| 0.00011138 | 0.266 |
| 0.00011141 | 0.266 |
| 0.00011144 | 0.266 |
| 0.00011147 | 0.266 |
| 0.0001115 | 0.27 |
| 0.00011154 | 0.27 |
| 0.00011157 | 0.266 |
| 0.0001116 | 0.27 |
| 0.00011163 | 0.27 |
| 0.00011166 | 0.27 |
| 0.0001117 | 0.266 |
| 0.00011173 | 0.27 |
| 0.00011176 | 0.27 |
| 0.00011179 | 0.266 |
| 0.00011182 | 0.27 |
| 0.00011186 | 0.27 |
| 0.00011189 | 0.27 |
| 0.00011192 | 0.27 |
| 0.00011195 | 0.27 |
| 0.00011198 | 0.27 |
| 0.00011202 | 0.27 |
| 0.00011205 | 0.27 |
| 0.00011208 | 0.27 |
| 0.00011211 | 0.27 |
| 0.00011214 | 0.27 |
| 0.00011218 | 0.27 |
| 0.00011221 | 0.27 |
| 0.00011224 | 0.27 |
| 0.00011227 | 0.27 |
| 0.0001123 | 0.274 |
| 0.00011234 | 0.27 |
| 0.00011237 | 0.27 |
| 0.0001124 | 0.27 |
| 0.00011243 | 0.274 |
| 0.00011246 | 0.274 |
| 0.0001125 | 0.274 |
| 0.00011253 | 0.274 |
| 0.00011256 | 0.274 |
| 0.00011259 | 0.278 |
| 0.00011262 | 0.274 |
| 0.00011266 | 0.278 |
| 0.00011269 | 0.278 |
| 0.00011272 | 0.278 |
| 0.00011275 | 0.282 |
| 0.00011278 | 0.278 |
| 0.00011282 | 0.278 |
| 0.00011285 | 0.282 |
| 0.00011288 | 0.282 |
| 0.00011291 | 0.282 |
| 0.00011294 | 0.282 |
| 0.00011298 | 0.286 |
| 0.00011301 | 0.286 |
| 0.00011304 | 0.286 |
| 0.00011307 | 0.286 |
| 0.0001131 | 0.286 |
| 0.00011314 | 0.286 |
| 0.00011317 | 0.286 |
| 0.0001132 | 0.286 |
| 0.00011323 | 0.286 |
| 0.00011326 | 0.286 |
| 0.0001133 | 0.286 |
| 0.00011333 | 0.286 |
| 0.00011336 | 0.282 |
| 0.00011339 | 0.282 |
| 0.00011342 | 0.278 |
| 0.00011346 | 0.278 |
| 0.00011349 | 0.278 |
| 0.00011352 | 0.278 |
| 0.00011355 | 0.274 |
| 0.00011358 | 0.274 |
| 0.00011362 | 0.274 |
| 0.00011365 | 0.27 |
| 0.00011368 | 0.274 |
| 0.00011371 | 0.274 |
| 0.00011374 | 0.274 |
| 0.00011378 | 0.27 |
| 0.00011381 | 0.27 |
| 0.00011384 | 0.27 |
| 0.00011387 | 0.27 |
| 0.0001139 | 0.27 |
| 0.00011394 | 0.27 |
| 0.00011397 | 0.266 |
| 0.000114 | 0.27 |
| 0.00011403 | 0.27 |
| 0.00011406 | 0.27 |
| 0.0001141 | 0.27 |
| 0.00011413 | 0.27 |
| 0.00011416 | 0.27 |
| 0.00011419 | 0.266 |
| 0.00011422 | 0.27 |
| 0.00011426 | 0.266 |
| 0.00011429 | 0.266 |
| 0.00011432 | 0.266 |
| 0.00011435 | 0.27 |
| 0.00011438 | 0.266 |
| 0.00011442 | 0.266 |
| 0.00011445 | 0.266 |
| 0.00011448 | 0.266 |
| 0.00011451 | 0.266 |
| 0.00011454 | 0.266 |
| 0.00011458 | 0.266 |
| 0.00011461 | 0.266 |
| 0.00011464 | 0.266 |
| 0.00011467 | 0.27 |
| 0.0001147 | 0.266 |
| 0.00011474 | 0.266 |
| 0.00011477 | 0.266 |
| 0.0001148 | 0.266 |
| 0.00011483 | 0.266 |
| 0.00011486 | 0.266 |
| 0.0001149 | 0.266 |
| 0.00011493 | 0.27 |
| 0.00011496 | 0.266 |
| 0.00011499 | 0.266 |
| 0.00011502 | 0.27 |
| 0.00011506 | 0.266 |
| 0.00011509 | 0.27 |
| 0.00011512 | 0.27 |
| 0.00011515 | 0.27 |
| 0.00011518 | 0.27 |
| 0.00011522 | 0.27 |
| 0.00011525 | 0.266 |
| 0.00011528 | 0.27 |
| 0.00011531 | 0.27 |
| 0.00011534 | 0.27 |
| 0.00011538 | 0.27 |
| 0.00011541 | 0.27 |
| 0.00011544 | 0.27 |
| 0.00011547 | 0.27 |
| 0.0001155 | 0.27 |
| 0.00011554 | 0.27 |
| 0.00011557 | 0.27 |
| 0.0001156 | 0.27 |
| 0.00011563 | 0.27 |
| 0.00011566 | 0.27 |
| 0.0001157 | 0.274 |
| 0.00011573 | 0.274 |
| 0.00011576 | 0.274 |
| 0.00011579 | 0.274 |
| 0.00011582 | 0.274 |
| 0.00011586 | 0.274 |
| 0.00011589 | 0.278 |
| 0.00011592 | 0.278 |
| 0.00011595 | 0.274 |
| 0.00011598 | 0.278 |
| 0.00011602 | 0.278 |
| 0.00011605 | 0.278 |
| 0.00011608 | 0.282 |
| 0.00011611 | 0.278 |
| 0.00011614 | 0.278 |
| 0.00011618 | 0.278 |
| 0.00011621 | 0.282 |
| 0.00011624 | 0.282 |
| 0.00011627 | 0.282 |
| 0.0001163 | 0.286 |
| 0.00011634 | 0.282 |
| 0.00011637 | 0.282 |
| 0.0001164 | 0.282 |
| 0.00011643 | 0.282 |
| 0.00011646 | 0.282 |
| 0.0001165 | 0.286 |
| 0.00011653 | 0.286 |
| 0.00011656 | 0.286 |
| 0.00011659 | 0.286 |
| 0.00011662 | 0.286 |
| 0.00011666 | 0.286 |
| 0.00011669 | 0.286 |
| 0.00011672 | 0.286 |
| 0.00011675 | 0.286 |
| 0.00011678 | 0.286 |
| 0.00011682 | 0.286 |
| 0.00011685 | 0.286 |
| 0.00011688 | 0.29 |
| 0.00011691 | 0.286 |
| 0.00011694 | 0.286 |
| 0.00011698 | 0.29 |
| 0.00011701 | 0.29 |
| 0.00011704 | 0.29 |
| 0.00011707 | 0.286 |
| 0.0001171 | 0.286 |
| 0.00011714 | 0.286 |
| 0.00011717 | 0.29 |
| 0.0001172 | 0.286 |
| 0.00011723 | 0.286 |
| 0.00011726 | 0.286 |
| 0.0001173 | 0.286 |
| 0.00011733 | 0.286 |
| 0.00011736 | 0.286 |
| 0.00011739 | 0.286 |
| 0.00011742 | 0.286 |
| 0.00011746 | 0.286 |
| 0.00011749 | 0.286 |
| 0.00011752 | 0.286 |
| 0.00011755 | 0.286 |
| 0.00011758 | 0.286 |
| 0.00011762 | 0.282 |
| 0.00011765 | 0.286 |
| 0.00011768 | 0.282 |
| 0.00011771 | 0.282 |
| 0.00011774 | 0.282 |
| 0.00011778 | 0.282 |
| 0.00011781 | 0.282 |
| 0.00011784 | 0.286 |
| 0.00011787 | 0.282 |
| 0.0001179 | 0.282 |
| 0.00011794 | 0.278 |
| 0.00011797 | 0.278 |
| 0.000118 | 0.278 |
| 0.00011803 | 0.282 |
| 0.00011806 | 0.282 |
| 0.0001181 | 0.278 |
| 0.00011813 | 0.278 |
| 0.00011816 | 0.278 |
| 0.00011819 | 0.278 |
| 0.00011822 | 0.278 |
| 0.00011826 | 0.278 |
| 0.00011829 | 0.278 |
| 0.00011832 | 0.278 |
| 0.00011835 | 0.278 |
| 0.00011838 | 0.278 |
| 0.00011842 | 0.278 |
| 0.00011845 | 0.274 |
| 0.00011848 | 0.278 |
| 0.00011851 | 0.274 |
| 0.00011854 | 0.278 |
| 0.00011858 | 0.278 |
| 0.00011861 | 0.278 |
| 0.00011864 | 0.278 |
| 0.00011867 | 0.278 |
| 0.0001187 | 0.278 |
| 0.00011874 | 0.278 |
| 0.00011877 | 0.274 |
| 0.0001188 | 0.278 |
| 0.00011883 | 0.278 |
| 0.00011886 | 0.278 |
| 0.0001189 | 0.274 |
| 0.00011893 | 0.278 |
| 0.00011896 | 0.278 |
| 0.00011899 | 0.278 |
| 0.00011902 | 0.278 |
| 0.00011906 | 0.278 |
| 0.00011909 | 0.278 |
| 0.00011912 | 0.278 |
| 0.00011915 | 0.278 |
| 0.00011918 | 0.282 |
| 0.00011922 | 0.282 |
| 0.00011925 | 0.282 |
| 0.00011928 | 0.282 |
| 0.00011931 | 0.282 |
| 0.00011934 | 0.282 |
| 0.00011938 | 0.282 |
| 0.00011941 | 0.282 |
| 0.00011944 | 0.282 |
| 0.00011947 | 0.282 |
| 0.0001195 | 0.282 |
| 0.00011954 | 0.282 |
| 0.00011957 | 0.282 |
| 0.0001196 | 0.282 |
| 0.00011963 | 0.282 |
| 0.00011966 | 0.282 |
| 0.0001197 | 0.282 |
| 0.00011973 | 0.282 |
| 0.00011976 | 0.282 |
| 0.00011979 | 0.286 |
| 0.00011982 | 0.282 |
| 0.00011986 | 0.282 |
| 0.00011989 | 0.282 |
| 0.00011992 | 0.286 |
| 0.00011995 | 0.282 |
| 0.00011998 | 0.286 |
| 0.00012002 | 0.282 |
| 0.00012005 | 0.282 |
| 0.00012008 | 0.286 |
| 0.00012011 | 0.286 |
| 0.00012014 | 0.286 |
| 0.00012018 | 0.282 |
| 0.00012021 | 0.286 |
| 0.00012024 | 0.282 |
| 0.00012027 | 0.286 |
| 0.0001203 | 0.282 |
| 0.00012034 | 0.286 |
| 0.00012037 | 0.286 |
| 0.0001204 | 0.286 |
| 0.00012043 | 0.286 |
| 0.00012046 | 0.286 |
| 0.0001205 | 0.286 |
| 0.00012053 | 0.282 |
| 0.00012056 | 0.286 |
| 0.00012059 | 0.286 |
| 0.00012062 | 0.282 |
| 0.00012066 | 0.282 |
| 0.00012069 | 0.282 |
| 0.00012072 | 0.286 |
| 0.00012075 | 0.282 |
| 0.00012078 | 0.282 |
| 0.00012082 | 0.282 |
| 0.00012085 | 0.282 |
| 0.00012088 | 0.282 |
| 0.00012091 | 0.282 |
| 0.00012094 | 0.282 |
| 0.00012098 | 0.282 |
| 0.00012101 | 0.282 |
| 0.00012104 | 0.278 |
| 0.00012107 | 0.278 |
| 0.0001211 | 0.278 |
| 0.00012114 | 0.278 |
| 0.00012117 | 0.278 |
| 0.0001212 | 0.278 |
| 0.00012123 | 0.278 |
| 0.00012126 | 0.278 |
| 0.0001213 | 0.274 |
| 0.00012133 | 0.274 |
| 0.00012136 | 0.278 |
| 0.00012139 | 0.278 |
| 0.00012142 | 0.274 |
| 0.00012146 | 0.274 |
| 0.00012149 | 0.278 |
| 0.00012152 | 0.274 |
| 0.00012155 | 0.274 |
| 0.00012158 | 0.274 |
| 0.00012162 | 0.274 |
| 0.00012165 | 0.274 |
| 0.00012168 | 0.274 |
| 0.00012171 | 0.274 |
| 0.00012174 | 0.274 |
| 0.00012178 | 0.274 |
| 0.00012181 | 0.274 |
| 0.00012184 | 0.274 |
| 0.00012187 | 0.274 |
| 0.0001219 | 0.274 |
| 0.00012194 | 0.278 |
| 0.00012197 | 0.274 |
| 0.000122 | 0.274 |
| 0.00012203 | 0.274 |
| 0.00012206 | 0.274 |
| 0.0001221 | 0.274 |
| 0.00012213 | 0.274 |
| 0.00012216 | 0.274 |
| 0.00012219 | 0.274 |
| 0.00012222 | 0.274 |
| 0.00012226 | 0.274 |
| 0.00012229 | 0.274 |
| 0.00012232 | 0.274 |
| 0.00012235 | 0.274 |
| 0.00012238 | 0.274 |
| 0.00012242 | 0.274 |
| 0.00012245 | 0.27 |
| 0.00012248 | 0.274 |
| 0.00012251 | 0.274 |
| 0.00012254 | 0.274 |
| 0.00012258 | 0.274 |
| 0.00012261 | 0.274 |
| 0.00012264 | 0.274 |
| 0.00012267 | 0.274 |
| 0.0001227 | 0.274 |
| 0.00012274 | 0.274 |
| 0.00012277 | 0.274 |
| 0.0001228 | 0.274 |
| 0.00012283 | 0.274 |
| 0.00012286 | 0.274 |
| 0.0001229 | 0.278 |
| 0.00012293 | 0.274 |
| 0.00012296 | 0.274 |
| 0.00012299 | 0.278 |
| 0.00012302 | 0.278 |
| 0.00012306 | 0.278 |
| 0.00012309 | 0.274 |
| 0.00012312 | 0.278 |
| 0.00012315 | 0.278 |
| 0.00012318 | 0.278 |
| 0.00012322 | 0.278 |
| 0.00012325 | 0.278 |
| 0.00012328 | 0.278 |
| 0.00012331 | 0.278 |
| 0.00012334 | 0.278 |
| 0.00012338 | 0.278 |
| 0.00012341 | 0.278 |
| 0.00012344 | 0.278 |
| 0.00012347 | 0.278 |
| 0.0001235 | 0.278 |
| 0.00012354 | 0.278 |
| 0.00012357 | 0.278 |
| 0.0001236 | 0.278 |
| 0.00012363 | 0.278 |
| 0.00012366 | 0.278 |
| 0.0001237 | 0.278 |
| 0.00012373 | 0.278 |
| 0.00012376 | 0.278 |
| 0.00012379 | 0.278 |
| 0.00012382 | 0.278 |
| 0.00012386 | 0.278 |
| 0.00012389 | 0.278 |
| 0.00012392 | 0.278 |
| 0.00012395 | 0.278 |
| 0.00012398 | 0.278 |
| 0.00012402 | 0.278 |
| 0.00012405 | 0.278 |
| 0.00012408 | 0.278 |
| 0.00012411 | 0.278 |
| 0.00012414 | 0.278 |
| 0.00012418 | 0.278 |
| 0.00012421 | 0.278 |
| 0.00012424 | 0.278 |
| 0.00012427 | 0.278 |
| 0.0001243 | 0.278 |
| 0.00012434 | 0.278 |
| 0.00012437 | 0.278 |
| 0.0001244 | 0.274 |
| 0.00012443 | 0.278 |
| 0.00012446 | 0.274 |
| 0.0001245 | 0.278 |
| 0.00012453 | 0.274 |
| 0.00012456 | 0.274 |
| 0.00012459 | 0.278 |
| 0.00012462 | 0.278 |
| 0.00012466 | 0.274 |
| 0.00012469 | 0.278 |
| 0.00012472 | 0.274 |
| 0.00012475 | 0.274 |
| 0.00012478 | 0.278 |
| 0.00012482 | 0.274 |
| 0.00012485 | 0.274 |
| 0.00012488 | 0.274 |
| 0.00012491 | 0.274 |
| 0.00012494 | 0.274 |
| 0.00012498 | 0.274 |
| 0.00012501 | 0.274 |
| 0.00012504 | 0.274 |
| 0.00012507 | 0.274 |
| 0.0001251 | 0.274 |
| 0.00012514 | 0.274 |
| 0.00012517 | 0.274 |
| 0.0001252 | 0.274 |
| 0.00012523 | 0.27 |
| 0.00012526 | 0.274 |
| 0.0001253 | 0.274 |
| 0.00012533 | 0.274 |
| 0.00012536 | 0.274 |
| 0.00012539 | 0.274 |
| 0.00012542 | 0.274 |
| 0.00012546 | 0.274 |
| 0.00012549 | 0.274 |
| 0.00012552 | 0.274 |
| 0.00012555 | 0.27 |
| 0.00012558 | 0.274 |
| 0.00012562 | 0.274 |
| 0.00012565 | 0.274 |
| 0.00012568 | 0.274 |
| 0.00012571 | 0.274 |
| 0.00012574 | 0.274 |
| 0.00012578 | 0.274 |
| 0.00012581 | 0.27 |
| 0.00012584 | 0.274 |
| 0.00012587 | 0.274 |
| 0.0001259 | 0.274 |
| 0.00012594 | 0.274 |
| 0.00012597 | 0.27 |
| 0.000126 | 0.274 |
| 0.00012603 | 0.274 |
| 0.00012606 | 0.274 |
| 0.0001261 | 0.274 |
| 0.00012613 | 0.274 |
| 0.00012616 | 0.274 |
| 0.00012619 | 0.278 |
| 0.00012622 | 0.278 |
| 0.00012626 | 0.278 |
| 0.00012629 | 0.274 |
| 0.00012632 | 0.278 |
| 0.00012635 | 0.278 |
| 0.00012638 | 0.278 |
| 0.00012642 | 0.274 |
| 0.00012645 | 0.274 |
| 0.00012648 | 0.278 |
| 0.00012651 | 0.274 |
| 0.00012654 | 0.278 |
| 0.00012658 | 0.274 |
| 0.00012661 | 0.274 |
| 0.00012664 | 0.278 |
| 0.00012667 | 0.278 |
| 0.0001267 | 0.274 |
| 0.00012674 | 0.274 |
| 0.00012677 | 0.274 |
| 0.0001268 | 0.274 |
| 0.00012683 | 0.274 |
| 0.00012686 | 0.278 |
| 0.0001269 | 0.278 |
| 0.00012693 | 0.274 |
| 0.00012696 | 0.274 |
| 0.00012699 | 0.278 |
| 0.00012702 | 0.274 |
| 0.00012706 | 0.278 |
| 0.00012709 | 0.274 |
| 0.00012712 | 0.274 |
| 0.00012715 | 0.274 |
| 0.00012718 | 0.274 |
| 0.00012722 | 0.274 |
| 0.00012725 | 0.274 |
| 0.00012728 | 0.27 |
| 0.00012731 | 0.274 |
| 0.00012734 | 0.27 |
| 0.00012738 | 0.27 |
| 0.00012741 | 0.27 |
| 0.00012744 | 0.27 |
| 0.00012747 | 0.27 |
| 0.0001275 | 0.27 |
| 0.00012754 | 0.27 |
| 0.00012757 | 0.27 |
| 0.0001276 | 0.27 |
| 0.00012763 | 0.27 |
| 0.00012766 | 0.27 |
| 0.0001277 | 0.266 |
| 0.00012773 | 0.27 |
| 0.00012776 | 0.266 |
| 0.00012779 | 0.266 |
| 0.00012782 | 0.266 |
| 0.00012786 | 0.266 |
| 0.00012789 | 0.266 |
| 0.00012792 | 0.266 |
| 0.00012795 | 0.266 |
| 0.00012798 | 0.266 |
| 0.00012802 | 0.266 |
| 0.00012805 | 0.266 |
| 0.00012808 | 0.262 |
| 0.00012811 | 0.262 |
| 0.00012814 | 0.262 |
| 0.00012818 | 0.266 |
| 0.00012821 | 0.266 |
| 0.00012824 | 0.262 |
| 0.00012827 | 0.266 |
| 0.0001283 | 0.262 |
| 0.00012834 | 0.262 |
| 0.00012837 | 0.262 |
| 0.0001284 | 0.262 |
| 0.00012843 | 0.262 |
| 0.00012846 | 0.266 |
| 0.0001285 | 0.262 |
| 0.00012853 | 0.266 |
| 0.00012856 | 0.262 |
| 0.00012859 | 0.262 |
| 0.00012862 | 0.262 |
| 0.00012866 | 0.262 |
| 0.00012869 | 0.262 |
| 0.00012872 | 0.262 |
| 0.00012875 | 0.262 |
| 0.00012878 | 0.262 |
| 0.00012882 | 0.266 |
| 0.00012885 | 0.266 |
| 0.00012888 | 0.262 |
| 0.00012891 | 0.266 |
| 0.00012894 | 0.266 |
| 0.00012898 | 0.266 |
| 0.00012901 | 0.266 |
| 0.00012904 | 0.266 |
| 0.00012907 | 0.266 |
| 0.0001291 | 0.266 |
| 0.00012914 | 0.27 |
| 0.00012917 | 0.266 |
| 0.0001292 | 0.266 |
| 0.00012923 | 0.266 |
| 0.00012926 | 0.266 |
| 0.0001293 | 0.266 |
| 0.00012933 | 0.266 |
| 0.00012936 | 0.266 |
| 0.00012939 | 0.27 |
| 0.00012942 | 0.27 |
| 0.00012946 | 0.27 |
| 0.00012949 | 0.27 |
| 0.00012952 | 0.27 |
| 0.00012955 | 0.27 |
| 0.00012958 | 0.266 |
| 0.00012962 | 0.27 |
| 0.00012965 | 0.27 |
| 0.00012968 | 0.27 |
| 0.00012971 | 0.27 |
| 0.00012974 | 0.27 |
| 0.00012978 | 0.27 |
| 0.00012981 | 0.27 |
| 0.00012984 | 0.27 |
| 0.00012987 | 0.27 |
| 0.0001299 | 0.27 |
| 0.00012994 | 0.27 |
| 0.00012997 | 0.27 |
| 0.00013 | 0.266 |
| 0.00013003 | 0.27 |
| 0.00013006 | 0.27 |
| 0.0001301 | 0.27 |
| 0.00013013 | 0.27 |
| 0.00013016 | 0.27 |
| 0.00013019 | 0.266 |
| 0.00013022 | 0.27 |
| 0.00013026 | 0.27 |
| 0.00013029 | 0.27 |
| 0.00013032 | 0.27 |
| 0.00013035 | 0.27 |
| 0.00013038 | 0.27 |
| 0.00013042 | 0.27 |
| 0.00013045 | 0.27 |
| 0.00013048 | 0.27 |
| 0.00013051 | 0.27 |
| 0.00013054 | 0.266 |
| 0.00013057999999999999 | 0.27 |
| 0.00013061 | 0.266 |
| 0.00013064 | 0.27 |
| 0.00013067 | 0.266 |
| 0.0001307 | 0.266 |
| 0.00013074 | 0.266 |
| 0.00013077 | 0.266 |
| 0.0001308 | 0.266 |
| 0.00013083 | 0.266 |
| 0.00013086 | 0.266 |
| 0.0001309 | 0.266 |
| 0.00013093 | 0.266 |
| 0.00013096 | 0.262 |
| 0.00013099 | 0.266 |
| 0.00013102 | 0.266 |
| 0.00013106 | 0.266 |
| 0.00013109 | 0.262 |
| 0.00013112 | 0.262 |
| 0.00013115 | 0.262 |
| 0.00013118 | 0.266 |
| 0.00013122 | 0.262 |
| 0.00013125 | 0.262 |
| 0.00013128 | 0.262 |
| 0.00013131 | 0.262 |
| 0.00013134 | 0.262 |
| 0.00013138 | 0.262 |
| 0.00013141 | 0.262 |
| 0.00013144 | 0.262 |
| 0.00013147 | 0.258 |
| 0.0001315 | 0.258 |
| 0.00013154 | 0.258 |
| 0.00013157 | 0.258 |
| 0.0001316 | 0.262 |
| 0.00013163 | 0.258 |
| 0.00013166 | 0.262 |
| 0.0001317 | 0.258 |
| 0.00013173 | 0.258 |
| 0.00013176 | 0.258 |
| 0.00013179 | 0.258 |
| 0.00013182 | 0.258 |
| 0.00013186 | 0.262 |
| 0.00013189 | 0.258 |
| 0.00013192 | 0.258 |
| 0.00013195 | 0.254 |
| 0.00013198 | 0.258 |
| 0.00013202 | 0.258 |
| 0.00013205 | 0.258 |
| 0.00013208 | 0.254 |
| 0.00013211 | 0.258 |
| 0.00013214 | 0.258 |
| 0.00013218 | 0.258 |
| 0.00013221 | 0.258 |
| 0.00013224 | 0.258 |
| 0.00013227 | 0.258 |
| 0.0001323 | 0.258 |
| 0.00013234 | 0.258 |
| 0.00013237 | 0.258 |
| 0.0001324 | 0.258 |
| 0.00013243 | 0.258 |
| 0.00013246 | 0.258 |
| 0.0001325 | 0.258 |
| 0.00013253 | 0.258 |
| 0.00013256 | 0.258 |
| 0.00013259 | 0.258 |
| 0.00013262 | 0.258 |
| 0.00013266 | 0.262 |
| 0.00013269 | 0.258 |
| 0.00013272 | 0.258 |
| 0.00013275 | 0.262 |
| 0.00013278 | 0.262 |
| 0.00013282 | 0.262 |
| 0.00013285 | 0.258 |
| 0.00013288 | 0.262 |
| 0.00013291 | 0.262 |
| 0.00013294 | 0.266 |
| 0.00013298 | 0.262 |
| 0.00013301 | 0.266 |
| 0.00013304 | 0.262 |
| 0.00013307 | 0.262 |
| 0.0001331 | 0.262 |
| 0.00013314 | 0.266 |
| 0.00013317 | 0.262 |
| 0.0001332 | 0.262 |
| 0.00013323 | 0.262 |
| 0.00013326 | 0.262 |
| 0.0001333 | 0.262 |
| 0.00013333 | 0.266 |
| 0.00013336 | 0.266 |
| 0.00013339 | 0.262 |
| 0.00013342 | 0.266 |
| 0.00013346 | 0.266 |
| 0.00013349 | 0.266 |
| 0.00013352 | 0.262 |
| 0.00013355 | 0.266 |
| 0.00013358 | 0.266 |
| 0.00013362 | 0.266 |
| 0.00013365 | 0.266 |
| 0.00013368 | 0.266 |
| 0.00013371 | 0.266 |
| 0.00013374 | 0.266 |
| 0.00013378 | 0.266 |
| 0.00013381 | 0.266 |
| 0.00013384 | 0.266 |
| 0.00013387 | 0.266 |
| 0.0001339 | 0.266 |
| 0.00013394 | 0.266 |
| 0.00013397 | 0.266 |
| 0.000134 | 0.262 |
| 0.00013403 | 0.262 |
| 0.00013406 | 0.262 |
| 0.0001341 | 0.266 |
| 0.00013413 | 0.266 |
| 0.00013416 | 0.262 |
| 0.00013419 | 0.266 |
| 0.00013422 | 0.262 |
| 0.00013426 | 0.262 |
| 0.00013429 | 0.266 |
| 0.00013432 | 0.262 |
| 0.00013435 | 0.262 |
| 0.00013438 | 0.262 |
| 0.00013442 | 0.262 |
| 0.00013445 | 0.262 |
| 0.00013448 | 0.262 |
| 0.00013451 | 0.262 |
| 0.00013454 | 0.262 |
| 0.00013458 | 0.258 |
| 0.00013461 | 0.258 |
| 0.00013464 | 0.258 |
| 0.00013467 | 0.258 |
| 0.0001347 | 0.258 |
| 0.00013474 | 0.258 |
| 0.00013477 | 0.254 |
| 0.0001348 | 0.254 |
| 0.00013483 | 0.254 |
| 0.00013486 | 0.254 |
| 0.0001349 | 0.254 |
| 0.00013493 | 0.254 |
| 0.00013496 | 0.254 |
| 0.00013499 | 0.254 |
| 0.00013502 | 0.25 |
| 0.00013506 | 0.25 |
| 0.00013509 | 0.25 |
| 0.00013512 | 0.25 |
| 0.00013515 | 0.25 |
| 0.00013518 | 0.25 |
| 0.00013522 | 0.25 |
| 0.00013525 | 0.246 |
| 0.00013528 | 0.25 |
| 0.00013531 | 0.25 |
| 0.00013534 | 0.246 |
| 0.00013538 | 0.246 |
| 0.00013541 | 0.246 |
| 0.00013544 | 0.246 |
| 0.00013547 | 0.246 |
| 0.0001355 | 0.246 |
| 0.00013554 | 0.246 |
| 0.00013557 | 0.246 |
| 0.0001356 | 0.246 |
| 0.00013563 | 0.246 |
| 0.00013566 | 0.246 |
| 0.0001357 | 0.246 |
| 0.00013573 | 0.246 |
| 0.00013576 | 0.246 |
| 0.00013579 | 0.246 |
| 0.00013582 | 0.246 |
| 0.00013586 | 0.246 |
| 0.00013589 | 0.246 |
| 0.00013592 | 0.246 |
| 0.00013595 | 0.246 |
| 0.00013598 | 0.246 |
| 0.00013602 | 0.246 |
| 0.00013605 | 0.246 |
| 0.00013608 | 0.246 |
| 0.00013611 | 0.246 |
| 0.00013614 | 0.246 |
| 0.00013618 | 0.246 |
| 0.00013621 | 0.25 |
| 0.00013624 | 0.25 |
| 0.00013627 | 0.25 |
| 0.0001363 | 0.25 |
| 0.00013634 | 0.254 |
| 0.00013637 | 0.25 |
| 0.0001364 | 0.25 |
| 0.00013643 | 0.254 |
| 0.00013646 | 0.254 |
| 0.0001365 | 0.254 |
| 0.00013653 | 0.25 |
| 0.00013656 | 0.254 |
| 0.00013659 | 0.254 |
| 0.00013662 | 0.254 |
| 0.00013666 | 0.254 |
| 0.00013669 | 0.254 |
| 0.00013672 | 0.254 |
| 0.00013675 | 0.254 |
| 0.00013678 | 0.254 |
| 0.00013682 | 0.258 |
| 0.00013685 | 0.258 |
| 0.00013688 | 0.258 |
| 0.00013691 | 0.258 |
| 0.00013694 | 0.258 |
| 0.00013698 | 0.258 |
| 0.00013701 | 0.258 |
| 0.00013704 | 0.258 |
| 0.00013707 | 0.258 |
| 0.0001371 | 0.262 |
| 0.00013714 | 0.262 |
| 0.00013717 | 0.258 |
| 0.0001372 | 0.262 |
| 0.00013723 | 0.258 |
| 0.00013726 | 0.262 |
| 0.0001373 | 0.262 |
| 0.00013733 | 0.258 |
| 0.00013736 | 0.258 |
| 0.00013739 | 0.258 |
| 0.00013742 | 0.262 |
| 0.00013746 | 0.258 |
| 0.00013749 | 0.262 |
| 0.00013752 | 0.262 |
| 0.00013755 | 0.258 |
| 0.00013758 | 0.262 |
| 0.00013762 | 0.262 |
| 0.00013765 | 0.262 |
| 0.00013768 | 0.262 |
| 0.00013771 | 0.258 |
| 0.00013774 | 0.262 |
| 0.00013778 | 0.262 |
| 0.00013781 | 0.258 |
| 0.00013784 | 0.258 |
| 0.00013787 | 0.258 |
| 0.0001379 | 0.258 |
| 0.00013794 | 0.258 |
| 0.00013797 | 0.254 |
| 0.000138 | 0.258 |
| 0.00013803 | 0.258 |
| 0.00013806 | 0.254 |
| 0.0001381 | 0.258 |
| 0.00013813 | 0.258 |
| 0.00013816 | 0.258 |
| 0.00013819 | 0.258 |
| 0.00013822 | 0.254 |
| 0.00013826 | 0.254 |
| 0.00013829 | 0.254 |
| 0.00013832 | 0.254 |
| 0.00013835 | 0.254 |
| 0.00013838 | 0.254 |
| 0.00013842 | 0.254 |
| 0.00013845 | 0.254 |
| 0.00013848 | 0.254 |
| 0.00013851 | 0.254 |
| 0.00013854 | 0.254 |
| 0.00013858 | 0.254 |
| 0.00013861 | 0.25 |
| 0.00013864 | 0.254 |
| 0.00013867 | 0.254 |
| 0.0001387 | 0.254 |
| 0.00013874 | 0.25 |
| 0.00013877 | 0.25 |
| 0.0001388 | 0.254 |
| 0.00013883 | 0.254 |
| 0.00013886 | 0.254 |
| 0.0001389 | 0.25 |
| 0.00013893 | 0.25 |
| 0.00013896 | 0.254 |
| 0.00013899 | 0.254 |
| 0.00013902 | 0.25 |
| 0.00013906 | 0.25 |
| 0.00013909 | 0.25 |
| 0.00013912 | 0.25 |
| 0.00013915 | 0.254 |
| 0.00013918 | 0.25 |
| 0.00013922 | 0.254 |
| 0.00013925 | 0.254 |
| 0.00013928 | 0.25 |
| 0.00013931 | 0.254 |
| 0.00013934 | 0.254 |
| 0.00013938 | 0.254 |
| 0.00013941 | 0.254 |
| 0.00013944 | 0.254 |
| 0.00013947 | 0.254 |
| 0.0001395 | 0.254 |
| 0.00013954 | 0.254 |
| 0.00013957 | 0.258 |
| 0.0001396 | 0.258 |
| 0.00013963 | 0.258 |
| 0.00013966 | 0.258 |
| 0.0001397 | 0.258 |
| 0.00013973 | 0.258 |
| 0.00013976 | 0.262 |
| 0.00013979 | 0.262 |
| 0.00013982 | 0.262 |
| 0.00013986 | 0.262 |
| 0.00013989 | 0.262 |
| 0.00013992 | 0.262 |
| 0.00013995 | 0.266 |
| 0.00013998 | 0.266 |
| 0.00014002 | 0.262 |
| 0.00014005 | 0.266 |
| 0.00014008 | 0.266 |
| 0.00014011 | 0.266 |
| 0.00014014 | 0.266 |
| 0.00014018 | 0.266 |
| 0.00014021 | 0.266 |
| 0.00014024 | 0.266 |
| 0.00014027 | 0.266 |
| 0.0001403 | 0.266 |
| 0.00014034 | 0.266 |
| 0.00014037 | 0.262 |
| 0.0001404 | 0.262 |
| 0.00014043 | 0.262 |
| 0.00014046 | 0.262 |
| 0.0001405 | 0.262 |
| 0.00014053 | 0.262 |
| 0.00014056 | 0.262 |
| 0.00014059 | 0.262 |
| 0.00014062 | 0.262 |
| 0.00014066 | 0.262 |
| 0.00014069 | 0.262 |
| 0.00014072 | 0.258 |
| 0.00014075 | 0.266 |
| 0.00014078 | 0.262 |
| 0.00014082 | 0.262 |
| 0.00014085 | 0.262 |
| 0.00014088 | 0.266 |
| 0.00014091 | 0.262 |
| 0.00014094 | 0.262 |
| 0.00014098 | 0.262 |
| 0.00014101 | 0.262 |
| 0.00014104 | 0.262 |
| 0.00014107 | 0.262 |
| 0.0001411 | 0.262 |
| 0.00014114 | 0.262 |
| 0.00014117 | 0.262 |
| 0.0001412 | 0.266 |
| 0.00014123 | 0.262 |
| 0.00014126 | 0.266 |
| 0.0001413 | 0.262 |
| 0.00014133 | 0.266 |
| 0.00014136 | 0.266 |
| 0.00014139 | 0.262 |
| 0.00014142 | 0.266 |
| 0.00014146 | 0.266 |
| 0.00014149 | 0.266 |
| 0.00014152 | 0.266 |
| 0.00014155 | 0.266 |
| 0.00014158 | 0.266 |
| 0.00014162 | 0.266 |
| 0.00014165 | 0.266 |
| 0.00014168 | 0.266 |
| 0.00014171 | 0.27 |
| 0.00014174 | 0.27 |
| 0.00014178 | 0.27 |
| 0.00014181 | 0.27 |
| 0.00014184 | 0.27 |
| 0.00014187 | 0.266 |
| 0.0001419 | 0.266 |
| 0.00014194 | 0.27 |
| 0.00014197 | 0.27 |
| 0.000142 | 0.27 |
| 0.00014203 | 0.27 |
| 0.00014206 | 0.27 |
| 0.0001421 | 0.27 |
| 0.00014213 | 0.27 |
| 0.00014216 | 0.27 |
| 0.00014219 | 0.27 |
| 0.00014222 | 0.27 |
| 0.00014226 | 0.27 |
| 0.00014229 | 0.27 |
| 0.00014232 | 0.27 |
| 0.00014235 | 0.274 |
| 0.00014238 | 0.27 |
| 0.00014242 | 0.27 |
| 0.00014245 | 0.27 |
| 0.00014248 | 0.27 |
| 0.00014251 | 0.27 |
| 0.00014254 | 0.27 |
| 0.00014258 | 0.27 |
| 0.00014261 | 0.27 |
| 0.00014264 | 0.27 |
| 0.00014267 | 0.27 |
| 0.0001427 | 0.27 |
| 0.00014274 | 0.27 |
| 0.00014277 | 0.27 |
| 0.0001428 | 0.266 |
| 0.00014283 | 0.27 |
| 0.00014286 | 0.27 |
| 0.0001429 | 0.266 |
| 0.00014293 | 0.266 |
| 0.00014296 | 0.262 |
| 0.00014299 | 0.262 |
| 0.00014302 | 0.262 |
| 0.00014306 | 0.262 |
| 0.00014309 | 0.262 |
| 0.00014312 | 0.258 |
| 0.00014315 | 0.258 |
| 0.00014318 | 0.258 |
| 0.00014322 | 0.258 |
| 0.00014325 | 0.258 |
| 0.00014328 | 0.258 |
| 0.00014331 | 0.258 |
| 0.00014334 | 0.254 |
| 0.00014338 | 0.258 |
| 0.00014341 | 0.258 |
| 0.00014344 | 0.254 |
| 0.00014347 | 0.258 |
| 0.0001435 | 0.254 |
| 0.00014354 | 0.254 |
| 0.00014357 | 0.254 |
| 0.0001436 | 0.254 |
| 0.00014363 | 0.254 |
| 0.00014366 | 0.254 |
| 0.0001437 | 0.254 |
| 0.00014373 | 0.254 |
| 0.00014376 | 0.254 |
| 0.00014379 | 0.25 |
| 0.00014382 | 0.254 |
| 0.00014386 | 0.254 |
| 0.00014389 | 0.254 |
| 0.00014392 | 0.254 |
| 0.00014395 | 0.254 |
| 0.00014398 | 0.25 |
| 0.00014402 | 0.254 |
| 0.00014405 | 0.254 |
| 0.00014408 | 0.254 |
| 0.00014411 | 0.254 |
| 0.00014414 | 0.25 |
| 0.00014418 | 0.25 |
| 0.00014421 | 0.254 |
| 0.00014424 | 0.254 |
| 0.00014427 | 0.254 |
| 0.0001443 | 0.254 |
| 0.00014434 | 0.254 |
| 0.00014437 | 0.254 |
| 0.0001444 | 0.254 |
| 0.00014443 | 0.254 |
| 0.00014446 | 0.254 |
| 0.0001445 | 0.254 |
| 0.00014453 | 0.254 |
| 0.00014456 | 0.254 |
| 0.00014459 | 0.254 |
| 0.00014462 | 0.254 |
| 0.00014466 | 0.254 |
| 0.00014469 | 0.258 |
| 0.00014472 | 0.254 |
| 0.00014475 | 0.254 |
| 0.00014478 | 0.258 |
| 0.00014482 | 0.254 |
| 0.00014485 | 0.258 |
| 0.00014488 | 0.258 |
| 0.00014491 | 0.262 |
| 0.00014494 | 0.258 |
| 0.00014498 | 0.258 |
| 0.00014501 | 0.258 |
| 0.00014504 | 0.258 |
| 0.00014507 | 0.262 |
| 0.0001451 | 0.258 |
| 0.00014514 | 0.262 |
| 0.00014517 | 0.262 |
| 0.0001452 | 0.266 |
| 0.00014523 | 0.262 |
| 0.00014526 | 0.262 |
| 0.0001453 | 0.266 |
| 0.00014533 | 0.266 |
| 0.00014536 | 0.27 |
| 0.00014539 | 0.27 |
| 0.00014542 | 0.27 |
| 0.00014546 | 0.27 |
| 0.00014549 | 0.27 |
| 0.00014552 | 0.274 |
| 0.00014555 | 0.274 |
| 0.00014558 | 0.27 |
| 0.00014562 | 0.27 |
| 0.00014565 | 0.27 |
| 0.00014568 | 0.27 |
| 0.00014571 | 0.274 |
| 0.00014574 | 0.27 |
| 0.00014578 | 0.27 |
| 0.00014581 | 0.27 |
| 0.00014584 | 0.27 |
| 0.00014587 | 0.27 |
| 0.0001459 | 0.274 |
| 0.00014594 | 0.27 |
| 0.00014597 | 0.27 |
| 0.000146 | 0.27 |
| 0.00014603 | 0.27 |
| 0.00014606 | 0.27 |
| 0.0001461 | 0.27 |
| 0.00014613 | 0.27 |
| 0.00014616 | 0.27 |
| 0.00014619 | 0.266 |
| 0.00014622 | 0.266 |
| 0.00014626 | 0.27 |
| 0.00014629 | 0.266 |
| 0.00014632 | 0.266 |
| 0.00014635 | 0.266 |
| 0.00014638 | 0.266 |
| 0.00014642 | 0.266 |
| 0.00014645 | 0.266 |
| 0.00014648 | 0.266 |
| 0.00014651 | 0.266 |
| 0.00014654 | 0.262 |
| 0.00014658 | 0.262 |
| 0.00014661 | 0.262 |
| 0.00014664 | 0.262 |
| 0.00014667 | 0.262 |
| 0.0001467 | 0.258 |
| 0.00014674 | 0.258 |
| 0.00014677 | 0.258 |
| 0.0001468 | 0.258 |
| 0.00014683 | 0.258 |
| 0.00014686 | 0.258 |
| 0.0001469 | 0.258 |
| 0.00014693 | 0.258 |
| 0.00014696 | 0.258 |
| 0.00014699 | 0.258 |
| 0.00014702 | 0.254 |
| 0.00014706 | 0.258 |
| 0.00014709 | 0.254 |
| 0.00014712 | 0.254 |
| 0.00014715 | 0.254 |
| 0.00014718 | 0.254 |
| 0.00014722 | 0.254 |
| 0.00014725 | 0.254 |
| 0.00014728 | 0.254 |
| 0.00014731 | 0.25 |
| 0.00014734 | 0.254 |
| 0.00014738 | 0.254 |
| 0.00014741 | 0.254 |
| 0.00014744 | 0.254 |
| 0.00014747 | 0.254 |
| 0.0001475 | 0.254 |
| 0.00014754 | 0.254 |
| 0.00014757 | 0.254 |
| 0.0001476 | 0.254 |
| 0.00014763 | 0.258 |
| 0.00014766 | 0.254 |
| 0.0001477 | 0.254 |
| 0.00014773 | 0.254 |
| 0.00014776 | 0.258 |
| 0.00014779 | 0.254 |
| 0.00014782 | 0.254 |
| 0.00014786 | 0.254 |
| 0.00014789 | 0.258 |
| 0.00014792 | 0.258 |
| 0.00014795 | 0.254 |
| 0.00014798 | 0.258 |
| 0.00014802 | 0.258 |
| 0.00014805 | 0.258 |
| 0.00014808 | 0.258 |
| 0.00014811 | 0.258 |
| 0.00014814 | 0.258 |
| 0.00014818 | 0.258 |
| 0.00014821 | 0.258 |
| 0.00014824 | 0.258 |
| 0.00014827 | 0.262 |
| 0.0001483 | 0.262 |
| 0.00014834 | 0.262 |
| 0.00014837 | 0.258 |
| 0.0001484 | 0.262 |
| 0.00014843 | 0.258 |
| 0.00014846 | 0.262 |
| 0.0001485 | 0.262 |
| 0.00014853 | 0.262 |
| 0.00014856 | 0.258 |
| 0.00014859 | 0.262 |
| 0.00014862 | 0.262 |
| 0.00014866 | 0.262 |
| 0.00014869 | 0.262 |
| 0.00014872 | 0.262 |
| 0.00014875 | 0.262 |
| 0.00014878 | 0.262 |
| 0.00014882 | 0.262 |
| 0.00014885 | 0.266 |
| 0.00014888 | 0.266 |
| 0.00014891 | 0.266 |
| 0.00014894 | 0.27 |
| 0.00014898 | 0.266 |
| 0.00014901 | 0.266 |
| 0.00014904 | 0.266 |
| 0.00014907 | 0.266 |
| 0.0001491 | 0.266 |
| 0.00014914 | 0.27 |
| 0.00014917 | 0.266 |
| 0.0001492 | 0.27 |
| 0.00014923 | 0.266 |
| 0.00014926 | 0.27 |
| 0.0001493 | 0.27 |
| 0.00014933 | 0.266 |
| 0.00014936 | 0.266 |
| 0.00014939 | 0.266 |
| 0.00014942 | 0.266 |
| 0.00014946 | 0.266 |
| 0.00014949 | 0.266 |
| 0.00014952 | 0.27 |
| 0.00014955 | 0.27 |
| 0.00014958 | 0.266 |
| 0.00014962 | 0.266 |
| 0.00014965 | 0.266 |
| 0.00014968 | 0.27 |
| 0.00014971 | 0.266 |
| 0.00014974 | 0.266 |
| 0.00014978 | 0.27 |
| 0.00014981 | 0.27 |
| 0.00014984 | 0.27 |
| 0.00014987 | 0.266 |
| 0.0001499 | 0.27 |
| 0.00014994 | 0.27 |
| 0.00014997 | 0.266 |
| 0.00015 | 0.266 |
| 0.00015003 | 0.27 |
| 0.00015006 | 0.266 |
| 0.0001501 | 0.266 |
| 0.00015013 | 0.266 |
| 0.00015016 | 0.266 |
| 0.00015019 | 0.266 |
| 0.00015022 | 0.266 |
| 0.00015026 | 0.266 |
| 0.00015029 | 0.266 |
| 0.00015032 | 0.27 |
| 0.00015035 | 0.27 |
| 0.00015038 | 0.27 |
| 0.00015042 | 0.266 |
| 0.00015045 | 0.266 |
| 0.00015048 | 0.266 |
| 0.00015051 | 0.27 |
| 0.00015054 | 0.27 |
| 0.00015058 | 0.27 |
| 0.00015061 | 0.266 |
| 0.00015064 | 0.27 |
| 0.00015067 | 0.27 |
| 0.0001507 | 0.27 |
| 0.00015074 | 0.266 |
| 0.00015077 | 0.27 |
| 0.0001508 | 0.27 |
| 0.00015083 | 0.266 |
| 0.00015086 | 0.27 |
| 0.0001509 | 0.27 |
| 0.00015093 | 0.27 |
| 0.00015096 | 0.266 |
| 0.00015099 | 0.266 |
| 0.00015102 | 0.266 |
| 0.00015106 | 0.27 |
| 0.00015109 | 0.27 |
| 0.00015112 | 0.266 |
| 0.00015115 | 0.27 |
| 0.00015118 | 0.27 |
| 0.00015122 | 0.266 |
| 0.00015125 | 0.27 |
| 0.00015128 | 0.266 |
| 0.00015131 | 0.27 |
| 0.00015134 | 0.266 |
| 0.00015138 | 0.27 |
| 0.00015141 | 0.266 |
| 0.00015144 | 0.27 |
| 0.00015147 | 0.266 |
| 0.0001515 | 0.27 |
| 0.00015154 | 0.27 |
| 0.00015157 | 0.266 |
| 0.0001516 | 0.27 |
| 0.00015163 | 0.266 |
| 0.00015166 | 0.27 |
| 0.0001517 | 0.27 |
| 0.00015173 | 0.27 |
| 0.00015176 | 0.27 |
| 0.00015179 | 0.27 |
| 0.00015182 | 0.27 |
| 0.00015186 | 0.27 |
| 0.00015189 | 0.27 |
| 0.00015192 | 0.27 |
| 0.00015195 | 0.27 |
| 0.00015198 | 0.27 |
| 0.00015202 | 0.27 |
| 0.00015205 | 0.27 |
| 0.00015208 | 0.27 |
| 0.00015211 | 0.27 |
| 0.00015214 | 0.27 |
| 0.00015218 | 0.266 |
| 0.00015221 | 0.27 |
| 0.00015224 | 0.27 |
| 0.00015227 | 0.27 |
| 0.0001523 | 0.27 |
| 0.00015234 | 0.27 |
| 0.00015237 | 0.266 |
| 0.0001524 | 0.27 |
| 0.00015243 | 0.27 |
| 0.00015246 | 0.27 |
| 0.0001525 | 0.27 |
| 0.00015253 | 0.27 |
| 0.00015256 | 0.266 |
| 0.00015259 | 0.27 |
| 0.00015262 | 0.27 |
| 0.00015266 | 0.27 |
| 0.00015269 | 0.27 |
| 0.00015272 | 0.266 |
| 0.00015275 | 0.27 |
| 0.00015278 | 0.27 |
| 0.00015282 | 0.27 |
| 0.00015285 | 0.27 |
| 0.00015288 | 0.27 |
| 0.00015291 | 0.27 |
| 0.00015294 | 0.27 |
| 0.00015298 | 0.27 |
| 0.00015301 | 0.27 |
| 0.00015304 | 0.27 |
| 0.00015307 | 0.27 |
| 0.0001531 | 0.266 |
| 0.00015314 | 0.27 |
| 0.00015317 | 0.27 |
| 0.0001532 | 0.266 |
| 0.00015323 | 0.27 |
| 0.00015326 | 0.27 |
| 0.0001533 | 0.27 |
| 0.00015333 | 0.27 |
| 0.00015336 | 0.27 |
| 0.00015339 | 0.266 |
| 0.00015342 | 0.27 |
| 0.00015346 | 0.27 |
| 0.00015349 | 0.27 |
| 0.00015352 | 0.27 |
| 0.00015355 | 0.27 |
| 0.00015358 | 0.27 |
| 0.00015362 | 0.266 |
| 0.00015365 | 0.27 |
| 0.00015368 | 0.27 |
| 0.00015371 | 0.27 |
| 0.00015374 | 0.27 |
| 0.00015378 | 0.27 |
| 0.00015381 | 0.27 |
| 0.00015384 | 0.27 |
| 0.00015387 | 0.274 |
| 0.0001539 | 0.274 |
| 0.00015394 | 0.27 |
| 0.00015397 | 0.27 |
| 0.000154 | 0.27 |
| 0.00015403 | 0.274 |
| 0.00015406 | 0.27 |
| 0.0001541 | 0.27 |
| 0.00015413 | 0.27 |
| 0.00015416 | 0.274 |
| 0.00015419 | 0.27 |
| 0.00015422 | 0.27 |
| 0.00015426 | 0.274 |
| 0.00015429 | 0.274 |
| 0.00015432 | 0.274 |
| 0.00015435 | 0.274 |
| 0.00015438 | 0.274 |
| 0.00015442 | 0.274 |
| 0.00015445 | 0.27 |
| 0.00015448 | 0.274 |
| 0.00015451 | 0.27 |
| 0.00015454 | 0.274 |
| 0.00015458 | 0.274 |
| 0.00015461 | 0.274 |
| 0.00015464 | 0.274 |
| 0.00015467 | 0.274 |
| 0.0001547 | 0.274 |
| 0.00015474 | 0.274 |
| 0.00015477 | 0.274 |
| 0.0001548 | 0.274 |
| 0.00015483 | 0.274 |
| 0.00015486 | 0.274 |
| 0.0001549 | 0.274 |
| 0.00015493 | 0.274 |
| 0.00015496 | 0.274 |
| 0.00015499 | 0.274 |
| 0.00015502 | 0.274 |
| 0.00015506 | 0.274 |
| 0.00015509 | 0.274 |
| 0.00015512 | 0.274 |
| 0.00015515 | 0.274 |
| 0.00015518 | 0.274 |
| 0.00015522 | 0.274 |
| 0.00015525 | 0.274 |
| 0.00015528 | 0.274 |
| 0.00015531 | 0.274 |
| 0.00015534 | 0.274 |
| 0.00015538 | 0.274 |
| 0.00015541 | 0.27 |
| 0.00015544 | 0.274 |
| 0.00015547 | 0.274 |
| 0.0001555 | 0.274 |
| 0.00015554 | 0.274 |
| 0.00015557 | 0.27 |
| 0.0001556 | 0.274 |
| 0.00015563 | 0.274 |
| 0.00015566 | 0.274 |
| 0.0001557 | 0.274 |
| 0.00015573 | 0.274 |
| 0.00015576 | 0.274 |
| 0.00015579 | 0.27 |
| 0.00015582 | 0.27 |
| 0.00015586 | 0.274 |
| 0.00015589 | 0.27 |
| 0.00015592 | 0.27 |
| 0.00015595 | 0.27 |
| 0.00015598 | 0.274 |
| 0.00015602 | 0.27 |
| 0.00015605 | 0.27 |
| 0.00015608 | 0.27 |
| 0.00015611 | 0.27 |
| 0.00015614 | 0.27 |
| 0.00015618 | 0.27 |
| 0.00015621 | 0.27 |
| 0.00015624 | 0.27 |
| 0.00015627 | 0.266 |
| 0.0001563 | 0.27 |
| 0.00015634 | 0.27 |
| 0.00015637 | 0.27 |
| 0.0001564 | 0.27 |
| 0.00015643 | 0.27 |
| 0.00015646 | 0.27 |
| 0.0001565 | 0.27 |
| 0.00015653 | 0.27 |
| 0.00015656 | 0.27 |
| 0.00015659 | 0.27 |
| 0.00015662 | 0.266 |
| 0.00015666 | 0.27 |
| 0.00015669 | 0.27 |
| 0.00015672 | 0.27 |
| 0.00015675 | 0.266 |
| 0.00015678 | 0.27 |
| 0.00015682 | 0.266 |
| 0.00015685 | 0.27 |
| 0.00015688 | 0.266 |
| 0.00015691 | 0.266 |
| 0.00015694 | 0.27 |
| 0.00015698 | 0.27 |
| 0.00015701 | 0.27 |
| 0.00015704 | 0.27 |
| 0.00015707 | 0.27 |
| 0.0001571 | 0.27 |
| 0.00015714 | 0.27 |
| 0.00015717 | 0.27 |
| 0.0001572 | 0.27 |
| 0.00015723 | 0.27 |
| 0.00015726 | 0.27 |
| 0.0001573 | 0.27 |
| 0.00015733 | 0.274 |
| 0.00015736 | 0.274 |
| 0.00015739 | 0.274 |
| 0.00015742 | 0.274 |
| 0.00015746 | 0.274 |
| 0.00015749 | 0.274 |
| 0.00015752 | 0.274 |
| 0.00015755 | 0.274 |
| 0.00015758 | 0.274 |
| 0.00015762 | 0.278 |
| 0.00015765 | 0.278 |
| 0.00015768 | 0.278 |
| 0.00015771 | 0.278 |
| 0.00015774 | 0.274 |
| 0.00015778 | 0.274 |
| 0.00015781 | 0.278 |
| 0.00015784 | 0.278 |
| 0.00015787 | 0.278 |
| 0.0001579 | 0.278 |
| 0.00015794 | 0.278 |
| 0.00015797 | 0.278 |
| 0.000158 | 0.278 |
| 0.00015803 | 0.282 |
| 0.00015806 | 0.282 |
| 0.0001581 | 0.278 |
| 0.00015813 | 0.282 |
| 0.00015816 | 0.282 |
| 0.00015819 | 0.282 |
| 0.00015822 | 0.282 |
| 0.00015826 | 0.282 |
| 0.00015829 | 0.282 |
| 0.00015832 | 0.282 |
| 0.00015835 | 0.282 |
| 0.00015838 | 0.278 |
| 0.00015842 | 0.282 |
| 0.00015845 | 0.282 |
| 0.00015848 | 0.282 |
| 0.00015851 | 0.282 |
| 0.00015854 | 0.282 |
| 0.00015858 | 0.282 |
| 0.00015861 | 0.282 |
| 0.00015864 | 0.286 |
| 0.00015867 | 0.282 |
| 0.0001587 | 0.282 |
| 0.00015874 | 0.282 |
| 0.00015877 | 0.282 |
| 0.0001588 | 0.282 |
| 0.00015883 | 0.282 |
| 0.00015886 | 0.282 |
| 0.0001589 | 0.282 |
| 0.00015893 | 0.282 |
| 0.00015896 | 0.278 |
| 0.00015899 | 0.282 |
| 0.00015902 | 0.282 |
| 0.00015906 | 0.278 |
| 0.00015909 | 0.282 |
| 0.00015912 | 0.278 |
| 0.00015915 | 0.282 |
| 0.00015918 | 0.278 |
| 0.00015922 | 0.278 |
| 0.00015925 | 0.278 |
| 0.00015928 | 0.282 |
| 0.00015931 | 0.278 |
| 0.00015934 | 0.278 |
| 0.00015938 | 0.278 |
| 0.00015941 | 0.278 |
| 0.00015944 | 0.278 |
| 0.00015947 | 0.278 |
| 0.0001595 | 0.274 |
| 0.00015954 | 0.274 |
| 0.00015957 | 0.274 |
| 0.0001596 | 0.278 |
| 0.00015963 | 0.274 |
| 0.00015966 | 0.274 |
| 0.0001597 | 0.278 |
| 0.00015973 | 0.274 |
| 0.00015976 | 0.274 |
| 0.00015979 | 0.274 |
| 0.00015982 | 0.274 |
| 0.00015986 | 0.274 |
| 0.00015989 | 0.274 |
| 0.00015992 | 0.274 |
| 0.00015995 | 0.274 |
| 0.00015998 | 0.274 |
| 0.00016002 | 0.274 |
| 0.00016005 | 0.278 |
| 0.00016008 | 0.274 |
| 0.00016011 | 0.27 |
| 0.00016014 | 0.274 |
| 0.00016018 | 0.274 |
| 0.00016021 | 0.274 |
| 0.00016024 | 0.274 |
| 0.00016027 | 0.27 |
| 0.0001603 | 0.274 |
| 0.00016034 | 0.274 |
| 0.00016037 | 0.27 |
| 0.0001604 | 0.274 |
| 0.00016043 | 0.274 |
| 0.00016046 | 0.274 |
| 0.0001605 | 0.274 |
| 0.00016053 | 0.274 |
| 0.00016056 | 0.274 |
| 0.00016059 | 0.274 |
| 0.00016062 | 0.274 |
| 0.00016066 | 0.274 |
| 0.00016069 | 0.274 |
| 0.00016072 | 0.274 |
| 0.00016075 | 0.274 |
| 0.00016078 | 0.274 |
| 0.00016082 | 0.274 |
| 0.00016085 | 0.278 |
| 0.00016088 | 0.278 |
| 0.00016091 | 0.278 |
| 0.00016094 | 0.278 |
| 0.00016098 | 0.274 |
| 0.00016101 | 0.274 |
| 0.00016104 | 0.278 |
| 0.00016107 | 0.278 |
| 0.0001611 | 0.278 |
| 0.00016114 | 0.278 |
| 0.00016117 | 0.282 |
| 0.0001612 | 0.282 |
| 0.00016123 | 0.282 |
| 0.00016126 | 0.282 |
| 0.0001613 | 0.282 |
| 0.00016133 | 0.278 |
| 0.00016136 | 0.282 |
| 0.00016139 | 0.282 |
| 0.00016142 | 0.286 |
| 0.00016146 | 0.286 |
| 0.00016149 | 0.282 |
| 0.00016152 | 0.286 |
| 0.00016155 | 0.282 |
| 0.00016158 | 0.282 |
| 0.00016162 | 0.282 |
| 0.00016165 | 0.282 |
| 0.00016168 | 0.286 |
| 0.00016171 | 0.282 |
| 0.00016174 | 0.286 |
| 0.00016178 | 0.286 |
| 0.00016181 | 0.286 |
| 0.00016184 | 0.286 |
| 0.00016187 | 0.286 |
| 0.0001619 | 0.286 |
| 0.00016194 | 0.286 |
| 0.00016197 | 0.286 |
| 0.000162 | 0.286 |
| 0.00016203 | 0.286 |
| 0.00016206 | 0.286 |
| 0.0001621 | 0.286 |
| 0.00016213 | 0.286 |
| 0.00016216 | 0.286 |
| 0.00016219 | 0.29 |
| 0.00016222 | 0.286 |
| 0.00016226 | 0.286 |
| 0.00016229 | 0.286 |
| 0.00016232 | 0.286 |
| 0.00016235 | 0.286 |
| 0.00016238 | 0.286 |
| 0.00016242 | 0.286 |
| 0.00016245 | 0.286 |
| 0.00016248 | 0.286 |
| 0.00016251 | 0.286 |
| 0.00016254 | 0.286 |
| 0.00016258 | 0.286 |
| 0.00016261 | 0.286 |
| 0.00016264 | 0.286 |
| 0.00016267 | 0.286 |
| 0.0001627 | 0.286 |
| 0.00016274 | 0.286 |
| 0.00016277 | 0.286 |
| 0.0001628 | 0.286 |
| 0.00016283 | 0.282 |
| 0.00016286 | 0.282 |
| 0.0001629 | 0.286 |
| 0.00016293 | 0.286 |
| 0.00016296 | 0.282 |
| 0.00016299 | 0.282 |
| 0.00016302 | 0.286 |
| 0.00016306 | 0.282 |
| 0.00016309 | 0.282 |
| 0.00016312 | 0.286 |
| 0.00016315 | 0.282 |
| 0.00016318 | 0.286 |
| 0.00016322 | 0.282 |
| 0.00016325 | 0.282 |
| 0.00016328 | 0.282 |
| 0.00016331 | 0.282 |
| 0.00016334 | 0.282 |
| 0.00016338 | 0.282 |
| 0.00016341 | 0.282 |
| 0.00016344 | 0.282 |
| 0.00016347 | 0.282 |
| 0.0001635 | 0.282 |
| 0.00016354 | 0.282 |
| 0.00016357 | 0.282 |
| 0.0001636 | 0.282 |
| 0.00016363 | 0.278 |
| 0.00016366 | 0.282 |
| 0.0001637 | 0.278 |
| 0.00016373 | 0.282 |
| 0.00016376 | 0.282 |
| 0.00016379 | 0.282 |
| 0.00016382 | 0.278 |
| 0.00016386 | 0.278 |
| 0.00016389 | 0.278 |
| 0.00016392 | 0.282 |
| 0.00016395 | 0.278 |
| 0.00016398 | 0.282 |
| 0.00016402 | 0.282 |
| 0.00016405 | 0.282 |
| 0.00016408 | 0.282 |
| 0.00016411 | 0.278 |
| 0.00016414 | 0.278 |
| 0.00016418 | 0.282 |
| 0.00016421 | 0.278 |
| 0.00016424 | 0.282 |
| 0.00016427 | 0.282 |
| 0.0001643 | 0.282 |
| 0.00016434 | 0.282 |
| 0.00016437 | 0.282 |
| 0.0001644 | 0.282 |
| 0.00016443 | 0.278 |
| 0.00016446 | 0.282 |
| 0.0001645 | 0.282 |
| 0.00016453 | 0.278 |
| 0.00016456 | 0.282 |
| 0.00016459 | 0.278 |
| 0.00016462 | 0.282 |
| 0.00016466 | 0.282 |
| 0.00016469 | 0.278 |
| 0.00016472 | 0.282 |
| 0.00016475 | 0.282 |
| 0.00016478 | 0.282 |
| 0.00016482 | 0.282 |
| 0.00016485 | 0.278 |
| 0.00016488 | 0.278 |
| 0.00016491 | 0.282 |
| 0.00016494 | 0.282 |
| 0.00016498 | 0.278 |
| 0.00016501 | 0.282 |
| 0.00016504 | 0.282 |
| 0.00016507 | 0.282 |
| 0.0001651 | 0.282 |
| 0.00016514 | 0.282 |
| 0.00016517 | 0.282 |
| 0.0001652 | 0.282 |
| 0.00016523 | 0.282 |
| 0.00016526 | 0.282 |
| 0.0001653 | 0.282 |
| 0.00016533 | 0.282 |
| 0.00016536 | 0.282 |
| 0.00016539 | 0.282 |
| 0.00016542 | 0.286 |
| 0.00016546 | 0.282 |
| 0.00016549 | 0.282 |
| 0.00016552 | 0.282 |
| 0.00016555 | 0.282 |
| 0.00016558 | 0.282 |
| 0.00016562 | 0.282 |
| 0.00016565 | 0.282 |
| 0.00016568 | 0.286 |
| 0.00016571 | 0.282 |
| 0.00016574 | 0.282 |
| 0.00016578 | 0.286 |
| 0.00016581 | 0.286 |
| 0.00016584 | 0.282 |
| 0.00016587 | 0.286 |
| 0.0001659 | 0.286 |
| 0.00016594 | 0.286 |
| 0.00016597 | 0.282 |
| 0.000166 | 0.286 |
| 0.00016603 | 0.286 |
| 0.00016606 | 0.286 |
| 0.0001661 | 0.286 |
| 0.00016613 | 0.282 |
| 0.00016616 | 0.282 |
| 0.00016619 | 0.286 |
| 0.00016622 | 0.286 |
| 0.00016626 | 0.286 |
| 0.00016629 | 0.282 |
| 0.00016632 | 0.286 |
| 0.00016635 | 0.286 |
| 0.00016638 | 0.282 |
| 0.00016642 | 0.282 |
| 0.00016645 | 0.286 |
| 0.00016648 | 0.282 |
| 0.00016651 | 0.282 |
| 0.00016654 | 0.282 |
| 0.00016658 | 0.286 |
| 0.00016661 | 0.286 |
| 0.00016664 | 0.282 |
| 0.00016667 | 0.286 |
| 0.0001667 | 0.286 |
| 0.00016674 | 0.282 |
| 0.00016677 | 0.282 |
| 0.0001668 | 0.282 |
| 0.00016683 | 0.282 |
| 0.00016686 | 0.282 |
| 0.0001669 | 0.282 |
| 0.00016693 | 0.282 |
| 0.00016696 | 0.278 |
| 0.00016699 | 0.278 |
| 0.00016702 | 0.282 |
| 0.00016706 | 0.278 |
| 0.00016709 | 0.278 |
| 0.00016712 | 0.282 |
| 0.00016715 | 0.278 |
| 0.00016718 | 0.278 |
| 0.00016722 | 0.278 |
| 0.00016725 | 0.282 |
| 0.00016728 | 0.278 |
| 0.00016731 | 0.278 |
| 0.00016734 | 0.278 |
| 0.00016738 | 0.278 |
| 0.00016741 | 0.278 |
| 0.00016744 | 0.278 |
| 0.00016747 | 0.278 |
| 0.0001675 | 0.278 |
| 0.00016754 | 0.278 |
| 0.00016757 | 0.274 |
| 0.0001676 | 0.278 |
| 0.00016763 | 0.274 |
| 0.00016766 | 0.278 |
| 0.0001677 | 0.274 |
| 0.00016773 | 0.274 |
| 0.00016776 | 0.274 |
| 0.00016779 | 0.278 |
| 0.00016782 | 0.274 |
| 0.00016786 | 0.278 |
| 0.00016789 | 0.278 |
| 0.00016792 | 0.274 |
| 0.00016795 | 0.278 |
| 0.00016798 | 0.274 |
| 0.00016802 | 0.274 |
| 0.00016805 | 0.274 |
| 0.00016808 | 0.274 |
| 0.00016811 | 0.274 |
| 0.00016814 | 0.274 |
| 0.00016818 | 0.274 |
| 0.00016821 | 0.274 |
| 0.00016824 | 0.274 |
| 0.00016827 | 0.274 |
| 0.0001683 | 0.274 |
| 0.00016834 | 0.274 |
| 0.00016837 | 0.274 |
| 0.0001684 | 0.274 |
| 0.00016843 | 0.274 |
| 0.00016846 | 0.274 |
| 0.0001685 | 0.274 |
| 0.00016853 | 0.274 |
| 0.00016856 | 0.274 |
| 0.00016859 | 0.274 |
| 0.00016862 | 0.274 |
| 0.00016866 | 0.274 |
| 0.00016869 | 0.274 |
| 0.00016872 | 0.278 |
| 0.00016875 | 0.274 |
| 0.00016878 | 0.274 |
| 0.00016882 | 0.274 |
| 0.00016885 | 0.274 |
| 0.00016888 | 0.274 |
| 0.00016891 | 0.27 |
| 0.00016894 | 0.274 |
| 0.00016898 | 0.274 |
| 0.00016901 | 0.274 |
| 0.00016904 | 0.274 |
| 0.00016907 | 0.274 |
| 0.0001691 | 0.274 |
| 0.00016914 | 0.274 |
| 0.00016917 | 0.274 |
| 0.0001692 | 0.274 |
| 0.00016923 | 0.278 |
| 0.00016926 | 0.278 |
| 0.0001693 | 0.274 |
| 0.00016933 | 0.274 |
| 0.00016936 | 0.274 |
| 0.00016939 | 0.274 |
| 0.00016942 | 0.274 |
| 0.00016946 | 0.278 |
| 0.00016949 | 0.274 |
| 0.00016952 | 0.274 |
| 0.00016955 | 0.274 |
| 0.00016958 | 0.274 |
| 0.00016962 | 0.274 |
| 0.00016965 | 0.274 |
| 0.00016968 | 0.274 |
| 0.00016971 | 0.274 |
| 0.00016974 | 0.274 |
| 0.00016978 | 0.274 |
| 0.00016981 | 0.274 |
| 0.00016984 | 0.274 |
| 0.00016987 | 0.274 |
| 0.0001699 | 0.274 |
| 0.00016994 | 0.274 |
| 0.00016997 | 0.274 |
| 0.00017 | 0.278 |
| 0.00017003 | 0.274 |
| 0.00017006 | 0.274 |
| 0.0001701 | 0.274 |
| 0.00017013 | 0.274 |
| 0.00017016 | 0.274 |
| 0.00017019 | 0.274 |
| 0.00017022 | 0.274 |
| 0.00017026 | 0.274 |
| 0.00017029 | 0.274 |
| 0.00017032 | 0.274 |
| 0.00017035 | 0.274 |
| 0.00017038 | 0.274 |
| 0.00017042 | 0.274 |
| 0.00017045 | 0.274 |
| 0.00017048 | 0.274 |
| 0.00017051 | 0.27 |
| 0.00017054 | 0.274 |
| 0.00017058 | 0.274 |
| 0.00017061 | 0.27 |
| 0.00017064 | 0.27 |
| 0.00017067 | 0.27 |
| 0.0001707 | 0.274 |
| 0.00017074 | 0.274 |